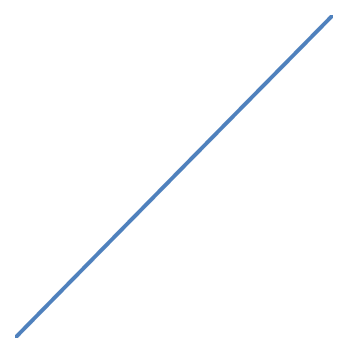
| Category | Series 0 |
|---|---|
| 0.0 | 0 |
| 0.0001 | 0 |
| 0.0002 | 0 |
| 0.0003 | 0 |
| 0.0004 | 0 |
| 0.0005 | 0 |
| 0.0006 | 0.001 |
| 0.0007 | 0.001 |
| 0.0008 | 0.001 |
| 0.0009 | 0.001 |
| 0.001 | 0.001 |
| 0.0011 | 0.001 |
| 0.0012 | 0.001 |
| 0.0013 | 0.001 |
| 0.0014 | 0.001 |
| 0.0015 | 0.001 |
| 0.0016 | 0.002 |
| 0.0017 | 0.002 |
| 0.0018 | 0.002 |
| 0.0019 | 0.002 |
| 0.002 | 0.002 |
| 0.0021 | 0.002 |
| 0.0022 | 0.002 |
| 0.0023 | 0.002 |
| 0.0024 | 0.002 |
| 0.0025 | 0.002 |
| 0.0026 | 0.003 |
| 0.0027 | 0.003 |
| 0.0028 | 0.003 |
| 0.0029 | 0.003 |
| 0.003 | 0.003 |
| 0.0031 | 0.003 |
| 0.0032 | 0.003 |
| 0.0033 | 0.003 |
| 0.0034 | 0.003 |
| 0.0035 | 0.003 |
| 0.0036 | 0.004 |
| 0.0037 | 0.004 |
| 0.0038 | 0.004 |
| 0.0039 | 0.004 |
| 0.004 | 0.004 |
| 0.0041 | 0.004 |
| 0.0042 | 0.004 |
| 0.0043 | 0.004 |
| 0.0044 | 0.004 |
| 0.0045 | 0.004 |
| 0.0046 | 0.005 |
| 0.0047 | 0.005 |
| 0.0048 | 0.005 |
| 0.0049 | 0.005 |
| 0.005 | 0.005 |
| 0.0051 | 0.005 |
| 0.0052 | 0.005 |
| 0.0053 | 0.005 |
| 0.0054 | 0.005 |
| 0.0055 | 0.005 |
| 0.0056 | 0.006 |
| 0.0057 | 0.006 |
| 0.0058 | 0.006 |
| 0.0059 | 0.006 |
| 0.006 | 0.006 |
| 0.0061 | 0.006 |
| 0.0062 | 0.006 |
| 0.0063 | 0.006 |
| 0.0064 | 0.006 |
| 0.0065 | 0.006 |
| 0.0066 | 0.007 |
| 0.0067 | 0.007 |
| 0.0068 | 0.007 |
| 0.0069 | 0.007 |
| 0.007 | 0.007 |
| 0.0071 | 0.007 |
| 0.0072 | 0.007 |
| 0.0073 | 0.007 |
| 0.0074 | 0.007 |
| 0.0075 | 0.007 |
| 0.0076 | 0.008 |
| 0.0077 | 0.008 |
| 0.0078 | 0.008 |
| 0.0079 | 0.008 |
| 0.008 | 0.008 |
| 0.0081 | 0.008 |
| 0.0082 | 0.008 |
| 0.0083 | 0.008 |
| 0.0084 | 0.008 |
| 0.0085 | 0.008 |
| 0.0086 | 0.009 |
| 0.0087 | 0.009 |
| 0.0088 | 0.009 |
| 0.0089 | 0.009 |
| 0.009 | 0.009 |
| 0.0091 | 0.009 |
| 0.0092 | 0.009 |
| 0.0093 | 0.009 |
| 0.0094 | 0.009 |
| 0.0095 | 0.009 |
| 0.0096 | 0.01 |
| 0.0097 | 0.01 |
| 0.0098 | 0.01 |
| 0.0099 | 0.01 |
| 0.01 | 0.01 |
| 0.0101 | 0.01 |
| 0.0102 | 0.01 |
| 0.0103 | 0.01 |
| 0.0104 | 0.01 |
| 0.0105 | 0.01 |
| 0.0106 | 0.011 |
| 0.0107 | 0.011 |
| 0.0108 | 0.011 |
| 0.0109 | 0.011 |
| 0.011 | 0.011 |
| 0.0111 | 0.011 |
| 0.0112 | 0.011 |
| 0.0113 | 0.011 |
| 0.0114 | 0.011 |
| 0.0115 | 0.011 |
| 0.0116 | 0.012 |
| 0.0117 | 0.012 |
| 0.0118 | 0.012 |
| 0.0119 | 0.012 |
| 0.012 | 0.012 |
| 0.0121 | 0.012 |
| 0.0122 | 0.012 |
| 0.0123 | 0.012 |
| 0.0124 | 0.012 |
| 0.0125 | 0.012 |
| 0.0126 | 0.013 |
| 0.0127 | 0.013 |
| 0.0128 | 0.013 |
| 0.0129 | 0.013 |
| 0.013 | 0.013 |
| 0.0131 | 0.013 |
| 0.0132 | 0.013 |
| 0.0133 | 0.013 |
| 0.0134 | 0.013 |
| 0.0135 | 0.014 |
| 0.0136 | 0.014 |
| 0.0137 | 0.014 |
| 0.0138 | 0.014 |
| 0.0139 | 0.014 |
| 0.014 | 0.014 |
| 0.0141 | 0.014 |
| 0.0142 | 0.014 |
| 0.0143 | 0.014 |
| 0.0144 | 0.014 |
| 0.0145 | 0.015 |
| 0.0146 | 0.015 |
| 0.0147 | 0.015 |
| 0.0148 | 0.015 |
| 0.0149 | 0.015 |
| 0.015 | 0.015 |
| 0.0151 | 0.015 |
| 0.0152 | 0.015 |
| 0.0153 | 0.015 |
| 0.0154 | 0.015 |
| 0.0155 | 0.016 |
| 0.0156 | 0.016 |
| 0.0157 | 0.016 |
| 0.0158 | 0.016 |
| 0.0159 | 0.016 |
| 0.016 | 0.016 |
| 0.0161 | 0.016 |
| 0.0162 | 0.016 |
| 0.0163 | 0.016 |
| 0.0164 | 0.016 |
| 0.0165 | 0.017 |
| 0.0166 | 0.017 |
| 0.0167 | 0.017 |
| 0.0168 | 0.017 |
| 0.0169 | 0.017 |
| 0.017 | 0.017 |
| 0.0171 | 0.017 |
| 0.0172 | 0.017 |
| 0.0173 | 0.017 |
| 0.0174 | 0.017 |
| 0.0175 | 0.018 |
| 0.0176 | 0.018 |
| 0.0177 | 0.018 |
| 0.0178 | 0.018 |
| 0.0179 | 0.018 |
| 0.018 | 0.018 |
| 0.0181 | 0.018 |
| 0.0182 | 0.018 |
| 0.0183 | 0.018 |
| 0.0184 | 0.018 |
| 0.0185 | 0.019 |
| 0.0186 | 0.019 |
| 0.0187 | 0.019 |
| 0.0188 | 0.019 |
| 0.0189 | 0.019 |
| 0.019 | 0.019 |
| 0.0191 | 0.019 |
| 0.0192 | 0.019 |
| 0.0193 | 0.019 |
| 0.0194 | 0.019 |
| 0.0195 | 0.02 |
| 0.0196 | 0.02 |
| 0.0197 | 0.02 |
| 0.0198 | 0.02 |
| 0.0199 | 0.02 |
| 0.02 | 0.02 |
| 0.0201 | 0.02 |
| 0.0202 | 0.02 |
| 0.0203 | 0.02 |
| 0.0204 | 0.02 |
| 0.0205 | 0.021 |
| 0.0206 | 0.021 |
| 0.0207 | 0.021 |
| 0.0208 | 0.021 |
| 0.0209 | 0.021 |
| 0.021 | 0.021 |
| 0.0211 | 0.021 |
| 0.0212 | 0.021 |
| 0.0213 | 0.021 |
| 0.0214 | 0.021 |
| 0.0215 | 0.022 |
| 0.0216 | 0.022 |
| 0.0217 | 0.022 |
| 0.0218 | 0.022 |
| 0.0219 | 0.022 |
| 0.022 | 0.022 |
| 0.0221 | 0.022 |
| 0.0222 | 0.022 |
| 0.0223 | 0.022 |
| 0.0224 | 0.022 |
| 0.0225 | 0.023 |
| 0.0226 | 0.023 |
| 0.0227 | 0.023 |
| 0.0228 | 0.023 |
| 0.0229 | 0.023 |
| 0.023 | 0.023 |
| 0.0231 | 0.023 |
| 0.0232 | 0.023 |
| 0.0233 | 0.023 |
| 0.0234 | 0.023 |
| 0.0235 | 0.024 |
| 0.0236 | 0.024 |
| 0.0237 | 0.024 |
| 0.0238 | 0.024 |
| 0.0239 | 0.024 |
| 0.024 | 0.024 |
| 0.0241 | 0.024 |
| 0.0242 | 0.024 |
| 0.0243 | 0.024 |
| 0.0244 | 0.024 |
| 0.0245 | 0.025 |
| 0.0246 | 0.025 |
| 0.0247 | 0.025 |
| 0.0248 | 0.025 |
| 0.0249 | 0.025 |
| 0.025 | 0.025 |
| 0.0251 | 0.025 |
| 0.0252 | 0.025 |
| 0.0253 | 0.025 |
| 0.0254 | 0.025 |
| 0.0255 | 0.026 |
| 0.0256 | 0.026 |
| 0.0257 | 0.026 |
| 0.0258 | 0.026 |
| 0.0259 | 0.026 |
| 0.026 | 0.026 |
| 0.0261 | 0.026 |
| 0.0262 | 0.026 |
| 0.0263 | 0.026 |
| 0.0264 | 0.026 |
| 0.0265 | 0.027 |
| 0.0266 | 0.027 |
| 0.0267 | 0.027 |
| 0.0268 | 0.027 |
| 0.0269 | 0.027 |
| 0.027 | 0.027 |
| 0.0271 | 0.027 |
| 0.0272 | 0.027 |
| 0.0273 | 0.027 |
| 0.0274 | 0.027 |
| 0.0275 | 0.028 |
| 0.0276 | 0.028 |
| 0.0277 | 0.028 |
| 0.0278 | 0.028 |
| 0.0279 | 0.028 |
| 0.028 | 0.028 |
| 0.0281 | 0.028 |
| 0.0282 | 0.028 |
| 0.0283 | 0.028 |
| 0.0284 | 0.028 |
| 0.0285 | 0.029 |
| 0.0286 | 0.029 |
| 0.0287 | 0.029 |
| 0.0288 | 0.029 |
| 0.0289 | 0.029 |
| 0.029 | 0.029 |
| 0.0291 | 0.029 |
| 0.0292 | 0.029 |
| 0.0293 | 0.029 |
| 0.0294 | 0.029 |
| 0.0295 | 0.03 |
| 0.0296 | 0.03 |
| 0.0297 | 0.03 |
| 0.0298 | 0.03 |
| 0.0299 | 0.03 |
| 0.03 | 0.03 |
| 0.0301 | 0.03 |
| 0.0302 | 0.03 |
| 0.0303 | 0.03 |
| 0.0304 | 0.03 |
| 0.0305 | 0.031 |
| 0.0306 | 0.031 |
| 0.0307 | 0.031 |
| 0.0308 | 0.031 |
| 0.0309 | 0.031 |
| 0.031 | 0.031 |
| 0.0311 | 0.031 |
| 0.0312 | 0.031 |
| 0.0313 | 0.031 |
| 0.0314 | 0.031 |
| 0.0315 | 0.032 |
| 0.0316 | 0.032 |
| 0.0317 | 0.032 |
| 0.0318 | 0.032 |
| 0.0319 | 0.032 |
| 0.032 | 0.032 |
| 0.0321 | 0.032 |
| 0.0322 | 0.032 |
| 0.0323 | 0.032 |
| 0.0324 | 0.032 |
| 0.0325 | 0.033 |
| 0.0326 | 0.033 |
| 0.0327 | 0.033 |
| 0.0328 | 0.033 |
| 0.0329 | 0.033 |
| 0.033 | 0.033 |
| 0.0331 | 0.033 |
| 0.0332 | 0.033 |
| 0.0333 | 0.033 |
| 0.0334 | 0.033 |
| 0.0335 | 0.034 |
| 0.0336 | 0.034 |
| 0.0337 | 0.034 |
| 0.0338 | 0.034 |
| 0.0339 | 0.034 |
| 0.034 | 0.034 |
| 0.0341 | 0.034 |
| 0.0342 | 0.034 |
| 0.0343 | 0.034 |
| 0.0344 | 0.034 |
| 0.0345 | 0.035 |
| 0.0346 | 0.035 |
| 0.0347 | 0.035 |
| 0.0348 | 0.035 |
| 0.0349 | 0.035 |
| 0.035 | 0.035 |
| 0.0351 | 0.035 |
| 0.0352 | 0.035 |
| 0.0353 | 0.035 |
| 0.0354 | 0.035 |
| 0.0355 | 0.036 |
| 0.0356 | 0.036 |
| 0.0357 | 0.036 |
| 0.0358 | 0.036 |
| 0.0359 | 0.036 |
| 0.036 | 0.036 |
| 0.0361 | 0.036 |
| 0.0362 | 0.036 |
| 0.0363 | 0.036 |
| 0.0364 | 0.036 |
| 0.0365 | 0.037 |
| 0.0366 | 0.037 |
| 0.0367 | 0.037 |
| 0.0368 | 0.037 |
| 0.0369 | 0.037 |
| 0.037 | 0.037 |
| 0.0371 | 0.037 |
| 0.0372 | 0.037 |
| 0.0373 | 0.037 |
| 0.0374 | 0.037 |
| 0.0375 | 0.038 |
| 0.0376 | 0.038 |
| 0.0377 | 0.038 |
| 0.0378 | 0.038 |
| 0.0379 | 0.038 |
| 0.038 | 0.038 |
| 0.0381 | 0.038 |
| 0.0382 | 0.038 |
| 0.0383 | 0.038 |
| 0.0384 | 0.038 |
| 0.0385 | 0.039 |
| 0.0386 | 0.039 |
| 0.0387 | 0.039 |
| 0.0388 | 0.039 |
| 0.0389 | 0.039 |
| 0.039 | 0.039 |
| 0.0391 | 0.039 |
| 0.0392 | 0.039 |
| 0.0393 | 0.039 |
| 0.0394 | 0.039 |
| 0.0395 | 0.04 |
| 0.0396 | 0.04 |
| 0.0397 | 0.04 |
| 0.0398 | 0.04 |
| 0.0399 | 0.04 |
| 0.04 | 0.04 |
| 0.0401 | 0.04 |
| 0.0402 | 0.04 |
| 0.0403 | 0.04 |
| 0.0404 | 0.04 |
| 0.0405 | 0.041 |
| 0.0406 | 0.041 |
| 0.0407 | 0.041 |
| 0.0408 | 0.041 |
| 0.0409 | 0.041 |
| 0.041 | 0.041 |
| 0.0411 | 0.041 |
| 0.0412 | 0.041 |
| 0.0413 | 0.041 |
| 0.0414 | 0.041 |
| 0.0415 | 0.042 |
| 0.0416 | 0.042 |
| 0.0417 | 0.042 |
| 0.0418 | 0.042 |
| 0.0419 | 0.042 |
| 0.042 | 0.042 |
| 0.0421 | 0.042 |
| 0.0422 | 0.042 |
| 0.0423 | 0.042 |
| 0.0424 | 0.042 |
| 0.0425 | 0.043 |
| 0.0426 | 0.043 |
| 0.0427 | 0.043 |
| 0.0428 | 0.043 |
| 0.0429 | 0.043 |
| 0.043 | 0.043 |
| 0.0431 | 0.043 |
| 0.0432 | 0.043 |
| 0.0433 | 0.043 |
| 0.0434 | 0.043 |
| 0.0435 | 0.044 |
| 0.0436 | 0.044 |
| 0.0437 | 0.044 |
| 0.0438 | 0.044 |
| 0.0439 | 0.044 |
| 0.044 | 0.044 |
| 0.0441 | 0.044 |
| 0.0442 | 0.044 |
| 0.0443 | 0.044 |
| 0.0444 | 0.044 |
| 0.0445 | 0.045 |
| 0.0446 | 0.045 |
| 0.0447 | 0.045 |
| 0.0448 | 0.045 |
| 0.0449 | 0.045 |
| 0.045 | 0.045 |
| 0.0451 | 0.045 |
| 0.0452 | 0.045 |
| 0.0453 | 0.045 |
| 0.0454 | 0.046 |
| 0.0455 | 0.046 |
| 0.0456 | 0.046 |
| 0.0457 | 0.046 |
| 0.0458 | 0.046 |
| 0.0459 | 0.046 |
| 0.046 | 0.046 |
| 0.0461 | 0.046 |
| 0.0462 | 0.046 |
| 0.0463 | 0.046 |
| 0.0464 | 0.047 |
| 0.0465 | 0.047 |
| 0.0466 | 0.047 |
| 0.0467 | 0.047 |
| 0.0468 | 0.047 |
| 0.0469 | 0.047 |
| 0.047 | 0.047 |
| 0.0471 | 0.047 |
| 0.0472 | 0.047 |
| 0.0473 | 0.047 |
| 0.0474 | 0.047 |
| 0.0475 | 0.048 |
| 0.0476 | 0.048 |
| 0.0477 | 0.048 |
| 0.0478 | 0.048 |
| 0.0479 | 0.048 |
| 0.048 | 0.048 |
| 0.0481 | 0.048 |
| 0.0482 | 0.048 |
| 0.0483 | 0.048 |
| 0.0484 | 0.048 |
| 0.0485 | 0.049 |
| 0.0486 | 0.049 |
| 0.0487 | 0.049 |
| 0.0488 | 0.049 |
| 0.0489 | 0.049 |
| 0.049 | 0.049 |
| 0.0491 | 0.049 |
| 0.0492 | 0.049 |
| 0.0493 | 0.049 |
| 0.0494 | 0.049 |
| 0.0495 | 0.05 |
| 0.0496 | 0.05 |
| 0.0497 | 0.05 |
| 0.0498 | 0.05 |
| 0.0499 | 0.05 |
| 0.05 | 0.05 |
| 0.0501 | 0.05 |
| 0.0502 | 0.05 |
| 0.0503 | 0.05 |
| 0.0504 | 0.051 |
| 0.0505 | 0.051 |
| 0.0506 | 0.051 |
| 0.0507 | 0.051 |
| 0.0508 | 0.051 |
| 0.0509 | 0.051 |
| 0.051 | 0.051 |
| 0.0511 | 0.051 |
| 0.0512 | 0.051 |
| 0.0513 | 0.051 |
| 0.0514 | 0.051 |
| 0.0515 | 0.052 |
| 0.0516 | 0.052 |
| 0.0517 | 0.052 |
| 0.0518 | 0.052 |
| 0.0519 | 0.052 |
| 0.052 | 0.052 |
| 0.0521 | 0.052 |
| 0.0522 | 0.052 |
| 0.0523 | 0.052 |
| 0.0524 | 0.052 |
| 0.0525 | 0.053 |
| 0.0526 | 0.053 |
| 0.0527 | 0.053 |
| 0.0528 | 0.053 |
| 0.0529 | 0.053 |
| 0.053 | 0.053 |
| 0.0531 | 0.053 |
| 0.0532 | 0.053 |
| 0.0533 | 0.053 |
| 0.0534 | 0.054 |
| 0.0535 | 0.054 |
| 0.0536 | 0.054 |
| 0.0537 | 0.054 |
| 0.0538 | 0.054 |
| 0.0539 | 0.054 |
| 0.054 | 0.054 |
| 0.0541 | 0.054 |
| 0.0542 | 0.054 |
| 0.0543 | 0.054 |
| 0.0544 | 0.055 |
| 0.0545 | 0.055 |
| 0.0546 | 0.055 |
| 0.0547 | 0.055 |
| 0.0548 | 0.055 |
| 0.0549 | 0.055 |
| 0.055 | 0.055 |
| 0.0551 | 0.055 |
| 0.0552 | 0.055 |
| 0.0553 | 0.055 |
| 0.0554 | 0.056 |
| 0.0555 | 0.056 |
| 0.0556 | 0.056 |
| 0.0557 | 0.056 |
| 0.0558 | 0.056 |
| 0.0559 | 0.056 |
| 0.056 | 0.056 |
| 0.0561 | 0.056 |
| 0.0562 | 0.056 |
| 0.0563 | 0.056 |
| 0.0564 | 0.057 |
| 0.0565 | 0.057 |
| 0.0566 | 0.057 |
| 0.0567 | 0.057 |
| 0.0568 | 0.057 |
| 0.0569 | 0.057 |
| 0.057 | 0.057 |
| 0.0571 | 0.057 |
| 0.0572 | 0.057 |
| 0.0573 | 0.057 |
| 0.0574 | 0.058 |
| 0.0575 | 0.058 |
| 0.0576 | 0.058 |
| 0.0577 | 0.058 |
| 0.0578 | 0.058 |
| 0.0579 | 0.058 |
| 0.058 | 0.058 |
| 0.0581 | 0.058 |
| 0.0582 | 0.058 |
| 0.0583 | 0.058 |
| 0.0584 | 0.059 |
| 0.0585 | 0.059 |
| 0.0586 | 0.059 |
| 0.0587 | 0.059 |
| 0.0588 | 0.059 |
| 0.0589 | 0.059 |
| 0.059 | 0.059 |
| 0.0591 | 0.059 |
| 0.0592 | 0.059 |
| 0.0593 | 0.059 |
| 0.0594 | 0.059 |
| 0.0595 | 0.06 |
| 0.0596 | 0.06 |
| 0.0597 | 0.06 |
| 0.0598 | 0.06 |
| 0.0599 | 0.06 |
| 0.06 | 0.06 |
| 0.0601 | 0.06 |
| 0.0602 | 0.06 |
| 0.0603 | 0.06 |
| 0.0604 | 0.06 |
| 0.0605 | 0.061 |
| 0.0606 | 0.061 |
| 0.0607 | 0.061 |
| 0.0608 | 0.061 |
| 0.0609 | 0.061 |
| 0.061 | 0.061 |
| 0.0611 | 0.061 |
| 0.0612 | 0.061 |
| 0.0613 | 0.061 |
| 0.0614 | 0.062 |
| 0.0615 | 0.062 |
| 0.0616 | 0.062 |
| 0.0617 | 0.062 |
| 0.0618 | 0.062 |
| 0.0619 | 0.062 |
| 0.062 | 0.062 |
| 0.0621 | 0.062 |
| 0.0622 | 0.062 |
| 0.0623 | 0.062 |
| 0.0624 | 0.062 |
| 0.0625 | 0.063 |
| 0.0626 | 0.063 |
| 0.0627 | 0.063 |
| 0.0628 | 0.063 |
| 0.0629 | 0.063 |
| 0.063 | 0.063 |
| 0.0631 | 0.063 |
| 0.0632 | 0.063 |
| 0.0633 | 0.063 |
| 0.0634 | 0.064 |
| 0.0635 | 0.064 |
| 0.0636 | 0.064 |
| 0.0637 | 0.064 |
| 0.0638 | 0.064 |
| 0.0639 | 0.064 |
| 0.064 | 0.064 |
| 0.0641 | 0.064 |
| 0.0642 | 0.064 |
| 0.0643 | 0.064 |
| 0.0644 | 0.065 |
| 0.0645 | 0.065 |
| 0.0646 | 0.065 |
| 0.0647 | 0.065 |
| 0.0648 | 0.065 |
| 0.0649 | 0.065 |
| 0.065 | 0.065 |
| 0.0651 | 0.065 |
| 0.0652 | 0.065 |
| 0.0653 | 0.065 |
| 0.0654 | 0.066 |
| 0.0655 | 0.066 |
| 0.0656 | 0.066 |
| 0.0657 | 0.066 |
| 0.0658 | 0.066 |
| 0.0659 | 0.066 |
| 0.066 | 0.066 |
| 0.0661 | 0.066 |
| 0.0662 | 0.066 |
| 0.0663 | 0.066 |
| 0.0664 | 0.067 |
| 0.0665 | 0.067 |
| 0.0666 | 0.067 |
| 0.0667 | 0.067 |
| 0.0668 | 0.067 |
| 0.0669 | 0.067 |
| 0.067 | 0.067 |
| 0.0671 | 0.067 |
| 0.0672 | 0.067 |
| 0.0673 | 0.067 |
| 0.0674 | 0.068 |
| 0.0675 | 0.068 |
| 0.0676 | 0.068 |
| 0.0677 | 0.068 |
| 0.0678 | 0.068 |
| 0.0679 | 0.068 |
| 0.068 | 0.068 |
| 0.0681 | 0.068 |
| 0.0682 | 0.068 |
| 0.0683 | 0.068 |
| 0.0684 | 0.069 |
| 0.0685 | 0.069 |
| 0.0686 | 0.069 |
| 0.0687 | 0.069 |
| 0.0688 | 0.069 |
| 0.0689 | 0.069 |
| 0.069 | 0.069 |
| 0.0691 | 0.069 |
| 0.0692 | 0.069 |
| 0.0693 | 0.069 |
| 0.0694 | 0.07 |
| 0.0695 | 0.07 |
| 0.0696 | 0.07 |
| 0.0697 | 0.07 |
| 0.0698 | 0.07 |
| 0.0699 | 0.07 |
| 0.07 | 0.07 |
| 0.0701 | 0.07 |
| 0.0702 | 0.07 |
| 0.0703 | 0.07 |
| 0.0704 | 0.071 |
| 0.0705 | 0.071 |
| 0.0706 | 0.071 |
| 0.0707 | 0.071 |
| 0.0708 | 0.071 |
| 0.0709 | 0.071 |
| 0.071 | 0.071 |
| 0.0711 | 0.071 |
| 0.0712 | 0.071 |
| 0.0713 | 0.071 |
| 0.0714 | 0.072 |
| 0.0715 | 0.072 |
| 0.0716 | 0.072 |
| 0.0717 | 0.072 |
| 0.0718 | 0.072 |
| 0.0719 | 0.072 |
| 0.072 | 0.072 |
| 0.0721 | 0.072 |
| 0.0722 | 0.072 |
| 0.0723 | 0.072 |
| 0.0724 | 0.073 |
| 0.0725 | 0.073 |
| 0.0726 | 0.073 |
| 0.0727 | 0.073 |
| 0.0728 | 0.073 |
| 0.0729 | 0.073 |
| 0.073 | 0.073 |
| 0.0731 | 0.073 |
| 0.0732 | 0.073 |
| 0.0733 | 0.073 |
| 0.0734 | 0.074 |
| 0.0735 | 0.074 |
| 0.0736 | 0.074 |
| 0.0737 | 0.074 |
| 0.0738 | 0.074 |
| 0.0739 | 0.074 |
| 0.074 | 0.074 |
| 0.0741 | 0.074 |
| 0.0742 | 0.074 |
| 0.0743 | 0.074 |
| 0.0744 | 0.075 |
| 0.0745 | 0.075 |
| 0.0746 | 0.075 |
| 0.0747 | 0.075 |
| 0.0748 | 0.075 |
| 0.0749 | 0.075 |
| 0.075 | 0.075 |
| 0.0751 | 0.075 |
| 0.0752 | 0.075 |
| 0.0753 | 0.075 |
| 0.0754 | 0.076 |
| 0.0755 | 0.076 |
| 0.0756 | 0.076 |
| 0.0757 | 0.076 |
| 0.0758 | 0.076 |
| 0.0759 | 0.076 |
| 0.076 | 0.076 |
| 0.0761 | 0.076 |
| 0.0762 | 0.076 |
| 0.0763 | 0.076 |
| 0.0764 | 0.077 |
| 0.0765 | 0.077 |
| 0.0766 | 0.077 |
| 0.0767 | 0.077 |
| 0.0768 | 0.077 |
| 0.0769 | 0.077 |
| 0.077 | 0.077 |
| 0.0771 | 0.077 |
| 0.0772 | 0.077 |
| 0.0773 | 0.077 |
| 0.0774 | 0.078 |
| 0.0775 | 0.078 |
| 0.0776 | 0.078 |
| 0.0777 | 0.078 |
| 0.0778 | 0.078 |
| 0.0779 | 0.078 |
| 0.078 | 0.078 |
| 0.0781 | 0.078 |
| 0.0782 | 0.078 |
| 0.0783 | 0.078 |
| 0.0784 | 0.079 |
| 0.0785 | 0.079 |
| 0.0786 | 0.079 |
| 0.0787 | 0.079 |
| 0.0788 | 0.079 |
| 0.0789 | 0.079 |
| 0.079 | 0.079 |
| 0.0791 | 0.079 |
| 0.0792 | 0.079 |
| 0.0793 | 0.079 |
| 0.0794 | 0.08 |
| 0.0795 | 0.08 |
| 0.0796 | 0.08 |
| 0.0797 | 0.08 |
| 0.0798 | 0.08 |
| 0.0799 | 0.08 |
| 0.08 | 0.08 |
| 0.0801 | 0.08 |
| 0.0802 | 0.08 |
| 0.0803 | 0.08 |
| 0.0804 | 0.081 |
| 0.0805 | 0.081 |
| 0.0806 | 0.081 |
| 0.0807 | 0.081 |
| 0.0808 | 0.081 |
| 0.0809 | 0.081 |
| 0.081 | 0.081 |
| 0.0811 | 0.081 |
| 0.0812 | 0.081 |
| 0.0813 | 0.081 |
| 0.0814 | 0.082 |
| 0.0815 | 0.082 |
| 0.0816 | 0.082 |
| 0.0817 | 0.082 |
| 0.0818 | 0.082 |
| 0.0819 | 0.082 |
| 0.082 | 0.082 |
| 0.0821 | 0.082 |
| 0.0822 | 0.082 |
| 0.0823 | 0.082 |
| 0.0824 | 0.083 |
| 0.0825 | 0.083 |
| 0.0826 | 0.083 |
| 0.0827 | 0.083 |
| 0.0828 | 0.083 |
| 0.0829 | 0.083 |
| 0.083 | 0.083 |
| 0.0831 | 0.083 |
| 0.0832 | 0.083 |
| 0.0833 | 0.084 |
| 0.0834 | 0.084 |
| 0.0835 | 0.084 |
| 0.0836 | 0.084 |
| 0.0837 | 0.084 |
| 0.0838 | 0.084 |
| 0.0839 | 0.084 |
| 0.084 | 0.084 |
| 0.0841 | 0.084 |
| 0.0842 | 0.084 |
| 0.0843 | 0.084 |
| 0.0844 | 0.085 |
| 0.0845 | 0.085 |
| 0.0846 | 0.085 |
| 0.0847 | 0.085 |
| 0.0848 | 0.085 |
| 0.0849 | 0.085 |
| 0.085 | 0.085 |
| 0.0851 | 0.085 |
| 0.0852 | 0.085 |
| 0.0853 | 0.085 |
| 0.0854 | 0.086 |
| 0.0855 | 0.086 |
| 0.0856 | 0.086 |
| 0.0857 | 0.086 |
| 0.0858 | 0.086 |
| 0.0859 | 0.086 |
| 0.086 | 0.086 |
| 0.0861 | 0.086 |
| 0.0862 | 0.086 |
| 0.0863 | 0.086 |
| 0.0864 | 0.087 |
| 0.0865 | 0.087 |
| 0.0866 | 0.087 |
| 0.0867 | 0.087 |
| 0.0868 | 0.087 |
| 0.0869 | 0.087 |
| 0.087 | 0.087 |
| 0.0871 | 0.087 |
| 0.0872 | 0.087 |
| 0.0873 | 0.087 |
| 0.0874 | 0.088 |
| 0.0875 | 0.088 |
| 0.0876 | 0.088 |
| 0.0877 | 0.088 |
| 0.0878 | 0.088 |
| 0.0879 | 0.088 |
| 0.088 | 0.088 |
| 0.0881 | 0.088 |
| 0.0882 | 0.088 |
| 0.0883 | 0.088 |
| 0.0884 | 0.089 |
| 0.0885 | 0.089 |
| 0.0886 | 0.089 |
| 0.0887 | 0.089 |
| 0.0888 | 0.089 |
| 0.0889 | 0.089 |
| 0.089 | 0.089 |
| 0.0891 | 0.089 |
| 0.0892 | 0.089 |
| 0.0893 | 0.089 |
| 0.0894 | 0.09 |
| 0.0895 | 0.09 |
| 0.0896 | 0.09 |
| 0.0897 | 0.09 |
| 0.0898 | 0.09 |
| 0.0899 | 0.09 |
| 0.09 | 0.09 |
| 0.0901 | 0.09 |
| 0.0902 | 0.09 |
| 0.0903 | 0.091 |
| 0.0904 | 0.091 |
| 0.0905 | 0.091 |
| 0.0906 | 0.091 |
| 0.0907 | 0.091 |
| 0.0908 | 0.091 |
| 0.0909 | 0.091 |
| 0.091 | 0.091 |
| 0.0911 | 0.091 |
| 0.0912 | 0.091 |
| 0.0913 | 0.092 |
| 0.0914 | 0.092 |
| 0.0915 | 0.092 |
| 0.0916 | 0.092 |
| 0.0917 | 0.092 |
| 0.0918 | 0.092 |
| 0.0919 | 0.092 |
| 0.092 | 0.092 |
| 0.0921 | 0.092 |
| 0.0922 | 0.092 |
| 0.0923 | 0.092 |
| 0.0924 | 0.093 |
| 0.0925 | 0.093 |
| 0.0926 | 0.093 |
| 0.0927 | 0.093 |
| 0.0928 | 0.093 |
| 0.0929 | 0.093 |
| 0.093 | 0.093 |
| 0.0931 | 0.093 |
| 0.0932 | 0.093 |
| 0.0933 | 0.093 |
| 0.0934 | 0.094 |
| 0.0935 | 0.094 |
| 0.0936 | 0.094 |
| 0.0937 | 0.094 |
| 0.0938 | 0.094 |
| 0.0939 | 0.094 |
| 0.094 | 0.094 |
| 0.0941 | 0.094 |
| 0.0942 | 0.094 |
| 0.0943 | 0.094 |
| 0.0944 | 0.095 |
| 0.0945 | 0.095 |
| 0.0946 | 0.095 |
| 0.0947 | 0.095 |
| 0.0948 | 0.095 |
| 0.0949 | 0.095 |
| 0.095 | 0.095 |
| 0.0951 | 0.095 |
| 0.0952 | 0.095 |
| 0.0953 | 0.096 |
| 0.0954 | 0.096 |
| 0.0955 | 0.096 |
| 0.0956 | 0.096 |
| 0.0957 | 0.096 |
| 0.0958 | 0.096 |
| 0.0959 | 0.096 |
| 0.096 | 0.096 |
| 0.0961 | 0.096 |
| 0.0962 | 0.096 |
| 0.0963 | 0.096 |
| 0.0964 | 0.097 |
| 0.0965 | 0.097 |
| 0.0966 | 0.097 |
| 0.0967 | 0.097 |
| 0.0968 | 0.097 |
| 0.0969 | 0.097 |
| 0.097 | 0.097 |
| 0.0971 | 0.097 |
| 0.0972 | 0.097 |
| 0.0973 | 0.098 |
| 0.0974 | 0.098 |
| 0.0975 | 0.098 |
| 0.0976 | 0.098 |
| 0.0977 | 0.098 |
| 0.0978 | 0.098 |
| 0.0979 | 0.098 |
| 0.098 | 0.098 |
| 0.0981 | 0.098 |
| 0.0982 | 0.098 |
| 0.0983 | 0.098 |
| 0.0984 | 0.099 |
| 0.0985 | 0.099 |
| 0.0986 | 0.099 |
| 0.0987 | 0.099 |
| 0.0988 | 0.099 |
| 0.0989 | 0.099 |
| 0.099 | 0.099 |
| 0.0991 | 0.099 |
| 0.0992 | 0.099 |
| 0.0993 | 0.099 |
| 0.0994 | 0.1 |
| 0.0995 | 0.1 |
| 0.0996 | 0.1 |
| 0.0997 | 0.1 |
| 0.0998 | 0.1 |
| 0.0999 | 0.1 |
| 0.1 | 0.1 |
| 0.1001 | 0.1 |
| 0.1002 | 0.1 |
| 0.1003 | 0.1 |
| 0.1004 | 0.101 |
| 0.1005 | 0.101 |
| 0.1006 | 0.101 |
| 0.1007 | 0.101 |
| 0.1008 | 0.101 |
| 0.1009 | 0.101 |
| 0.101 | 0.101 |
| 0.1011 | 0.101 |
| 0.1012 | 0.101 |
| 0.1013 | 0.101 |
| 0.1014 | 0.102 |
| 0.1015 | 0.102 |
| 0.1016 | 0.102 |
| 0.1017 | 0.102 |
| 0.1018 | 0.102 |
| 0.1019 | 0.102 |
| 0.102 | 0.102 |
| 0.1021 | 0.102 |
| 0.1022 | 0.102 |
| 0.1023 | 0.102 |
| 0.1024 | 0.103 |
| 0.1025 | 0.103 |
| 0.1026 | 0.103 |
| 0.1027 | 0.103 |
| 0.1028 | 0.103 |
| 0.1029 | 0.103 |
| 0.103 | 0.103 |
| 0.1031 | 0.103 |
| 0.1032 | 0.103 |
| 0.1033 | 0.104 |
| 0.1034 | 0.104 |
| 0.1035 | 0.104 |
| 0.1036 | 0.104 |
| 0.1037 | 0.104 |
| 0.1038 | 0.104 |
| 0.1039 | 0.104 |
| 0.104 | 0.104 |
| 0.1041 | 0.104 |
| 0.1042 | 0.104 |
| 0.1043 | 0.104 |
| 0.1044 | 0.105 |
| 0.1045 | 0.105 |
| 0.1046 | 0.105 |
| 0.1047 | 0.105 |
| 0.1048 | 0.105 |
| 0.1049 | 0.105 |
| 0.105 | 0.105 |
| 0.1051 | 0.105 |
| 0.1052 | 0.105 |
| 0.1053 | 0.105 |
| 0.1054 | 0.106 |
| 0.1055 | 0.106 |
| 0.1056 | 0.106 |
| 0.1057 | 0.106 |
| 0.1058 | 0.106 |
| 0.1059 | 0.106 |
| 0.106 | 0.106 |
| 0.1061 | 0.106 |
| 0.1062 | 0.106 |
| 0.1063 | 0.107 |
| 0.1064 | 0.107 |
| 0.1065 | 0.107 |
| 0.1066 | 0.107 |
| 0.1067 | 0.107 |
| 0.1068 | 0.107 |
| 0.1069 | 0.107 |
| 0.107 | 0.107 |
| 0.1071 | 0.107 |
| 0.1072 | 0.107 |
| 0.1073 | 0.108 |
| 0.1074 | 0.108 |
| 0.1075 | 0.108 |
| 0.1076 | 0.108 |
| 0.1077 | 0.108 |
| 0.1078 | 0.108 |
| 0.1079 | 0.108 |
| 0.108 | 0.108 |
| 0.1081 | 0.108 |
| 0.1082 | 0.108 |
| 0.1083 | 0.108 |
| 0.1084 | 0.109 |
| 0.1085 | 0.109 |
| 0.1086 | 0.109 |
| 0.1087 | 0.109 |
| 0.1088 | 0.109 |
| 0.1089 | 0.109 |
| 0.109 | 0.109 |
| 0.1091 | 0.109 |
| 0.1092 | 0.109 |
| 0.1093 | 0.109 |
| 0.1094 | 0.11 |
| 0.1095 | 0.11 |
| 0.1096 | 0.11 |
| 0.1097 | 0.11 |
| 0.1098 | 0.11 |
| 0.1099 | 0.11 |
| 0.11 | 0.11 |
| 0.1101 | 0.11 |
| 0.1102 | 0.11 |
| 0.1103 | 0.11 |
| 0.1104 | 0.111 |
| 0.1105 | 0.111 |
| 0.1106 | 0.111 |
| 0.1107 | 0.111 |
| 0.1108 | 0.111 |
| 0.1109 | 0.111 |
| 0.111 | 0.111 |
| 0.1111 | 0.111 |
| 0.1112 | 0.111 |
| 0.1113 | 0.111 |
| 0.1114 | 0.112 |
| 0.1115 | 0.112 |
| 0.1116 | 0.112 |
| 0.1117 | 0.112 |
| 0.1118 | 0.112 |
| 0.1119 | 0.112 |
| 0.112 | 0.112 |
| 0.1121 | 0.112 |
| 0.1122 | 0.112 |
| 0.1123 | 0.112 |
| 0.1124 | 0.113 |
| 0.1125 | 0.113 |
| 0.1126 | 0.113 |
| 0.1127 | 0.113 |
| 0.1128 | 0.113 |
| 0.1129 | 0.113 |
| 0.113 | 0.113 |
| 0.1131 | 0.113 |
| 0.1132 | 0.113 |
| 0.1133 | 0.113 |
| 0.1134 | 0.114 |
| 0.1135 | 0.114 |
| 0.1136 | 0.114 |
| 0.1137 | 0.114 |
| 0.1138 | 0.114 |
| 0.1139 | 0.114 |
| 0.114 | 0.114 |
| 0.1141 | 0.114 |
| 0.1142 | 0.114 |
| 0.1143 | 0.114 |
| 0.1144 | 0.115 |
| 0.1145 | 0.115 |
| 0.1146 | 0.115 |
| 0.1147 | 0.115 |
| 0.1148 | 0.115 |
| 0.1149 | 0.115 |
| 0.115 | 0.115 |
| 0.1151 | 0.115 |
| 0.1152 | 0.115 |
| 0.1153 | 0.115 |
| 0.1154 | 0.116 |
| 0.1155 | 0.116 |
| 0.1156 | 0.116 |
| 0.1157 | 0.116 |
| 0.1158 | 0.116 |
| 0.1159 | 0.116 |
| 0.116 | 0.116 |
| 0.1161 | 0.116 |
| 0.1162 | 0.116 |
| 0.1163 | 0.117 |
| 0.1164 | 0.117 |
| 0.1165 | 0.117 |
| 0.1166 | 0.117 |
| 0.1167 | 0.117 |
| 0.1168 | 0.117 |
| 0.1169 | 0.117 |
| 0.117 | 0.117 |
| 0.1171 | 0.117 |
| 0.1172 | 0.117 |
| 0.1173 | 0.117 |
| 0.1174 | 0.118 |
| 0.1175 | 0.118 |
| 0.1176 | 0.118 |
| 0.1177 | 0.118 |
| 0.1178 | 0.118 |
| 0.1179 | 0.118 |
| 0.118 | 0.118 |
| 0.1181 | 0.118 |
| 0.1182 | 0.118 |
| 0.1183 | 0.119 |
| 0.1184 | 0.119 |
| 0.1185 | 0.119 |
| 0.1186 | 0.119 |
| 0.1187 | 0.119 |
| 0.1188 | 0.119 |
| 0.1189 | 0.119 |
| 0.119 | 0.119 |
| 0.1191 | 0.119 |
| 0.1192 | 0.119 |
| 0.1193 | 0.119 |
| 0.1194 | 0.12 |
| 0.1195 | 0.12 |
| 0.1196 | 0.12 |
| 0.1197 | 0.12 |
| 0.1198 | 0.12 |
| 0.1199 | 0.12 |
| 0.12 | 0.12 |
| 0.1201 | 0.12 |
| 0.1202 | 0.12 |
| 0.1203 | 0.121 |
| 0.1204 | 0.121 |
| 0.1205 | 0.121 |
| 0.1206 | 0.121 |
| 0.1207 | 0.121 |
| 0.1208 | 0.121 |
| 0.1209 | 0.121 |
| 0.121 | 0.121 |
| 0.1211 | 0.121 |
| 0.1212 | 0.121 |
| 0.1213 | 0.122 |
| 0.1214 | 0.122 |
| 0.1215 | 0.122 |
| 0.1216 | 0.122 |
| 0.1217 | 0.122 |
| 0.1218 | 0.122 |
| 0.1219 | 0.122 |
| 0.122 | 0.122 |
| 0.1221 | 0.122 |
| 0.1222 | 0.122 |
| 0.1223 | 0.123 |
| 0.1224 | 0.123 |
| 0.1225 | 0.123 |
| 0.1226 | 0.123 |
| 0.1227 | 0.123 |
| 0.1228 | 0.123 |
| 0.1229 | 0.123 |
| 0.123 | 0.123 |
| 0.1231 | 0.123 |
| 0.1232 | 0.123 |
| 0.1233 | 0.124 |
| 0.1234 | 0.124 |
| 0.1235 | 0.124 |
| 0.1236 | 0.124 |
| 0.1237 | 0.124 |
| 0.1238 | 0.124 |
| 0.1239 | 0.124 |
| 0.124 | 0.124 |
| 0.1241 | 0.124 |
| 0.1242 | 0.124 |
| 0.1243 | 0.124 |
| 0.1244 | 0.125 |
| 0.1245 | 0.125 |
| 0.1246 | 0.125 |
| 0.1247 | 0.125 |
| 0.1248 | 0.125 |
| 0.1249 | 0.125 |
| 0.125 | 0.125 |
| 0.1251 | 0.125 |
| 0.1252 | 0.125 |
| 0.1253 | 0.125 |
| 0.1254 | 0.126 |
| 0.1255 | 0.126 |
| 0.1256 | 0.126 |
| 0.1257 | 0.126 |
| 0.1258 | 0.126 |
| 0.1259 | 0.126 |
| 0.126 | 0.126 |
| 0.1261 | 0.126 |
| 0.1262 | 0.126 |
| 0.1263 | 0.127 |
| 0.1264 | 0.127 |
| 0.1265 | 0.127 |
| 0.1266 | 0.127 |
| 0.1267 | 0.127 |
| 0.1268 | 0.127 |
| 0.1269 | 0.127 |
| 0.127 | 0.127 |
| 0.1271 | 0.127 |
| 0.1272 | 0.127 |
| 0.1273 | 0.128 |
| 0.1274 | 0.128 |
| 0.1275 | 0.128 |
| 0.1276 | 0.128 |
| 0.1277 | 0.128 |
| 0.1278 | 0.128 |
| 0.1279 | 0.128 |
| 0.128 | 0.128 |
| 0.1281 | 0.128 |
| 0.1282 | 0.128 |
| 0.1283 | 0.129 |
| 0.1284 | 0.129 |
| 0.1285 | 0.129 |
| 0.1286 | 0.129 |
| 0.1287 | 0.129 |
| 0.1288 | 0.129 |
| 0.1289 | 0.129 |
| 0.129 | 0.129 |
| 0.1291 | 0.129 |
| 0.1292 | 0.129 |
| 0.1293 | 0.13 |
| 0.1294 | 0.13 |
| 0.1295 | 0.13 |
| 0.1296 | 0.13 |
| 0.1297 | 0.13 |
| 0.1298 | 0.13 |
| 0.1299 | 0.13 |
| 0.13 | 0.13 |
| 0.1301 | 0.13 |
| 0.1302 | 0.13 |
| 0.1303 | 0.13 |
| 0.1304 | 0.131 |
| 0.1305 | 0.131 |
| 0.1306 | 0.131 |
| 0.1307 | 0.131 |
| 0.1308 | 0.131 |
| 0.1309 | 0.131 |
| 0.131 | 0.131 |
| 0.1311 | 0.131 |
| 0.1312 | 0.131 |
| 0.1313 | 0.132 |
| 0.1314 | 0.132 |
| 0.1315 | 0.132 |
| 0.1316 | 0.132 |
| 0.1317 | 0.132 |
| 0.1318 | 0.132 |
| 0.1319 | 0.132 |
| 0.132 | 0.132 |
| 0.1321 | 0.132 |
| 0.1322 | 0.132 |
| 0.1323 | 0.133 |
| 0.1324 | 0.133 |
| 0.1325 | 0.133 |
| 0.1326 | 0.133 |
| 0.1327 | 0.133 |
| 0.1328 | 0.133 |
| 0.1329 | 0.133 |
| 0.133 | 0.133 |
| 0.1331 | 0.133 |
| 0.1332 | 0.133 |
| 0.1333 | 0.134 |
| 0.1334 | 0.134 |
| 0.1335 | 0.134 |
| 0.1336 | 0.134 |
| 0.1337 | 0.134 |
| 0.1338 | 0.134 |
| 0.1339 | 0.134 |
| 0.134 | 0.134 |
| 0.1341 | 0.134 |
| 0.1342 | 0.134 |
| 0.1343 | 0.135 |
| 0.1344 | 0.135 |
| 0.1345 | 0.135 |
| 0.1346 | 0.135 |
| 0.1347 | 0.135 |
| 0.1348 | 0.135 |
| 0.1349 | 0.135 |
| 0.135 | 0.135 |
| 0.1351 | 0.135 |
| 0.1352 | 0.135 |
| 0.1353 | 0.136 |
| 0.1354 | 0.136 |
| 0.1355 | 0.136 |
| 0.1356 | 0.136 |
| 0.1357 | 0.136 |
| 0.1358 | 0.136 |
| 0.1359 | 0.136 |
| 0.136 | 0.136 |
| 0.1361 | 0.136 |
| 0.1362 | 0.136 |
| 0.1363 | 0.137 |
| 0.1364 | 0.137 |
| 0.1365 | 0.137 |
| 0.1366 | 0.137 |
| 0.1367 | 0.137 |
| 0.1368 | 0.137 |
| 0.1369 | 0.137 |
| 0.137 | 0.137 |
| 0.1371 | 0.137 |
| 0.1372 | 0.137 |
| 0.1373 | 0.138 |
| 0.1374 | 0.138 |
| 0.1375 | 0.138 |
| 0.1376 | 0.138 |
| 0.1377 | 0.138 |
| 0.1378 | 0.138 |
| 0.1379 | 0.138 |
| 0.138 | 0.138 |
| 0.1381 | 0.138 |
| 0.1382 | 0.138 |
| 0.1383 | 0.139 |
| 0.1384 | 0.139 |
| 0.1385 | 0.139 |
| 0.1386 | 0.139 |
| 0.1387 | 0.139 |
| 0.1388 | 0.139 |
| 0.1389 | 0.139 |
| 0.139 | 0.139 |
| 0.1391 | 0.139 |
| 0.1392 | 0.139 |
| 0.1393 | 0.14 |
| 0.1394 | 0.14 |
| 0.1395 | 0.14 |
| 0.1396 | 0.14 |
| 0.1397 | 0.14 |
| 0.1398 | 0.14 |
| 0.1399 | 0.14 |
| 0.14 | 0.14 |
| 0.1401 | 0.14 |
| 0.1402 | 0.14 |
| 0.1403 | 0.141 |
| 0.1404 | 0.141 |
| 0.1405 | 0.141 |
| 0.1406 | 0.141 |
| 0.1407 | 0.141 |
| 0.1408 | 0.141 |
| 0.1409 | 0.141 |
| 0.141 | 0.141 |
| 0.1411 | 0.141 |
| 0.1412 | 0.141 |
| 0.1413 | 0.142 |
| 0.1414 | 0.142 |
| 0.1415 | 0.142 |
| 0.1416 | 0.142 |
| 0.1417 | 0.142 |
| 0.1418 | 0.142 |
| 0.1419 | 0.142 |
| 0.142 | 0.142 |
| 0.1421 | 0.142 |
| 0.1422 | 0.142 |
| 0.1423 | 0.143 |
| 0.1424 | 0.143 |
| 0.1425 | 0.143 |
| 0.1426 | 0.143 |
| 0.1427 | 0.143 |
| 0.1428 | 0.143 |
| 0.1429 | 0.143 |
| 0.143 | 0.143 |
| 0.1431 | 0.143 |
| 0.1432 | 0.143 |
| 0.1433 | 0.144 |
| 0.1434 | 0.144 |
| 0.1435 | 0.144 |
| 0.1436 | 0.144 |
| 0.1437 | 0.144 |
| 0.1438 | 0.144 |
| 0.1439 | 0.144 |
| 0.144 | 0.144 |
| 0.1441 | 0.144 |
| 0.1442 | 0.144 |
| 0.1443 | 0.145 |
| 0.1444 | 0.145 |
| 0.1445 | 0.145 |
| 0.1446 | 0.145 |
| 0.1447 | 0.145 |
| 0.1448 | 0.145 |
| 0.1449 | 0.145 |
| 0.145 | 0.145 |
| 0.1451 | 0.145 |
| 0.1452 | 0.145 |
| 0.1453 | 0.146 |
| 0.1454 | 0.146 |
| 0.1455 | 0.146 |
| 0.1456 | 0.146 |
| 0.1457 | 0.146 |
| 0.1458 | 0.146 |
| 0.1459 | 0.146 |
| 0.146 | 0.146 |
| 0.1461 | 0.146 |
| 0.1462 | 0.146 |
| 0.1463 | 0.147 |
| 0.1464 | 0.147 |
| 0.1465 | 0.147 |
| 0.1466 | 0.147 |
| 0.1467 | 0.147 |
| 0.1468 | 0.147 |
| 0.1469 | 0.147 |
| 0.147 | 0.147 |
| 0.1471 | 0.147 |
| 0.1472 | 0.147 |
| 0.1473 | 0.148 |
| 0.1474 | 0.148 |
| 0.1475 | 0.148 |
| 0.1476 | 0.148 |
| 0.1477 | 0.148 |
| 0.1478 | 0.148 |
| 0.1479 | 0.148 |
| 0.148 | 0.148 |
| 0.1481 | 0.148 |
| 0.1482 | 0.148 |
| 0.1483 | 0.149 |
| 0.1484 | 0.149 |
| 0.1485 | 0.149 |
| 0.1486 | 0.149 |
| 0.1487 | 0.149 |
| 0.1488 | 0.149 |
| 0.1489 | 0.149 |
| 0.149 | 0.149 |
| 0.1491 | 0.149 |
| 0.1492 | 0.149 |
| 0.1493 | 0.15 |
| 0.1494 | 0.15 |
| 0.1495 | 0.15 |
| 0.1496 | 0.15 |
| 0.1497 | 0.15 |
| 0.1498 | 0.15 |
| 0.1499 | 0.15 |
| 0.15 | 0.15 |
| 0.1501 | 0.15 |
| 0.1502 | 0.15 |
| 0.1503 | 0.151 |
| 0.1504 | 0.151 |
| 0.1505 | 0.151 |
| 0.1506 | 0.151 |
| 0.1507 | 0.151 |
| 0.1508 | 0.151 |
| 0.1509 | 0.151 |
| 0.151 | 0.151 |
| 0.1511 | 0.151 |
| 0.1512 | 0.151 |
| 0.1513 | 0.152 |
| 0.1514 | 0.152 |
| 0.1515 | 0.152 |
| 0.1516 | 0.152 |
| 0.1517 | 0.152 |
| 0.1518 | 0.152 |
| 0.1519 | 0.152 |
| 0.152 | 0.152 |
| 0.1521 | 0.152 |
| 0.1522 | 0.152 |
| 0.1523 | 0.153 |
| 0.1524 | 0.153 |
| 0.1525 | 0.153 |
| 0.1526 | 0.153 |
| 0.1527 | 0.153 |
| 0.1528 | 0.153 |
| 0.1529 | 0.153 |
| 0.153 | 0.153 |
| 0.1531 | 0.153 |
| 0.1532 | 0.153 |
| 0.1533 | 0.154 |
| 0.1534 | 0.154 |
| 0.1535 | 0.154 |
| 0.1536 | 0.154 |
| 0.1537 | 0.154 |
| 0.1538 | 0.154 |
| 0.1539 | 0.154 |
| 0.154 | 0.154 |
| 0.1541 | 0.154 |
| 0.1542 | 0.154 |
| 0.1543 | 0.155 |
| 0.1544 | 0.155 |
| 0.1545 | 0.155 |
| 0.1546 | 0.155 |
| 0.1547 | 0.155 |
| 0.1548 | 0.155 |
| 0.1549 | 0.155 |
| 0.155 | 0.155 |
| 0.1551 | 0.155 |
| 0.1552 | 0.155 |
| 0.1553 | 0.156 |
| 0.1554 | 0.156 |
| 0.1555 | 0.156 |
| 0.1556 | 0.156 |
| 0.1557 | 0.156 |
| 0.1558 | 0.156 |
| 0.1559 | 0.156 |
| 0.156 | 0.156 |
| 0.1561 | 0.156 |
| 0.1562 | 0.156 |
| 0.1563 | 0.157 |
| 0.1564 | 0.157 |
| 0.1565 | 0.157 |
| 0.1566 | 0.157 |
| 0.1567 | 0.157 |
| 0.1568 | 0.157 |
| 0.1569 | 0.157 |
| 0.157 | 0.157 |
| 0.1571 | 0.157 |
| 0.1572 | 0.157 |
| 0.1573 | 0.158 |
| 0.1574 | 0.158 |
| 0.1575 | 0.158 |
| 0.1576 | 0.158 |
| 0.1577 | 0.158 |
| 0.1578 | 0.158 |
| 0.1579 | 0.158 |
| 0.158 | 0.158 |
| 0.1581 | 0.158 |
| 0.1582 | 0.158 |
| 0.1583 | 0.159 |
| 0.1584 | 0.159 |
| 0.1585 | 0.159 |
| 0.1586 | 0.159 |
| 0.1587 | 0.159 |
| 0.1588 | 0.159 |
| 0.1589 | 0.159 |
| 0.159 | 0.159 |
| 0.1591 | 0.159 |
| 0.1592 | 0.159 |
| 0.1593 | 0.16 |
| 0.1594 | 0.16 |
| 0.1595 | 0.16 |
| 0.1596 | 0.16 |
| 0.1597 | 0.16 |
| 0.1598 | 0.16 |
| 0.1599 | 0.16 |
| 0.16 | 0.16 |
| 0.1601 | 0.16 |
| 0.1602 | 0.16 |
| 0.1603 | 0.161 |
| 0.1604 | 0.161 |
| 0.1605 | 0.161 |
| 0.1606 | 0.161 |
| 0.1607 | 0.161 |
| 0.1608 | 0.161 |
| 0.1609 | 0.161 |
| 0.161 | 0.161 |
| 0.1611 | 0.161 |
| 0.1612 | 0.161 |
| 0.1613 | 0.162 |
| 0.1614 | 0.162 |
| 0.1615 | 0.162 |
| 0.1616 | 0.162 |
| 0.1617 | 0.162 |
| 0.1618 | 0.162 |
| 0.1619 | 0.162 |
| 0.162 | 0.162 |
| 0.1621 | 0.162 |
| 0.1622 | 0.162 |
| 0.1623 | 0.163 |
| 0.1624 | 0.163 |
| 0.1625 | 0.163 |
| 0.1626 | 0.163 |
| 0.1627 | 0.163 |
| 0.1628 | 0.163 |
| 0.1629 | 0.163 |
| 0.163 | 0.163 |
| 0.1631 | 0.163 |
| 0.1632 | 0.163 |
| 0.1633 | 0.164 |
| 0.1634 | 0.164 |
| 0.1635 | 0.164 |
| 0.1636 | 0.164 |
| 0.1637 | 0.164 |
| 0.1638 | 0.164 |
| 0.1639 | 0.164 |
| 0.164 | 0.164 |
| 0.1641 | 0.164 |
| 0.1642 | 0.164 |
| 0.1643 | 0.165 |
| 0.1644 | 0.165 |
| 0.1645 | 0.165 |
| 0.1646 | 0.165 |
| 0.1647 | 0.165 |
| 0.1648 | 0.165 |
| 0.1649 | 0.165 |
| 0.165 | 0.165 |
| 0.1651 | 0.165 |
| 0.1652 | 0.165 |
| 0.1653 | 0.166 |
| 0.1654 | 0.166 |
| 0.1655 | 0.166 |
| 0.1656 | 0.166 |
| 0.1657 | 0.166 |
| 0.1658 | 0.166 |
| 0.1659 | 0.166 |
| 0.166 | 0.166 |
| 0.1661 | 0.166 |
| 0.1662 | 0.166 |
| 0.1663 | 0.167 |
| 0.1664 | 0.167 |
| 0.1665 | 0.167 |
| 0.1666 | 0.167 |
| 0.1667 | 0.167 |
| 0.1668 | 0.167 |
| 0.1669 | 0.167 |
| 0.167 | 0.167 |
| 0.1671 | 0.167 |
| 0.1672 | 0.167 |
| 0.1673 | 0.168 |
| 0.1674 | 0.168 |
| 0.1675 | 0.168 |
| 0.1676 | 0.168 |
| 0.1677 | 0.168 |
| 0.1678 | 0.168 |
| 0.1679 | 0.168 |
| 0.168 | 0.168 |
| 0.1681 | 0.168 |
| 0.1682 | 0.168 |
| 0.1683 | 0.169 |
| 0.1684 | 0.169 |
| 0.1685 | 0.169 |
| 0.1686 | 0.169 |
| 0.1687 | 0.169 |
| 0.1688 | 0.169 |
| 0.1689 | 0.169 |
| 0.169 | 0.169 |
| 0.1691 | 0.169 |
| 0.1692 | 0.169 |
| 0.1693 | 0.17 |
| 0.1694 | 0.17 |
| 0.1695 | 0.17 |
| 0.1696 | 0.17 |
| 0.1697 | 0.17 |
| 0.1698 | 0.17 |
| 0.1699 | 0.17 |
| 0.17 | 0.17 |
| 0.1701 | 0.17 |
| 0.1702 | 0.17 |
| 0.1703 | 0.171 |
| 0.1704 | 0.171 |
| 0.1705 | 0.171 |
| 0.1706 | 0.171 |
| 0.1707 | 0.171 |
| 0.1708 | 0.171 |
| 0.1709 | 0.171 |
| 0.171 | 0.171 |
| 0.1711 | 0.171 |
| 0.1712 | 0.171 |
| 0.1713 | 0.172 |
| 0.1714 | 0.172 |
| 0.1715 | 0.172 |
| 0.1716 | 0.172 |
| 0.1717 | 0.172 |
| 0.1718 | 0.172 |
| 0.1719 | 0.172 |
| 0.172 | 0.172 |
| 0.1721 | 0.172 |
| 0.1722 | 0.172 |
| 0.1723 | 0.173 |
| 0.1724 | 0.173 |
| 0.1725 | 0.173 |
| 0.1726 | 0.173 |
| 0.1727 | 0.173 |
| 0.1728 | 0.173 |
| 0.1729 | 0.173 |
| 0.173 | 0.173 |
| 0.1731 | 0.173 |
| 0.1732 | 0.173 |
| 0.1733 | 0.174 |
| 0.1734 | 0.174 |
| 0.1735 | 0.174 |
| 0.1736 | 0.174 |
| 0.1737 | 0.174 |
| 0.1738 | 0.174 |
| 0.1739 | 0.174 |
| 0.174 | 0.174 |
| 0.1741 | 0.174 |
| 0.1742 | 0.175 |
| 0.1743 | 0.175 |
| 0.1744 | 0.175 |
| 0.1745 | 0.175 |
| 0.1746 | 0.175 |
| 0.1747 | 0.175 |
| 0.1748 | 0.175 |
| 0.1749 | 0.175 |
| 0.175 | 0.175 |
| 0.1751 | 0.175 |
| 0.1752 | 0.175 |
| 0.1753 | 0.176 |
| 0.1754 | 0.176 |
| 0.1755 | 0.176 |
| 0.1756 | 0.176 |
| 0.1757 | 0.176 |
| 0.1758 | 0.176 |
| 0.1759 | 0.176 |
| 0.176 | 0.176 |
| 0.1761 | 0.176 |
| 0.1762 | 0.176 |
| 0.1763 | 0.177 |
| 0.1764 | 0.177 |
| 0.1765 | 0.177 |
| 0.1766 | 0.177 |
| 0.1767 | 0.177 |
| 0.1768 | 0.177 |
| 0.1769 | 0.177 |
| 0.177 | 0.177 |
| 0.1771 | 0.177 |
| 0.1772 | 0.177 |
| 0.1773 | 0.178 |
| 0.1774 | 0.178 |
| 0.1775 | 0.178 |
| 0.1776 | 0.178 |
| 0.1777 | 0.178 |
| 0.1778 | 0.178 |
| 0.1779 | 0.178 |
| 0.178 | 0.178 |
| 0.1781 | 0.178 |
| 0.1782 | 0.178 |
| 0.1783 | 0.179 |
| 0.1784 | 0.179 |
| 0.1785 | 0.179 |
| 0.1786 | 0.179 |
| 0.1787 | 0.179 |
| 0.1788 | 0.179 |
| 0.1789 | 0.179 |
| 0.179 | 0.179 |
| 0.1791 | 0.179 |
| 0.1792 | 0.179 |
| 0.1793 | 0.18 |
| 0.1794 | 0.18 |
| 0.1795 | 0.18 |
| 0.1796 | 0.18 |
| 0.1797 | 0.18 |
| 0.1798 | 0.18 |
| 0.1799 | 0.18 |
| 0.18 | 0.18 |
| 0.1801 | 0.18 |
| 0.1802 | 0.18 |
| 0.1803 | 0.181 |
| 0.1804 | 0.181 |
| 0.1805 | 0.181 |
| 0.1806 | 0.181 |
| 0.1807 | 0.181 |
| 0.1808 | 0.181 |
| 0.1809 | 0.181 |
| 0.181 | 0.181 |
| 0.1811 | 0.181 |
| 0.1812 | 0.181 |
| 0.1813 | 0.182 |
| 0.1814 | 0.182 |
| 0.1815 | 0.182 |
| 0.1816 | 0.182 |
| 0.1817 | 0.182 |
| 0.1818 | 0.182 |
| 0.1819 | 0.182 |
| 0.182 | 0.182 |
| 0.1821 | 0.182 |
| 0.1822 | 0.182 |
| 0.1823 | 0.183 |
| 0.1824 | 0.183 |
| 0.1825 | 0.183 |
| 0.1826 | 0.183 |
| 0.1827 | 0.183 |
| 0.1828 | 0.183 |
| 0.1829 | 0.183 |
| 0.183 | 0.183 |
| 0.1831 | 0.183 |
| 0.1832 | 0.183 |
| 0.1833 | 0.184 |
| 0.1834 | 0.184 |
| 0.1835 | 0.184 |
| 0.1836 | 0.184 |
| 0.1837 | 0.184 |
| 0.1838 | 0.184 |
| 0.1839 | 0.184 |
| 0.184 | 0.184 |
| 0.1841 | 0.184 |
| 0.1842 | 0.184 |
| 0.1843 | 0.185 |
| 0.1844 | 0.185 |
| 0.1845 | 0.185 |
| 0.1846 | 0.185 |
| 0.1847 | 0.185 |
| 0.1848 | 0.185 |
| 0.1849 | 0.185 |
| 0.185 | 0.185 |
| 0.1851 | 0.185 |
| 0.1852 | 0.185 |
| 0.1853 | 0.186 |
| 0.1854 | 0.186 |
| 0.1855 | 0.186 |
| 0.1856 | 0.186 |
| 0.1857 | 0.186 |
| 0.1858 | 0.186 |
| 0.1859 | 0.186 |
| 0.186 | 0.186 |
| 0.1861 | 0.186 |
| 0.1862 | 0.186 |
| 0.1863 | 0.187 |
| 0.1864 | 0.187 |
| 0.1865 | 0.187 |
| 0.1866 | 0.187 |
| 0.1867 | 0.187 |
| 0.1868 | 0.187 |
| 0.1869 | 0.187 |
| 0.187 | 0.187 |
| 0.1871 | 0.187 |
| 0.1872 | 0.187 |
| 0.1873 | 0.188 |
| 0.1874 | 0.188 |
| 0.1875 | 0.188 |
| 0.1876 | 0.188 |
| 0.1877 | 0.188 |
| 0.1878 | 0.188 |
| 0.1879 | 0.188 |
| 0.188 | 0.188 |
| 0.1881 | 0.188 |
| 0.1882 | 0.188 |
| 0.1883 | 0.189 |
| 0.1884 | 0.189 |
| 0.1885 | 0.189 |
| 0.1886 | 0.189 |
| 0.1887 | 0.189 |
| 0.1888 | 0.189 |
| 0.1889 | 0.189 |
| 0.189 | 0.189 |
| 0.1891 | 0.189 |
| 0.1892 | 0.189 |
| 0.1893 | 0.19 |
| 0.1894 | 0.19 |
| 0.1895 | 0.19 |
| 0.1896 | 0.19 |
| 0.1897 | 0.19 |
| 0.1898 | 0.19 |
| 0.1899 | 0.19 |
| 0.19 | 0.19 |
| 0.1901 | 0.19 |
| 0.1902 | 0.19 |
| 0.1903 | 0.191 |
| 0.1904 | 0.191 |
| 0.1905 | 0.191 |
| 0.1906 | 0.191 |
| 0.1907 | 0.191 |
| 0.1908 | 0.191 |
| 0.1909 | 0.191 |
| 0.191 | 0.191 |
| 0.1911 | 0.191 |
| 0.1912 | 0.191 |
| 0.1913 | 0.192 |
| 0.1914 | 0.192 |
| 0.1915 | 0.192 |
| 0.1916 | 0.192 |
| 0.1917 | 0.192 |
| 0.1918 | 0.192 |
| 0.1919 | 0.192 |
| 0.192 | 0.192 |
| 0.1921 | 0.192 |
| 0.1922 | 0.192 |
| 0.1923 | 0.193 |
| 0.1924 | 0.193 |
| 0.1925 | 0.193 |
| 0.1926 | 0.193 |
| 0.1927 | 0.193 |
| 0.1928 | 0.193 |
| 0.1929 | 0.193 |
| 0.193 | 0.193 |
| 0.1931 | 0.193 |
| 0.1932 | 0.193 |
| 0.1933 | 0.194 |
| 0.1934 | 0.194 |
| 0.1935 | 0.194 |
| 0.1936 | 0.194 |
| 0.1937 | 0.194 |
| 0.1938 | 0.194 |
| 0.1939 | 0.194 |
| 0.194 | 0.194 |
| 0.1941 | 0.194 |
| 0.1942 | 0.194 |
| 0.1943 | 0.195 |
| 0.1944 | 0.195 |
| 0.1945 | 0.195 |
| 0.1946 | 0.195 |
| 0.1947 | 0.195 |
| 0.1948 | 0.195 |
| 0.1949 | 0.195 |
| 0.195 | 0.195 |
| 0.1951 | 0.195 |
| 0.1952 | 0.195 |
| 0.1953 | 0.196 |
| 0.1954 | 0.196 |
| 0.1955 | 0.196 |
| 0.1956 | 0.196 |
| 0.1957 | 0.196 |
| 0.1958 | 0.196 |
| 0.1959 | 0.196 |
| 0.196 | 0.196 |
| 0.1961 | 0.196 |
| 0.1962 | 0.196 |
| 0.1963 | 0.197 |
| 0.1964 | 0.197 |
| 0.1965 | 0.197 |
| 0.1966 | 0.197 |
| 0.1967 | 0.197 |
| 0.1968 | 0.197 |
| 0.1969 | 0.197 |
| 0.197 | 0.197 |
| 0.1971 | 0.197 |
| 0.1972 | 0.197 |
| 0.1973 | 0.198 |
| 0.1974 | 0.198 |
| 0.1975 | 0.198 |
| 0.1976 | 0.198 |
| 0.1977 | 0.198 |
| 0.1978 | 0.198 |
| 0.1979 | 0.198 |
| 0.198 | 0.198 |
| 0.1981 | 0.198 |
| 0.1982 | 0.198 |
| 0.1983 | 0.199 |
| 0.1984 | 0.199 |
| 0.1985 | 0.199 |
| 0.1986 | 0.199 |
| 0.1987 | 0.199 |
| 0.1988 | 0.199 |
| 0.1989 | 0.199 |
| 0.199 | 0.199 |
| 0.1991 | 0.199 |
| 0.1992 | 0.199 |
| 0.1993 | 0.2 |
| 0.1994 | 0.2 |
| 0.1995 | 0.2 |
| 0.1996 | 0.2 |
| 0.1997 | 0.2 |
| 0.1998 | 0.2 |
| 0.1999 | 0.2 |
| 0.2 | 0.2 |
| 0.2001 | 0.2 |
| 0.2002 | 0.201 |
| 0.2003 | 0.201 |
| 0.2004 | 0.201 |
| 0.2005 | 0.201 |
| 0.2006 | 0.201 |
| 0.2007 | 0.201 |
| 0.2008 | 0.201 |
| 0.2009 | 0.201 |
| 0.201 | 0.201 |
| 0.2011 | 0.201 |
| 0.2012 | 0.201 |
| 0.2013 | 0.202 |
| 0.2014 | 0.202 |
| 0.2015 | 0.202 |
| 0.2016 | 0.202 |
| 0.2017 | 0.202 |
| 0.2018 | 0.202 |
| 0.2019 | 0.202 |
| 0.202 | 0.202 |
| 0.2021 | 0.202 |
| 0.2022 | 0.202 |
| 0.2023 | 0.203 |
| 0.2024 | 0.203 |
| 0.2025 | 0.203 |
| 0.2026 | 0.203 |
| 0.2027 | 0.203 |
| 0.2028 | 0.203 |
| 0.2029 | 0.203 |
| 0.203 | 0.203 |
| 0.2031 | 0.203 |
| 0.2032 | 0.203 |
| 0.2033 | 0.204 |
| 0.2034 | 0.204 |
| 0.2035 | 0.204 |
| 0.2036 | 0.204 |
| 0.2037 | 0.204 |
| 0.2038 | 0.204 |
| 0.2039 | 0.204 |
| 0.204 | 0.204 |
| 0.2041 | 0.204 |
| 0.2042 | 0.205 |
| 0.2043 | 0.205 |
| 0.2044 | 0.205 |
| 0.2045 | 0.205 |
| 0.2046 | 0.205 |
| 0.2047 | 0.205 |
| 0.2048 | 0.205 |
| 0.2049 | 0.205 |
| 0.205 | 0.205 |
| 0.2051 | 0.205 |
| 0.2052 | 0.206 |
| 0.2053 | 0.206 |
| 0.2054 | 0.206 |
| 0.2055 | 0.206 |
| 0.2056 | 0.206 |
| 0.2057 | 0.206 |
| 0.2058 | 0.206 |
| 0.2059 | 0.206 |
| 0.206 | 0.206 |
| 0.2061 | 0.206 |
| 0.2062 | 0.206 |
| 0.2063 | 0.207 |
| 0.2064 | 0.207 |
| 0.2065 | 0.207 |
| 0.2066 | 0.207 |
| 0.2067 | 0.207 |
| 0.2068 | 0.207 |
| 0.2069 | 0.207 |
| 0.207 | 0.207 |
| 0.2071 | 0.207 |
| 0.2072 | 0.207 |
| 0.2073 | 0.208 |
| 0.2074 | 0.208 |
| 0.2075 | 0.208 |
| 0.2076 | 0.208 |
| 0.2077 | 0.208 |
| 0.2078 | 0.208 |
| 0.2079 | 0.208 |
| 0.208 | 0.208 |
| 0.2081 | 0.208 |
| 0.2082 | 0.208 |
| 0.2083 | 0.209 |
| 0.2084 | 0.209 |
| 0.2085 | 0.209 |
| 0.2086 | 0.209 |
| 0.2087 | 0.209 |
| 0.2088 | 0.209 |
| 0.2089 | 0.209 |
| 0.209 | 0.209 |
| 0.2091 | 0.209 |
| 0.2092 | 0.21 |
| 0.2093 | 0.21 |
| 0.2094 | 0.21 |
| 0.2095 | 0.21 |
| 0.2096 | 0.21 |
| 0.2097 | 0.21 |
| 0.2098 | 0.21 |
| 0.2099 | 0.21 |
| 0.21 | 0.21 |
| 0.2101 | 0.21 |
| 0.2102 | 0.21 |
| 0.2103 | 0.211 |
| 0.2104 | 0.211 |
| 0.2105 | 0.211 |
| 0.2106 | 0.211 |
| 0.2107 | 0.211 |
| 0.2108 | 0.211 |
| 0.2109 | 0.211 |
| 0.211 | 0.211 |
| 0.2111 | 0.211 |
| 0.2112 | 0.211 |
| 0.2113 | 0.212 |
| 0.2114 | 0.212 |
| 0.2115 | 0.212 |
| 0.2116 | 0.212 |
| 0.2117 | 0.212 |
| 0.2118 | 0.212 |
| 0.2119 | 0.212 |
| 0.212 | 0.212 |
| 0.2121 | 0.212 |
| 0.2122 | 0.212 |
| 0.2123 | 0.213 |
| 0.2124 | 0.213 |
| 0.2125 | 0.213 |
| 0.2126 | 0.213 |
| 0.2127 | 0.213 |
| 0.2128 | 0.213 |
| 0.2129 | 0.213 |
| 0.213 | 0.213 |
| 0.2131 | 0.213 |
| 0.2132 | 0.213 |
| 0.2133 | 0.214 |
| 0.2134 | 0.214 |
| 0.2135 | 0.214 |
| 0.2136 | 0.214 |
| 0.2137 | 0.214 |
| 0.2138 | 0.214 |
| 0.2139 | 0.214 |
| 0.214 | 0.214 |
| 0.2141 | 0.214 |
| 0.2142 | 0.214 |
| 0.2143 | 0.215 |
| 0.2144 | 0.215 |
| 0.2145 | 0.215 |
| 0.2146 | 0.215 |
| 0.2147 | 0.215 |
| 0.2148 | 0.215 |
| 0.2149 | 0.215 |
| 0.215 | 0.215 |
| 0.2151 | 0.215 |
| 0.2152 | 0.215 |
| 0.2153 | 0.216 |
| 0.2154 | 0.216 |
| 0.2155 | 0.216 |
| 0.2156 | 0.216 |
| 0.2157 | 0.216 |
| 0.2158 | 0.216 |
| 0.2159 | 0.216 |
| 0.216 | 0.216 |
| 0.2161 | 0.216 |
| 0.2162 | 0.216 |
| 0.2163 | 0.217 |
| 0.2164 | 0.217 |
| 0.2165 | 0.217 |
| 0.2166 | 0.217 |
| 0.2167 | 0.217 |
| 0.2168 | 0.217 |
| 0.2169 | 0.217 |
| 0.217 | 0.217 |
| 0.2171 | 0.217 |
| 0.2172 | 0.218 |
| 0.2173 | 0.218 |
| 0.2174 | 0.218 |
| 0.2175 | 0.218 |
| 0.2176 | 0.218 |
| 0.2177 | 0.218 |
| 0.2178 | 0.218 |
| 0.2179 | 0.218 |
| 0.218 | 0.218 |
| 0.2181 | 0.218 |
| 0.2182 | 0.218 |
| 0.2183 | 0.219 |
| 0.2184 | 0.219 |
| 0.2185 | 0.219 |
| 0.2186 | 0.219 |
| 0.2187 | 0.219 |
| 0.2188 | 0.219 |
| 0.2189 | 0.219 |
| 0.219 | 0.219 |
| 0.2191 | 0.219 |
| 0.2192 | 0.219 |
| 0.2193 | 0.22 |
| 0.2194 | 0.22 |
| 0.2195 | 0.22 |
| 0.2196 | 0.22 |
| 0.2197 | 0.22 |
| 0.2198 | 0.22 |
| 0.2199 | 0.22 |
| 0.22 | 0.22 |
| 0.2201 | 0.22 |
| 0.2202 | 0.221 |
| 0.2203 | 0.221 |
| 0.2204 | 0.221 |
| 0.2205 | 0.221 |
| 0.2206 | 0.221 |
| 0.2207 | 0.221 |
| 0.2208 | 0.221 |
| 0.2209 | 0.221 |
| 0.221 | 0.221 |
| 0.2211 | 0.221 |
| 0.2212 | 0.221 |
| 0.2213 | 0.222 |
| 0.2214 | 0.222 |
| 0.2215 | 0.222 |
| 0.2216 | 0.222 |
| 0.2217 | 0.222 |
| 0.2218 | 0.222 |
| 0.2219 | 0.222 |
| 0.222 | 0.222 |
| 0.2221 | 0.222 |
| 0.2222 | 0.222 |
| 0.2223 | 0.223 |
| 0.2224 | 0.223 |
| 0.2225 | 0.223 |
| 0.2226 | 0.223 |
| 0.2227 | 0.223 |
| 0.2228 | 0.223 |
| 0.2229 | 0.223 |
| 0.223 | 0.223 |
| 0.2231 | 0.223 |
| 0.2232 | 0.223 |
| 0.2233 | 0.224 |
| 0.2234 | 0.224 |
| 0.2235 | 0.224 |
| 0.2236 | 0.224 |
| 0.2237 | 0.224 |
| 0.2238 | 0.224 |
| 0.2239 | 0.224 |
| 0.224 | 0.224 |
| 0.2241 | 0.224 |
| 0.2242 | 0.224 |
| 0.2243 | 0.225 |
| 0.2244 | 0.225 |
| 0.2245 | 0.225 |
| 0.2246 | 0.225 |
| 0.2247 | 0.225 |
| 0.2248 | 0.225 |
| 0.2249 | 0.225 |
| 0.225 | 0.225 |
| 0.2251 | 0.225 |
| 0.2252 | 0.225 |
| 0.2253 | 0.226 |
| 0.2254 | 0.226 |
| 0.2255 | 0.226 |
| 0.2256 | 0.226 |
| 0.2257 | 0.226 |
| 0.2258 | 0.226 |
| 0.2259 | 0.226 |
| 0.226 | 0.226 |
| 0.2261 | 0.226 |
| 0.2262 | 0.226 |
| 0.2263 | 0.227 |
| 0.2264 | 0.227 |
| 0.2265 | 0.227 |
| 0.2266 | 0.227 |
| 0.2267 | 0.227 |
| 0.2268 | 0.227 |
| 0.2269 | 0.227 |
| 0.227 | 0.227 |
| 0.2271 | 0.227 |
| 0.2272 | 0.228 |
| 0.2273 | 0.228 |
| 0.2274 | 0.228 |
| 0.2275 | 0.228 |
| 0.2276 | 0.228 |
| 0.2277 | 0.228 |
| 0.2278 | 0.228 |
| 0.2279 | 0.228 |
| 0.228 | 0.228 |
| 0.2281 | 0.228 |
| 0.2282 | 0.228 |
| 0.2283 | 0.229 |
| 0.2284 | 0.229 |
| 0.2285 | 0.229 |
| 0.2286 | 0.229 |
| 0.2287 | 0.229 |
| 0.2288 | 0.229 |
| 0.2289 | 0.229 |
| 0.229 | 0.229 |
| 0.2291 | 0.229 |
| 0.2292 | 0.229 |
| 0.2293 | 0.23 |
| 0.2294 | 0.23 |
| 0.2295 | 0.23 |
| 0.2296 | 0.23 |
| 0.2297 | 0.23 |
| 0.2298 | 0.23 |
| 0.2299 | 0.23 |
| 0.23 | 0.23 |
| 0.2301 | 0.23 |
| 0.2302 | 0.23 |
| 0.2303 | 0.231 |
| 0.2304 | 0.231 |
| 0.2305 | 0.231 |
| 0.2306 | 0.231 |
| 0.2307 | 0.231 |
| 0.2308 | 0.231 |
| 0.2309 | 0.231 |
| 0.231 | 0.231 |
| 0.2311 | 0.231 |
| 0.2312 | 0.232 |
| 0.2313 | 0.232 |
| 0.2314 | 0.232 |
| 0.2315 | 0.232 |
| 0.2316 | 0.232 |
| 0.2317 | 0.232 |
| 0.2318 | 0.232 |
| 0.2319 | 0.232 |
| 0.232 | 0.232 |
| 0.2321 | 0.232 |
| 0.2322 | 0.233 |
| 0.2323 | 0.233 |
| 0.2324 | 0.233 |
| 0.2325 | 0.233 |
| 0.2326 | 0.233 |
| 0.2327 | 0.233 |
| 0.2328 | 0.233 |
| 0.2329 | 0.233 |
| 0.233 | 0.233 |
| 0.2331 | 0.233 |
| 0.2332 | 0.234 |
| 0.2333 | 0.234 |
| 0.2334 | 0.234 |
| 0.2335 | 0.234 |
| 0.2336 | 0.234 |
| 0.2337 | 0.234 |
| 0.2338 | 0.234 |
| 0.2339 | 0.234 |
| 0.234 | 0.234 |
| 0.2341 | 0.234 |
| 0.2342 | 0.235 |
| 0.2343 | 0.235 |
| 0.2344 | 0.235 |
| 0.2345 | 0.235 |
| 0.2346 | 0.235 |
| 0.2347 | 0.235 |
| 0.2348 | 0.235 |
| 0.2349 | 0.235 |
| 0.235 | 0.235 |
| 0.2351 | 0.235 |
| 0.2352 | 0.235 |
| 0.2353 | 0.236 |
| 0.2354 | 0.236 |
| 0.2355 | 0.236 |
| 0.2356 | 0.236 |
| 0.2357 | 0.236 |
| 0.2358 | 0.236 |
| 0.2359 | 0.236 |
| 0.236 | 0.236 |
| 0.2361 | 0.236 |
| 0.2362 | 0.237 |
| 0.2363 | 0.237 |
| 0.2364 | 0.237 |
| 0.2365 | 0.237 |
| 0.2366 | 0.237 |
| 0.2367 | 0.237 |
| 0.2368 | 0.237 |
| 0.2369 | 0.237 |
| 0.237 | 0.237 |
| 0.2371 | 0.237 |
| 0.2372 | 0.237 |
| 0.2373 | 0.238 |
| 0.2374 | 0.238 |
| 0.2375 | 0.238 |
| 0.2376 | 0.238 |
| 0.2377 | 0.238 |
| 0.2378 | 0.238 |
| 0.2379 | 0.238 |
| 0.238 | 0.238 |
| 0.2381 | 0.238 |
| 0.2382 | 0.238 |
| 0.2383 | 0.239 |
| 0.2384 | 0.239 |
| 0.2385 | 0.239 |
| 0.2386 | 0.239 |
| 0.2387 | 0.239 |
| 0.2388 | 0.239 |
| 0.2389 | 0.239 |
| 0.239 | 0.239 |
| 0.2391 | 0.239 |
| 0.2392 | 0.24 |
| 0.2393 | 0.24 |
| 0.2394 | 0.24 |
| 0.2395 | 0.24 |
| 0.2396 | 0.24 |
| 0.2397 | 0.24 |
| 0.2398 | 0.24 |
| 0.2399 | 0.24 |
| 0.24 | 0.24 |
| 0.2401 | 0.24 |
| 0.2402 | 0.241 |
| 0.2403 | 0.241 |
| 0.2404 | 0.241 |
| 0.2405 | 0.241 |
| 0.2406 | 0.241 |
| 0.2407 | 0.241 |
| 0.2408 | 0.241 |
| 0.2409 | 0.241 |
| 0.241 | 0.241 |
| 0.2411 | 0.241 |
| 0.2412 | 0.241 |
| 0.2413 | 0.242 |
| 0.2414 | 0.242 |
| 0.2415 | 0.242 |
| 0.2416 | 0.242 |
| 0.2417 | 0.242 |
| 0.2418 | 0.242 |
| 0.2419 | 0.242 |
| 0.242 | 0.242 |
| 0.2421 | 0.242 |
| 0.2422 | 0.243 |
| 0.2423 | 0.243 |
| 0.2424 | 0.243 |
| 0.2425 | 0.243 |
| 0.2426 | 0.243 |
| 0.2427 | 0.243 |
| 0.2428 | 0.243 |
| 0.2429 | 0.243 |
| 0.243 | 0.243 |
| 0.2431 | 0.243 |
| 0.2432 | 0.244 |
| 0.2433 | 0.244 |
| 0.2434 | 0.244 |
| 0.2435 | 0.244 |
| 0.2436 | 0.244 |
| 0.2437 | 0.244 |
| 0.2438 | 0.244 |
| 0.2439 | 0.244 |
| 0.244 | 0.244 |
| 0.2441 | 0.244 |
| 0.2442 | 0.244 |
| 0.2443 | 0.245 |
| 0.2444 | 0.245 |
| 0.2445 | 0.245 |
| 0.2446 | 0.245 |
| 0.2447 | 0.245 |
| 0.2448 | 0.245 |
| 0.2449 | 0.245 |
| 0.245 | 0.245 |
| 0.2451 | 0.245 |
| 0.2452 | 0.246 |
| 0.2453 | 0.246 |
| 0.2454 | 0.246 |
| 0.2455 | 0.246 |
| 0.2456 | 0.246 |
| 0.2457 | 0.246 |
| 0.2458 | 0.246 |
| 0.2459 | 0.246 |
| 0.246 | 0.246 |
| 0.2461 | 0.246 |
| 0.2462 | 0.247 |
| 0.2463 | 0.247 |
| 0.2464 | 0.247 |
| 0.2465 | 0.247 |
| 0.2466 | 0.247 |
| 0.2467 | 0.247 |
| 0.2468 | 0.247 |
| 0.2469 | 0.247 |
| 0.247 | 0.247 |
| 0.2471 | 0.247 |
| 0.2472 | 0.248 |
| 0.2473 | 0.248 |
| 0.2474 | 0.248 |
| 0.2475 | 0.248 |
| 0.2476 | 0.248 |
| 0.2477 | 0.248 |
| 0.2478 | 0.248 |
| 0.2479 | 0.248 |
| 0.248 | 0.248 |
| 0.2481 | 0.248 |
| 0.2482 | 0.248 |
| 0.2483 | 0.249 |
| 0.2484 | 0.249 |
| 0.2485 | 0.249 |
| 0.2486 | 0.249 |
| 0.2487 | 0.249 |
| 0.2488 | 0.249 |
| 0.2489 | 0.249 |
| 0.249 | 0.249 |
| 0.2491 | 0.249 |
| 0.2492 | 0.25 |
| 0.2493 | 0.25 |
| 0.2494 | 0.25 |
| 0.2495 | 0.25 |
| 0.2496 | 0.25 |
| 0.2497 | 0.25 |
| 0.2498 | 0.25 |
| 0.2499 | 0.25 |
| 0.25 | 0.25 |
| 0.2501 | 0.25 |
| 0.2502 | 0.25 |
| 0.2503 | 0.251 |
| 0.2504 | 0.251 |
| 0.2505 | 0.251 |
| 0.2506 | 0.251 |
| 0.2507 | 0.251 |
| 0.2508 | 0.251 |
| 0.2509 | 0.251 |
| 0.251 | 0.251 |
| 0.2511 | 0.251 |
| 0.2512 | 0.252 |
| 0.2513 | 0.252 |
| 0.2514 | 0.252 |
| 0.2515 | 0.252 |
| 0.2516 | 0.252 |
| 0.2517 | 0.252 |
| 0.2518 | 0.252 |
| 0.2519 | 0.252 |
| 0.252 | 0.252 |
| 0.2521 | 0.252 |
| 0.2522 | 0.253 |
| 0.2523 | 0.253 |
| 0.2524 | 0.253 |
| 0.2525 | 0.253 |
| 0.2526 | 0.253 |
| 0.2527 | 0.253 |
| 0.2528 | 0.253 |
| 0.2529 | 0.253 |
| 0.253 | 0.253 |
| 0.2531 | 0.253 |
| 0.2532 | 0.254 |
| 0.2533 | 0.254 |
| 0.2534 | 0.254 |
| 0.2535 | 0.254 |
| 0.2536 | 0.254 |
| 0.2537 | 0.254 |
| 0.2538 | 0.254 |
| 0.2539 | 0.254 |
| 0.254 | 0.254 |
| 0.2541 | 0.254 |
| 0.2542 | 0.255 |
| 0.2543 | 0.255 |
| 0.2544 | 0.255 |
| 0.2545 | 0.255 |
| 0.2546 | 0.255 |
| 0.2547 | 0.255 |
| 0.2548 | 0.255 |
| 0.2549 | 0.255 |
| 0.255 | 0.255 |
| 0.2551 | 0.255 |
| 0.2552 | 0.256 |
| 0.2553 | 0.256 |
| 0.2554 | 0.256 |
| 0.2555 | 0.256 |
| 0.2556 | 0.256 |
| 0.2557 | 0.256 |
| 0.2558 | 0.256 |
| 0.2559 | 0.256 |
| 0.256 | 0.256 |
| 0.2561 | 0.256 |
| 0.2562 | 0.257 |
| 0.2563 | 0.257 |
| 0.2564 | 0.257 |
| 0.2565 | 0.257 |
| 0.2566 | 0.257 |
| 0.2567 | 0.257 |
| 0.2568 | 0.257 |
| 0.2569 | 0.257 |
| 0.257 | 0.257 |
| 0.2571 | 0.257 |
| 0.2572 | 0.258 |
| 0.2573 | 0.258 |
| 0.2574 | 0.258 |
| 0.2575 | 0.258 |
| 0.2576 | 0.258 |
| 0.2577 | 0.258 |
| 0.2578 | 0.258 |
| 0.2579 | 0.258 |
| 0.258 | 0.258 |
| 0.2581 | 0.258 |
| 0.2582 | 0.259 |
| 0.2583 | 0.259 |
| 0.2584 | 0.259 |
| 0.2585 | 0.259 |
| 0.2586 | 0.259 |
| 0.2587 | 0.259 |
| 0.2588 | 0.259 |
| 0.2589 | 0.259 |
| 0.259 | 0.259 |
| 0.2591 | 0.259 |
| 0.2592 | 0.26 |
| 0.2593 | 0.26 |
| 0.2594 | 0.26 |
| 0.2595 | 0.26 |
| 0.2596 | 0.26 |
| 0.2597 | 0.26 |
| 0.2598 | 0.26 |
| 0.2599 | 0.26 |
| 0.26 | 0.26 |
| 0.2601 | 0.26 |
| 0.2602 | 0.261 |
| 0.2603 | 0.261 |
| 0.2604 | 0.261 |
| 0.2605 | 0.261 |
| 0.2606 | 0.261 |
| 0.2607 | 0.261 |
| 0.2608 | 0.261 |
| 0.2609 | 0.261 |
| 0.261 | 0.261 |
| 0.2611 | 0.261 |
| 0.2612 | 0.262 |
| 0.2613 | 0.262 |
| 0.2614 | 0.262 |
| 0.2615 | 0.262 |
| 0.2616 | 0.262 |
| 0.2617 | 0.262 |
| 0.2618 | 0.262 |
| 0.2619 | 0.262 |
| 0.262 | 0.262 |
| 0.2621 | 0.262 |
| 0.2622 | 0.263 |
| 0.2623 | 0.263 |
| 0.2624 | 0.263 |
| 0.2625 | 0.263 |
| 0.2626 | 0.263 |
| 0.2627 | 0.263 |
| 0.2628 | 0.263 |
| 0.2629 | 0.263 |
| 0.263 | 0.263 |
| 0.2631 | 0.263 |
| 0.2632 | 0.263 |
| 0.2633 | 0.264 |
| 0.2634 | 0.264 |
| 0.2635 | 0.264 |
| 0.2636 | 0.264 |
| 0.2637 | 0.264 |
| 0.2638 | 0.264 |
| 0.2639 | 0.264 |
| 0.264 | 0.264 |
| 0.2641 | 0.264 |
| 0.2642 | 0.265 |
| 0.2643 | 0.265 |
| 0.2644 | 0.265 |
| 0.2645 | 0.265 |
| 0.2646 | 0.265 |
| 0.2647 | 0.265 |
| 0.2648 | 0.265 |
| 0.2649 | 0.265 |
| 0.265 | 0.265 |
| 0.2651 | 0.265 |
| 0.2652 | 0.266 |
| 0.2653 | 0.266 |
| 0.2654 | 0.266 |
| 0.2655 | 0.266 |
| 0.2656 | 0.266 |
| 0.2657 | 0.266 |
| 0.2658 | 0.266 |
| 0.2659 | 0.266 |
| 0.266 | 0.266 |
| 0.2661 | 0.266 |
| 0.2662 | 0.266 |
| 0.2663 | 0.267 |
| 0.2664 | 0.267 |
| 0.2665 | 0.267 |
| 0.2666 | 0.267 |
| 0.2667 | 0.267 |
| 0.2668 | 0.267 |
| 0.2669 | 0.267 |
| 0.267 | 0.267 |
| 0.2671 | 0.267 |
| 0.2672 | 0.268 |
| 0.2673 | 0.268 |
| 0.2674 | 0.268 |
| 0.2675 | 0.268 |
| 0.2676 | 0.268 |
| 0.2677 | 0.268 |
| 0.2678 | 0.268 |
| 0.2679 | 0.268 |
| 0.268 | 0.268 |
| 0.2681 | 0.268 |
| 0.2682 | 0.269 |
| 0.2683 | 0.269 |
| 0.2684 | 0.269 |
| 0.2685 | 0.269 |
| 0.2686 | 0.269 |
| 0.2687 | 0.269 |
| 0.2688 | 0.269 |
| 0.2689 | 0.269 |
| 0.269 | 0.269 |
| 0.2691 | 0.269 |
| 0.2692 | 0.27 |
| 0.2693 | 0.27 |
| 0.2694 | 0.27 |
| 0.2695 | 0.27 |
| 0.2696 | 0.27 |
| 0.2697 | 0.27 |
| 0.2698 | 0.27 |
| 0.2699 | 0.27 |
| 0.27 | 0.27 |
| 0.2701 | 0.27 |
| 0.2702 | 0.271 |
| 0.2703 | 0.271 |
| 0.2704 | 0.271 |
| 0.2705 | 0.271 |
| 0.2706 | 0.271 |
| 0.2707 | 0.271 |
| 0.2708 | 0.271 |
| 0.2709 | 0.271 |
| 0.271 | 0.271 |
| 0.2711 | 0.271 |
| 0.2712 | 0.271 |
| 0.2713 | 0.272 |
| 0.2714 | 0.272 |
| 0.2715 | 0.272 |
| 0.2716 | 0.272 |
| 0.2717 | 0.272 |
| 0.2718 | 0.272 |
| 0.2719 | 0.272 |
| 0.272 | 0.272 |
| 0.2721 | 0.272 |
| 0.2722 | 0.273 |
| 0.2723 | 0.273 |
| 0.2724 | 0.273 |
| 0.2725 | 0.273 |
| 0.2726 | 0.273 |
| 0.2727 | 0.273 |
| 0.2728 | 0.273 |
| 0.2729 | 0.273 |
| 0.273 | 0.273 |
| 0.2731 | 0.273 |
| 0.2732 | 0.274 |
| 0.2733 | 0.274 |
| 0.2734 | 0.274 |
| 0.2735 | 0.274 |
| 0.2736 | 0.274 |
| 0.2737 | 0.274 |
| 0.2738 | 0.274 |
| 0.2739 | 0.274 |
| 0.274 | 0.274 |
| 0.2741 | 0.274 |
| 0.2742 | 0.275 |
| 0.2743 | 0.275 |
| 0.2744 | 0.275 |
| 0.2745 | 0.275 |
| 0.2746 | 0.275 |
| 0.2747 | 0.275 |
| 0.2748 | 0.275 |
| 0.2749 | 0.275 |
| 0.275 | 0.275 |
| 0.2751 | 0.275 |
| 0.2752 | 0.276 |
| 0.2753 | 0.276 |
| 0.2754 | 0.276 |
| 0.2755 | 0.276 |
| 0.2756 | 0.276 |
| 0.2757 | 0.276 |
| 0.2758 | 0.276 |
| 0.2759 | 0.276 |
| 0.276 | 0.276 |
| 0.2761 | 0.276 |
| 0.2762 | 0.277 |
| 0.2763 | 0.277 |
| 0.2764 | 0.277 |
| 0.2765 | 0.277 |
| 0.2766 | 0.277 |
| 0.2767 | 0.277 |
| 0.2768 | 0.277 |
| 0.2769 | 0.277 |
| 0.277 | 0.277 |
| 0.2771 | 0.277 |
| 0.2772 | 0.278 |
| 0.2773 | 0.278 |
| 0.2774 | 0.278 |
| 0.2775 | 0.278 |
| 0.2776 | 0.278 |
| 0.2777 | 0.278 |
| 0.2778 | 0.278 |
| 0.2779 | 0.278 |
| 0.278 | 0.278 |
| 0.2781 | 0.278 |
| 0.2782 | 0.278 |
| 0.2783 | 0.279 |
| 0.2784 | 0.279 |
| 0.2785 | 0.279 |
| 0.2786 | 0.279 |
| 0.2787 | 0.279 |
| 0.2788 | 0.279 |
| 0.2789 | 0.279 |
| 0.279 | 0.279 |
| 0.2791 | 0.279 |
| 0.2792 | 0.28 |
| 0.2793 | 0.28 |
| 0.2794 | 0.28 |
| 0.2795 | 0.28 |
| 0.2796 | 0.28 |
| 0.2797 | 0.28 |
| 0.2798 | 0.28 |
| 0.2799 | 0.28 |
| 0.28 | 0.28 |
| 0.2801 | 0.28 |
| 0.2802 | 0.281 |
| 0.2803 | 0.281 |
| 0.2804 | 0.281 |
| 0.2805 | 0.281 |
| 0.2806 | 0.281 |
| 0.2807 | 0.281 |
| 0.2808 | 0.281 |
| 0.2809 | 0.281 |
| 0.281 | 0.281 |
| 0.2811 | 0.281 |
| 0.2812 | 0.282 |
| 0.2813 | 0.282 |
| 0.2814 | 0.282 |
| 0.2815 | 0.282 |
| 0.2816 | 0.282 |
| 0.2817 | 0.282 |
| 0.2818 | 0.282 |
| 0.2819 | 0.282 |
| 0.282 | 0.282 |
| 0.2821 | 0.282 |
| 0.2822 | 0.283 |
| 0.2823 | 0.283 |
| 0.2824 | 0.283 |
| 0.2825 | 0.283 |
| 0.2826 | 0.283 |
| 0.2827 | 0.283 |
| 0.2828 | 0.283 |
| 0.2829 | 0.283 |
| 0.283 | 0.283 |
| 0.2831 | 0.283 |
| 0.2832 | 0.284 |
| 0.2833 | 0.284 |
| 0.2834 | 0.284 |
| 0.2835 | 0.284 |
| 0.2836 | 0.284 |
| 0.2837 | 0.284 |
| 0.2838 | 0.284 |
| 0.2839 | 0.284 |
| 0.284 | 0.284 |
| 0.2841 | 0.284 |
| 0.2842 | 0.285 |
| 0.2843 | 0.285 |
| 0.2844 | 0.285 |
| 0.2845 | 0.285 |
| 0.2846 | 0.285 |
| 0.2847 | 0.285 |
| 0.2848 | 0.285 |
| 0.2849 | 0.285 |
| 0.285 | 0.285 |
| 0.2851 | 0.285 |
| 0.2852 | 0.286 |
| 0.2853 | 0.286 |
| 0.2854 | 0.286 |
| 0.2855 | 0.286 |
| 0.2856 | 0.286 |
| 0.2857 | 0.286 |
| 0.2858 | 0.286 |
| 0.2859 | 0.286 |
| 0.286 | 0.286 |
| 0.2861 | 0.286 |
| 0.2862 | 0.287 |
| 0.2863 | 0.287 |
| 0.2864 | 0.287 |
| 0.2865 | 0.287 |
| 0.2866 | 0.287 |
| 0.2867 | 0.287 |
| 0.2868 | 0.287 |
| 0.2869 | 0.287 |
| 0.287 | 0.287 |
| 0.2871 | 0.287 |
| 0.2872 | 0.288 |
| 0.2873 | 0.288 |
| 0.2874 | 0.288 |
| 0.2875 | 0.288 |
| 0.2876 | 0.288 |
| 0.2877 | 0.288 |
| 0.2878 | 0.288 |
| 0.2879 | 0.288 |
| 0.288 | 0.288 |
| 0.2881 | 0.288 |
| 0.2882 | 0.289 |
| 0.2883 | 0.289 |
| 0.2884 | 0.289 |
| 0.2885 | 0.289 |
| 0.2886 | 0.289 |
| 0.2887 | 0.289 |
| 0.2888 | 0.289 |
| 0.2889 | 0.289 |
| 0.289 | 0.289 |
| 0.2891 | 0.29 |
| 0.2892 | 0.29 |
| 0.2893 | 0.29 |
| 0.2894 | 0.29 |
| 0.2895 | 0.29 |
| 0.2896 | 0.29 |
| 0.2897 | 0.29 |
| 0.2898 | 0.29 |
| 0.2899 | 0.29 |
| 0.29 | 0.29 |
| 0.2901 | 0.29 |
| 0.2902 | 0.291 |
| 0.2903 | 0.291 |
| 0.2904 | 0.291 |
| 0.2905 | 0.291 |
| 0.2906 | 0.291 |
| 0.2907 | 0.291 |
| 0.2908 | 0.291 |
| 0.2909 | 0.291 |
| 0.291 | 0.291 |
| 0.2911 | 0.291 |
| 0.2912 | 0.292 |
| 0.2913 | 0.292 |
| 0.2914 | 0.292 |
| 0.2915 | 0.292 |
| 0.2916 | 0.292 |
| 0.2917 | 0.292 |
| 0.2918 | 0.292 |
| 0.2919 | 0.292 |
| 0.292 | 0.292 |
| 0.2921 | 0.292 |
| 0.2922 | 0.293 |
| 0.2923 | 0.293 |
| 0.2924 | 0.293 |
| 0.2925 | 0.293 |
| 0.2926 | 0.293 |
| 0.2927 | 0.293 |
| 0.2928 | 0.293 |
| 0.2929 | 0.293 |
| 0.293 | 0.293 |
| 0.2931 | 0.293 |
| 0.2932 | 0.293 |
| 0.2933 | 0.294 |
| 0.2934 | 0.294 |
| 0.2935 | 0.294 |
| 0.2936 | 0.294 |
| 0.2937 | 0.294 |
| 0.2938 | 0.294 |
| 0.2939 | 0.294 |
| 0.294 | 0.294 |
| 0.2941 | 0.294 |
| 0.2942 | 0.295 |
| 0.2943 | 0.295 |
| 0.2944 | 0.295 |
| 0.2945 | 0.295 |
| 0.2946 | 0.295 |
| 0.2947 | 0.295 |
| 0.2948 | 0.295 |
| 0.2949 | 0.295 |
| 0.295 | 0.295 |
| 0.2951 | 0.295 |
| 0.2952 | 0.296 |
| 0.2953 | 0.296 |
| 0.2954 | 0.296 |
| 0.2955 | 0.296 |
| 0.2956 | 0.296 |
| 0.2957 | 0.296 |
| 0.2958 | 0.296 |
| 0.2959 | 0.296 |
| 0.296 | 0.296 |
| 0.2961 | 0.296 |
| 0.2962 | 0.297 |
| 0.2963 | 0.297 |
| 0.2964 | 0.297 |
| 0.2965 | 0.297 |
| 0.2966 | 0.297 |
| 0.2967 | 0.297 |
| 0.2968 | 0.297 |
| 0.2969 | 0.297 |
| 0.297 | 0.297 |
| 0.2971 | 0.297 |
| 0.2972 | 0.298 |
| 0.2973 | 0.298 |
| 0.2974 | 0.298 |
| 0.2975 | 0.298 |
| 0.2976 | 0.298 |
| 0.2977 | 0.298 |
| 0.2978 | 0.298 |
| 0.2979 | 0.298 |
| 0.298 | 0.298 |
| 0.2981 | 0.298 |
| 0.2982 | 0.299 |
| 0.2983 | 0.299 |
| 0.2984 | 0.299 |
| 0.2985 | 0.299 |
| 0.2986 | 0.299 |
| 0.2987 | 0.299 |
| 0.2988 | 0.299 |
| 0.2989 | 0.299 |
| 0.299 | 0.299 |
| 0.2991 | 0.299 |
| 0.2992 | 0.3 |
| 0.2993 | 0.3 |
| 0.2994 | 0.3 |
| 0.2995 | 0.3 |
| 0.2996 | 0.3 |
| 0.2997 | 0.3 |
| 0.2998 | 0.3 |
| 0.2999 | 0.3 |
| 0.3 | 0.3 |
| 0.3001 | 0.3 |
| 0.3002 | 0.301 |
| 0.3003 | 0.301 |
| 0.3004 | 0.301 |
| 0.3005 | 0.301 |
| 0.3006 | 0.301 |
| 0.3007 | 0.301 |
| 0.3008 | 0.301 |
| 0.3009 | 0.301 |
| 0.301 | 0.301 |
| 0.3011 | 0.301 |
| 0.3012 | 0.302 |
| 0.3013 | 0.302 |
| 0.3014 | 0.302 |
| 0.3015 | 0.302 |
| 0.3016 | 0.302 |
| 0.3017 | 0.302 |
| 0.3018 | 0.302 |
| 0.3019 | 0.302 |
| 0.302 | 0.302 |
| 0.3021 | 0.302 |
| 0.3022 | 0.303 |
| 0.3023 | 0.303 |
| 0.3024 | 0.303 |
| 0.3025 | 0.303 |
| 0.3026 | 0.303 |
| 0.3027 | 0.303 |
| 0.3028 | 0.303 |
| 0.3029 | 0.303 |
| 0.303 | 0.303 |
| 0.3031 | 0.303 |
| 0.3032 | 0.304 |
| 0.3033 | 0.304 |
| 0.3034 | 0.304 |
| 0.3035 | 0.304 |
| 0.3036 | 0.304 |
| 0.3037 | 0.304 |
| 0.3038 | 0.304 |
| 0.3039 | 0.304 |
| 0.304 | 0.304 |
| 0.3041 | 0.304 |
| 0.3042 | 0.305 |
| 0.3043 | 0.305 |
| 0.3044 | 0.305 |
| 0.3045 | 0.305 |
| 0.3046 | 0.305 |
| 0.3047 | 0.305 |
| 0.3048 | 0.305 |
| 0.3049 | 0.305 |
| 0.305 | 0.305 |
| 0.3051 | 0.305 |
| 0.3052 | 0.306 |
| 0.3053 | 0.306 |
| 0.3054 | 0.306 |
| 0.3055 | 0.306 |
| 0.3056 | 0.306 |
| 0.3057 | 0.306 |
| 0.3058 | 0.306 |
| 0.3059 | 0.306 |
| 0.306 | 0.306 |
| 0.3061 | 0.306 |
| 0.3062 | 0.307 |
| 0.3063 | 0.307 |
| 0.3064 | 0.307 |
| 0.3065 | 0.307 |
| 0.3066 | 0.307 |
| 0.3067 | 0.307 |
| 0.3068 | 0.307 |
| 0.3069 | 0.307 |
| 0.307 | 0.307 |
| 0.3071 | 0.307 |
| 0.3072 | 0.308 |
| 0.3073 | 0.308 |
| 0.3074 | 0.308 |
| 0.3075 | 0.308 |
| 0.3076 | 0.308 |
| 0.3077 | 0.308 |
| 0.3078 | 0.308 |
| 0.3079 | 0.308 |
| 0.308 | 0.308 |
| 0.3081 | 0.308 |
| 0.3082 | 0.309 |
| 0.3083 | 0.309 |
| 0.3084 | 0.309 |
| 0.3085 | 0.309 |
| 0.3086 | 0.309 |
| 0.3087 | 0.309 |
| 0.3088 | 0.309 |
| 0.3089 | 0.309 |
| 0.309 | 0.309 |
| 0.3091 | 0.309 |
| 0.3092 | 0.31 |
| 0.3093 | 0.31 |
| 0.3094 | 0.31 |
| 0.3095 | 0.31 |
| 0.3096 | 0.31 |
| 0.3097 | 0.31 |
| 0.3098 | 0.31 |
| 0.3099 | 0.31 |
| 0.31 | 0.31 |
| 0.3101 | 0.31 |
| 0.3102 | 0.311 |
| 0.3103 | 0.311 |
| 0.3104 | 0.311 |
| 0.3105 | 0.311 |
| 0.3106 | 0.311 |
| 0.3107 | 0.311 |
| 0.3108 | 0.311 |
| 0.3109 | 0.311 |
| 0.311 | 0.311 |
| 0.3111 | 0.311 |
| 0.3112 | 0.312 |
| 0.3113 | 0.312 |
| 0.3114 | 0.312 |
| 0.3115 | 0.312 |
| 0.3116 | 0.312 |
| 0.3117 | 0.312 |
| 0.3118 | 0.312 |
| 0.3119 | 0.312 |
| 0.312 | 0.312 |
| 0.3121 | 0.312 |
| 0.3122 | 0.313 |
| 0.3123 | 0.313 |
| 0.3124 | 0.313 |
| 0.3125 | 0.313 |
| 0.3126 | 0.313 |
| 0.3127 | 0.313 |
| 0.3128 | 0.313 |
| 0.3129 | 0.313 |
| 0.313 | 0.313 |
| 0.3131 | 0.313 |
| 0.3132 | 0.314 |
| 0.3133 | 0.314 |
| 0.3134 | 0.314 |
| 0.3135 | 0.314 |
| 0.3136 | 0.314 |
| 0.3137 | 0.314 |
| 0.3138 | 0.314 |
| 0.3139 | 0.314 |
| 0.314 | 0.314 |
| 0.3141 | 0.314 |
| 0.3142 | 0.315 |
| 0.3143 | 0.315 |
| 0.3144 | 0.315 |
| 0.3145 | 0.315 |
| 0.3146 | 0.315 |
| 0.3147 | 0.315 |
| 0.3148 | 0.315 |
| 0.3149 | 0.315 |
| 0.315 | 0.315 |
| 0.3151 | 0.316 |
| 0.3152 | 0.316 |
| 0.3153 | 0.316 |
| 0.3154 | 0.316 |
| 0.3155 | 0.316 |
| 0.3156 | 0.316 |
| 0.3157 | 0.316 |
| 0.3158 | 0.316 |
| 0.3159 | 0.316 |
| 0.316 | 0.316 |
| 0.3161 | 0.316 |
| 0.3162 | 0.317 |
| 0.3163 | 0.317 |
| 0.3164 | 0.317 |
| 0.3165 | 0.317 |
| 0.3166 | 0.317 |
| 0.3167 | 0.317 |
| 0.3168 | 0.317 |
| 0.3169 | 0.317 |
| 0.317 | 0.317 |
| 0.3171 | 0.317 |
| 0.3172 | 0.318 |
| 0.3173 | 0.318 |
| 0.3174 | 0.318 |
| 0.3175 | 0.318 |
| 0.3176 | 0.318 |
| 0.3177 | 0.318 |
| 0.3178 | 0.318 |
| 0.3179 | 0.318 |
| 0.318 | 0.318 |
| 0.3181 | 0.318 |
| 0.3182 | 0.319 |
| 0.3183 | 0.319 |
| 0.3184 | 0.319 |
| 0.3185 | 0.319 |
| 0.3186 | 0.319 |
| 0.3187 | 0.319 |
| 0.3188 | 0.319 |
| 0.3189 | 0.319 |
| 0.319 | 0.319 |
| 0.3191 | 0.319 |
| 0.3192 | 0.32 |
| 0.3193 | 0.32 |
| 0.3194 | 0.32 |
| 0.3195 | 0.32 |
| 0.3196 | 0.32 |
| 0.3197 | 0.32 |
| 0.3198 | 0.32 |
| 0.3199 | 0.32 |
| 0.32 | 0.32 |
| 0.3201 | 0.32 |
| 0.3202 | 0.321 |
| 0.3203 | 0.321 |
| 0.3204 | 0.321 |
| 0.3205 | 0.321 |
| 0.3206 | 0.321 |
| 0.3207 | 0.321 |
| 0.3208 | 0.321 |
| 0.3209 | 0.321 |
| 0.321 | 0.321 |
| 0.3211 | 0.321 |
| 0.3212 | 0.322 |
| 0.3213 | 0.322 |
| 0.3214 | 0.322 |
| 0.3215 | 0.322 |
| 0.3216 | 0.322 |
| 0.3217 | 0.322 |
| 0.3218 | 0.322 |
| 0.3219 | 0.322 |
| 0.322 | 0.322 |
| 0.3221 | 0.322 |
| 0.3222 | 0.323 |
| 0.3223 | 0.323 |
| 0.3224 | 0.323 |
| 0.3225 | 0.323 |
| 0.3226 | 0.323 |
| 0.3227 | 0.323 |
| 0.3228 | 0.323 |
| 0.3229 | 0.323 |
| 0.323 | 0.323 |
| 0.3231 | 0.323 |
| 0.3232 | 0.324 |
| 0.3233 | 0.324 |
| 0.3234 | 0.324 |
| 0.3235 | 0.324 |
| 0.3236 | 0.324 |
| 0.3237 | 0.324 |
| 0.3238 | 0.324 |
| 0.3239 | 0.324 |
| 0.324 | 0.324 |
| 0.3241 | 0.325 |
| 0.3242 | 0.325 |
| 0.3243 | 0.325 |
| 0.3244 | 0.325 |
| 0.3245 | 0.325 |
| 0.3246 | 0.325 |
| 0.3247 | 0.325 |
| 0.3248 | 0.325 |
| 0.3249 | 0.325 |
| 0.325 | 0.325 |
| 0.3251 | 0.326 |
| 0.3252 | 0.326 |
| 0.3253 | 0.326 |
| 0.3254 | 0.326 |
| 0.3255 | 0.326 |
| 0.3256 | 0.326 |
| 0.3257 | 0.326 |
| 0.3258 | 0.326 |
| 0.3259 | 0.326 |
| 0.326 | 0.326 |
| 0.3261 | 0.326 |
| 0.3262 | 0.327 |
| 0.3263 | 0.327 |
| 0.3264 | 0.327 |
| 0.3265 | 0.327 |
| 0.3266 | 0.327 |
| 0.3267 | 0.327 |
| 0.3268 | 0.327 |
| 0.3269 | 0.327 |
| 0.327 | 0.327 |
| 0.3271 | 0.327 |
| 0.3272 | 0.328 |
| 0.3273 | 0.328 |
| 0.3274 | 0.328 |
| 0.3275 | 0.328 |
| 0.3276 | 0.328 |
| 0.3277 | 0.328 |
| 0.3278 | 0.328 |
| 0.3279 | 0.328 |
| 0.328 | 0.328 |
| 0.3281 | 0.328 |
| 0.3282 | 0.329 |
| 0.3283 | 0.329 |
| 0.3284 | 0.329 |
| 0.3285 | 0.329 |
| 0.3286 | 0.329 |
| 0.3287 | 0.329 |
| 0.3288 | 0.329 |
| 0.3289 | 0.329 |
| 0.329 | 0.329 |
| 0.3291 | 0.329 |
| 0.3292 | 0.33 |
| 0.3293 | 0.33 |
| 0.3294 | 0.33 |
| 0.3295 | 0.33 |
| 0.3296 | 0.33 |
| 0.3297 | 0.33 |
| 0.3298 | 0.33 |
| 0.3299 | 0.33 |
| 0.33 | 0.33 |
| 0.3301 | 0.33 |
| 0.3302 | 0.331 |
| 0.3303 | 0.331 |
| 0.3304 | 0.331 |
| 0.3305 | 0.331 |
| 0.3306 | 0.331 |
| 0.3307 | 0.331 |
| 0.3308 | 0.331 |
| 0.3309 | 0.331 |
| 0.331 | 0.331 |
| 0.3311 | 0.331 |
| 0.3312 | 0.332 |
| 0.3313 | 0.332 |
| 0.3314 | 0.332 |
| 0.3315 | 0.332 |
| 0.3316 | 0.332 |
| 0.3317 | 0.332 |
| 0.3318 | 0.332 |
| 0.3319 | 0.332 |
| 0.332 | 0.332 |
| 0.3321 | 0.333 |
| 0.3322 | 0.333 |
| 0.3323 | 0.333 |
| 0.3324 | 0.333 |
| 0.3325 | 0.333 |
| 0.3326 | 0.333 |
| 0.3327 | 0.333 |
| 0.3328 | 0.333 |
| 0.3329 | 0.333 |
| 0.333 | 0.333 |
| 0.3331 | 0.333 |
| 0.3332 | 0.334 |
| 0.3333 | 0.334 |
| 0.3334 | 0.334 |
| 0.3335 | 0.334 |
| 0.3336 | 0.334 |
| 0.3337 | 0.334 |
| 0.3338 | 0.334 |
| 0.3339 | 0.334 |
| 0.334 | 0.334 |
| 0.3341 | 0.334 |
| 0.3342 | 0.335 |
| 0.3343 | 0.335 |
| 0.3344 | 0.335 |
| 0.3345 | 0.335 |
| 0.3346 | 0.335 |
| 0.3347 | 0.335 |
| 0.3348 | 0.335 |
| 0.3349 | 0.335 |
| 0.335 | 0.335 |
| 0.3351 | 0.335 |
| 0.3352 | 0.336 |
| 0.3353 | 0.336 |
| 0.3354 | 0.336 |
| 0.3355 | 0.336 |
| 0.3356 | 0.336 |
| 0.3357 | 0.336 |
| 0.3358 | 0.336 |
| 0.3359 | 0.336 |
| 0.336 | 0.336 |
| 0.3361 | 0.336 |
| 0.3362 | 0.337 |
| 0.3363 | 0.337 |
| 0.3364 | 0.337 |
| 0.3365 | 0.337 |
| 0.3366 | 0.337 |
| 0.3367 | 0.337 |
| 0.3368 | 0.337 |
| 0.3369 | 0.337 |
| 0.337 | 0.337 |
| 0.3371 | 0.337 |
| 0.3372 | 0.338 |
| 0.3373 | 0.338 |
| 0.3374 | 0.338 |
| 0.3375 | 0.338 |
| 0.3376 | 0.338 |
| 0.3377 | 0.338 |
| 0.3378 | 0.338 |
| 0.3379 | 0.338 |
| 0.338 | 0.338 |
| 0.3381 | 0.338 |
| 0.3382 | 0.339 |
| 0.3383 | 0.339 |
| 0.3384 | 0.339 |
| 0.3385 | 0.339 |
| 0.3386 | 0.339 |
| 0.3387 | 0.339 |
| 0.3388 | 0.339 |
| 0.3389 | 0.339 |
| 0.339 | 0.339 |
| 0.3391 | 0.339 |
| 0.3392 | 0.34 |
| 0.3393 | 0.34 |
| 0.3394 | 0.34 |
| 0.3395 | 0.34 |
| 0.3396 | 0.34 |
| 0.3397 | 0.34 |
| 0.3398 | 0.34 |
| 0.3399 | 0.34 |
| 0.34 | 0.34 |
| 0.3401 | 0.34 |
| 0.3402 | 0.341 |
| 0.3403 | 0.341 |
| 0.3404 | 0.341 |
| 0.3405 | 0.341 |
| 0.3406 | 0.341 |
| 0.3407 | 0.341 |
| 0.3408 | 0.341 |
| 0.3409 | 0.341 |
| 0.341 | 0.341 |
| 0.3411 | 0.341 |
| 0.3412 | 0.342 |
| 0.3413 | 0.342 |
| 0.3414 | 0.342 |
| 0.3415 | 0.342 |
| 0.3416 | 0.342 |
| 0.3417 | 0.342 |
| 0.3418 | 0.342 |
| 0.3419 | 0.342 |
| 0.342 | 0.342 |
| 0.3421 | 0.342 |
| 0.3422 | 0.343 |
| 0.3423 | 0.343 |
| 0.3424 | 0.343 |
| 0.3425 | 0.343 |
| 0.3426 | 0.343 |
| 0.3427 | 0.343 |
| 0.3428 | 0.343 |
| 0.3429 | 0.343 |
| 0.343 | 0.343 |
| 0.3431 | 0.343 |
| 0.3432 | 0.344 |
| 0.3433 | 0.344 |
| 0.3434 | 0.344 |
| 0.3435 | 0.344 |
| 0.3436 | 0.344 |
| 0.3437 | 0.344 |
| 0.3438 | 0.344 |
| 0.3439 | 0.344 |
| 0.344 | 0.344 |
| 0.3441 | 0.344 |
| 0.3442 | 0.345 |
| 0.3443 | 0.345 |
| 0.3444 | 0.345 |
| 0.3445 | 0.345 |
| 0.3446 | 0.345 |
| 0.3447 | 0.345 |
| 0.3448 | 0.345 |
| 0.3449 | 0.345 |
| 0.345 | 0.345 |
| 0.3451 | 0.346 |
| 0.3452 | 0.346 |
| 0.3453 | 0.346 |
| 0.3454 | 0.346 |
| 0.3455 | 0.346 |
| 0.3456 | 0.346 |
| 0.3457 | 0.346 |
| 0.3458 | 0.346 |
| 0.3459 | 0.346 |
| 0.346 | 0.346 |
| 0.3461 | 0.347 |
| 0.3462 | 0.347 |
| 0.3463 | 0.347 |
| 0.3464 | 0.347 |
| 0.3465 | 0.347 |
| 0.3466 | 0.347 |
| 0.3467 | 0.347 |
| 0.3468 | 0.347 |
| 0.3469 | 0.347 |
| 0.347 | 0.347 |
| 0.3471 | 0.347 |
| 0.3472 | 0.348 |
| 0.3473 | 0.348 |
| 0.3474 | 0.348 |
| 0.3475 | 0.348 |
| 0.3476 | 0.348 |
| 0.3477 | 0.348 |
| 0.3478 | 0.348 |
| 0.3479 | 0.348 |
| 0.348 | 0.348 |
| 0.3481 | 0.348 |
| 0.3482 | 0.349 |
| 0.3483 | 0.349 |
| 0.3484 | 0.349 |
| 0.3485 | 0.349 |
| 0.3486 | 0.349 |
| 0.3487 | 0.349 |
| 0.3488 | 0.349 |
| 0.3489 | 0.349 |
| 0.349 | 0.349 |
| 0.3491 | 0.349 |
| 0.3492 | 0.35 |
| 0.3493 | 0.35 |
| 0.3494 | 0.35 |
| 0.3495 | 0.35 |
| 0.3496 | 0.35 |
| 0.3497 | 0.35 |
| 0.3498 | 0.35 |
| 0.3499 | 0.35 |
| 0.35 | 0.35 |
| 0.3501 | 0.35 |
| 0.3502 | 0.351 |
| 0.3503 | 0.351 |
| 0.3504 | 0.351 |
| 0.3505 | 0.351 |
| 0.3506 | 0.351 |
| 0.3507 | 0.351 |
| 0.3508 | 0.351 |
| 0.3509 | 0.351 |
| 0.351 | 0.351 |
| 0.3511 | 0.351 |
| 0.3512 | 0.352 |
| 0.3513 | 0.352 |
| 0.3514 | 0.352 |
| 0.3515 | 0.352 |
| 0.3516 | 0.352 |
| 0.3517 | 0.352 |
| 0.3518 | 0.352 |
| 0.3519 | 0.352 |
| 0.352 | 0.352 |
| 0.3521 | 0.352 |
| 0.3522 | 0.353 |
| 0.3523 | 0.353 |
| 0.3524 | 0.353 |
| 0.3525 | 0.353 |
| 0.3526 | 0.353 |
| 0.3527 | 0.353 |
| 0.3528 | 0.353 |
| 0.3529 | 0.353 |
| 0.353 | 0.353 |
| 0.3531 | 0.354 |
| 0.3532 | 0.354 |
| 0.3533 | 0.354 |
| 0.3534 | 0.354 |
| 0.3535 | 0.354 |
| 0.3536 | 0.354 |
| 0.3537 | 0.354 |
| 0.3538 | 0.354 |
| 0.3539 | 0.354 |
| 0.354 | 0.354 |
| 0.3541 | 0.354 |
| 0.3542 | 0.355 |
| 0.3543 | 0.355 |
| 0.3544 | 0.355 |
| 0.3545 | 0.355 |
| 0.3546 | 0.355 |
| 0.3547 | 0.355 |
| 0.3548 | 0.355 |
| 0.3549 | 0.355 |
| 0.355 | 0.355 |
| 0.3551 | 0.355 |
| 0.3552 | 0.356 |
| 0.3553 | 0.356 |
| 0.3554 | 0.356 |
| 0.3555 | 0.356 |
| 0.3556 | 0.356 |
| 0.3557 | 0.356 |
| 0.3558 | 0.356 |
| 0.3559 | 0.356 |
| 0.356 | 0.356 |
| 0.3561 | 0.356 |
| 0.3562 | 0.357 |
| 0.3563 | 0.357 |
| 0.3564 | 0.357 |
| 0.3565 | 0.357 |
| 0.3566 | 0.357 |
| 0.3567 | 0.357 |
| 0.3568 | 0.357 |
| 0.3569 | 0.357 |
| 0.357 | 0.357 |
| 0.3571 | 0.357 |
| 0.3572 | 0.358 |
| 0.3573 | 0.358 |
| 0.3574 | 0.358 |
| 0.3575 | 0.358 |
| 0.3576 | 0.358 |
| 0.3577 | 0.358 |
| 0.3578 | 0.358 |
| 0.3579 | 0.358 |
| 0.358 | 0.358 |
| 0.3581 | 0.359 |
| 0.3582 | 0.359 |
| 0.3583 | 0.359 |
| 0.3584 | 0.359 |
| 0.3585 | 0.359 |
| 0.3586 | 0.359 |
| 0.3587 | 0.359 |
| 0.3588 | 0.359 |
| 0.3589 | 0.359 |
| 0.359 | 0.359 |
| 0.3591 | 0.36 |
| 0.3592 | 0.36 |
| 0.3593 | 0.36 |
| 0.3594 | 0.36 |
| 0.3595 | 0.36 |
| 0.3596 | 0.36 |
| 0.3597 | 0.36 |
| 0.3598 | 0.36 |
| 0.3599 | 0.36 |
| 0.36 | 0.36 |
| 0.3601 | 0.36 |
| 0.3602 | 0.361 |
| 0.3603 | 0.361 |
| 0.3604 | 0.361 |
| 0.3605 | 0.361 |
| 0.3606 | 0.361 |
| 0.3607 | 0.361 |
| 0.3608 | 0.361 |
| 0.3609 | 0.361 |
| 0.361 | 0.361 |
| 0.3611 | 0.361 |
| 0.3612 | 0.362 |
| 0.3613 | 0.362 |
| 0.3614 | 0.362 |
| 0.3615 | 0.362 |
| 0.3616 | 0.362 |
| 0.3617 | 0.362 |
| 0.3618 | 0.362 |
| 0.3619 | 0.362 |
| 0.362 | 0.362 |
| 0.3621 | 0.362 |
| 0.3622 | 0.363 |
| 0.3623 | 0.363 |
| 0.3624 | 0.363 |
| 0.3625 | 0.363 |
| 0.3626 | 0.363 |
| 0.3627 | 0.363 |
| 0.3628 | 0.363 |
| 0.3629 | 0.363 |
| 0.363 | 0.363 |
| 0.3631 | 0.364 |
| 0.3632 | 0.364 |
| 0.3633 | 0.364 |
| 0.3634 | 0.364 |
| 0.3635 | 0.364 |
| 0.3636 | 0.364 |
| 0.3637 | 0.364 |
| 0.3638 | 0.364 |
| 0.3639 | 0.364 |
| 0.364 | 0.364 |
| 0.3641 | 0.364 |
| 0.3642 | 0.365 |
| 0.3643 | 0.365 |
| 0.3644 | 0.365 |
| 0.3645 | 0.365 |
| 0.3646 | 0.365 |
| 0.3647 | 0.365 |
| 0.3648 | 0.365 |
| 0.3649 | 0.365 |
| 0.365 | 0.365 |
| 0.3651 | 0.366 |
| 0.3652 | 0.366 |
| 0.3653 | 0.366 |
| 0.3654 | 0.366 |
| 0.3655 | 0.366 |
| 0.3656 | 0.366 |
| 0.3657 | 0.366 |
| 0.3658 | 0.366 |
| 0.3659 | 0.366 |
| 0.366 | 0.366 |
| 0.3661 | 0.366 |
| 0.3662 | 0.367 |
| 0.3663 | 0.367 |
| 0.3664 | 0.367 |
| 0.3665 | 0.367 |
| 0.3666 | 0.367 |
| 0.3667 | 0.367 |
| 0.3668 | 0.367 |
| 0.3669 | 0.367 |
| 0.367 | 0.367 |
| 0.3671 | 0.367 |
| 0.3672 | 0.368 |
| 0.3673 | 0.368 |
| 0.3674 | 0.368 |
| 0.3675 | 0.368 |
| 0.3676 | 0.368 |
| 0.3677 | 0.368 |
| 0.3678 | 0.368 |
| 0.3679 | 0.368 |
| 0.368 | 0.368 |
| 0.3681 | 0.369 |
| 0.3682 | 0.369 |
| 0.3683 | 0.369 |
| 0.3684 | 0.369 |
| 0.3685 | 0.369 |
| 0.3686 | 0.369 |
| 0.3687 | 0.369 |
| 0.3688 | 0.369 |
| 0.3689 | 0.369 |
| 0.369 | 0.369 |
| 0.3691 | 0.37 |
| 0.3692 | 0.37 |
| 0.3693 | 0.37 |
| 0.3694 | 0.37 |
| 0.3695 | 0.37 |
| 0.3696 | 0.37 |
| 0.3697 | 0.37 |
| 0.3698 | 0.37 |
| 0.3699 | 0.37 |
| 0.37 | 0.37 |
| 0.3701 | 0.371 |
| 0.3702 | 0.371 |
| 0.3703 | 0.371 |
| 0.3704 | 0.371 |
| 0.3705 | 0.371 |
| 0.3706 | 0.371 |
| 0.3707 | 0.371 |
| 0.3708 | 0.371 |
| 0.3709 | 0.371 |
| 0.371 | 0.371 |
| 0.3711 | 0.372 |
| 0.3712 | 0.372 |
| 0.3713 | 0.372 |
| 0.3714 | 0.372 |
| 0.3715 | 0.372 |
| 0.3716 | 0.372 |
| 0.3717 | 0.372 |
| 0.3718 | 0.372 |
| 0.3719 | 0.372 |
| 0.372 | 0.372 |
| 0.3721 | 0.372 |
| 0.3722 | 0.373 |
| 0.3723 | 0.373 |
| 0.3724 | 0.373 |
| 0.3725 | 0.373 |
| 0.3726 | 0.373 |
| 0.3727 | 0.373 |
| 0.3728 | 0.373 |
| 0.3729 | 0.373 |
| 0.373 | 0.373 |
| 0.3731 | 0.374 |
| 0.3732 | 0.374 |
| 0.3733 | 0.374 |
| 0.3734 | 0.374 |
| 0.3735 | 0.374 |
| 0.3736 | 0.374 |
| 0.3737 | 0.374 |
| 0.3738 | 0.374 |
| 0.3739 | 0.374 |
| 0.374 | 0.374 |
| 0.3741 | 0.374 |
| 0.3742 | 0.375 |
| 0.3743 | 0.375 |
| 0.3744 | 0.375 |
| 0.3745 | 0.375 |
| 0.3746 | 0.375 |
| 0.3747 | 0.375 |
| 0.3748 | 0.375 |
| 0.3749 | 0.375 |
| 0.375 | 0.375 |
| 0.3751 | 0.375 |
| 0.3752 | 0.376 |
| 0.3753 | 0.376 |
| 0.3754 | 0.376 |
| 0.3755 | 0.376 |
| 0.3756 | 0.376 |
| 0.3757 | 0.376 |
| 0.3758 | 0.376 |
| 0.3759 | 0.376 |
| 0.376 | 0.376 |
| 0.3761 | 0.376 |
| 0.3762 | 0.377 |
| 0.3763 | 0.377 |
| 0.3764 | 0.377 |
| 0.3765 | 0.377 |
| 0.3766 | 0.377 |
| 0.3767 | 0.377 |
| 0.3768 | 0.377 |
| 0.3769 | 0.377 |
| 0.377 | 0.377 |
| 0.3771 | 0.377 |
| 0.3772 | 0.378 |
| 0.3773 | 0.378 |
| 0.3774 | 0.378 |
| 0.3775 | 0.378 |
| 0.3776 | 0.378 |
| 0.3777 | 0.378 |
| 0.3778 | 0.378 |
| 0.3779 | 0.378 |
| 0.378 | 0.378 |
| 0.3781 | 0.379 |
| 0.3782 | 0.379 |
| 0.3783 | 0.379 |
| 0.3784 | 0.379 |
| 0.3785 | 0.379 |
| 0.3786 | 0.379 |
| 0.3787 | 0.379 |
| 0.3788 | 0.379 |
| 0.3789 | 0.379 |
| 0.379 | 0.379 |
| 0.3791 | 0.38 |
| 0.3792 | 0.38 |
| 0.3793 | 0.38 |
| 0.3794 | 0.38 |
| 0.3795 | 0.38 |
| 0.3796 | 0.38 |
| 0.3797 | 0.38 |
| 0.3798 | 0.38 |
| 0.3799 | 0.38 |
| 0.38 | 0.38 |
| 0.3801 | 0.38 |
| 0.3802 | 0.381 |
| 0.3803 | 0.381 |
| 0.3804 | 0.381 |
| 0.3805 | 0.381 |
| 0.3806 | 0.381 |
| 0.3807 | 0.381 |
| 0.3808 | 0.381 |
| 0.3809 | 0.381 |
| 0.381 | 0.381 |
| 0.3811 | 0.382 |
| 0.3812 | 0.382 |
| 0.3813 | 0.382 |
| 0.3814 | 0.382 |
| 0.3815 | 0.382 |
| 0.3816 | 0.382 |
| 0.3817 | 0.382 |
| 0.3818 | 0.382 |
| 0.3819 | 0.382 |
| 0.382 | 0.382 |
| 0.3821 | 0.383 |
| 0.3822 | 0.383 |
| 0.3823 | 0.383 |
| 0.3824 | 0.383 |
| 0.3825 | 0.383 |
| 0.3826 | 0.383 |
| 0.3827 | 0.383 |
| 0.3828 | 0.383 |
| 0.3829 | 0.383 |
| 0.383 | 0.383 |
| 0.3831 | 0.384 |
| 0.3832 | 0.384 |
| 0.3833 | 0.384 |
| 0.3834 | 0.384 |
| 0.3835 | 0.384 |
| 0.3836 | 0.384 |
| 0.3837 | 0.384 |
| 0.3838 | 0.384 |
| 0.3839 | 0.384 |
| 0.384 | 0.384 |
| 0.3841 | 0.385 |
| 0.3842 | 0.385 |
| 0.3843 | 0.385 |
| 0.3844 | 0.385 |
| 0.3845 | 0.385 |
| 0.3846 | 0.385 |
| 0.3847 | 0.385 |
| 0.3848 | 0.385 |
| 0.3849 | 0.385 |
| 0.385 | 0.385 |
| 0.3851 | 0.386 |
| 0.3852 | 0.386 |
| 0.3853 | 0.386 |
| 0.3854 | 0.386 |
| 0.3855 | 0.386 |
| 0.3856 | 0.386 |
| 0.3857 | 0.386 |
| 0.3858 | 0.386 |
| 0.3859 | 0.386 |
| 0.386 | 0.386 |
| 0.3861 | 0.386 |
| 0.3862 | 0.387 |
| 0.3863 | 0.387 |
| 0.3864 | 0.387 |
| 0.3865 | 0.387 |
| 0.3866 | 0.387 |
| 0.3867 | 0.387 |
| 0.3868 | 0.387 |
| 0.3869 | 0.387 |
| 0.387 | 0.387 |
| 0.3871 | 0.388 |
| 0.3872 | 0.388 |
| 0.3873 | 0.388 |
| 0.3874 | 0.388 |
| 0.3875 | 0.388 |
| 0.3876 | 0.388 |
| 0.3877 | 0.388 |
| 0.3878 | 0.388 |
| 0.3879 | 0.388 |
| 0.388 | 0.388 |
| 0.3881 | 0.389 |
| 0.3882 | 0.389 |
| 0.3883 | 0.389 |
| 0.3884 | 0.389 |
| 0.3885 | 0.389 |
| 0.3886 | 0.389 |
| 0.3887 | 0.389 |
| 0.3888 | 0.389 |
| 0.3889 | 0.389 |
| 0.389 | 0.389 |
| 0.3891 | 0.389 |
| 0.3892 | 0.39 |
| 0.3893 | 0.39 |
| 0.3894 | 0.39 |
| 0.3895 | 0.39 |
| 0.3896 | 0.39 |
| 0.3897 | 0.39 |
| 0.3898 | 0.39 |
| 0.3899 | 0.39 |
| 0.39 | 0.39 |
| 0.3901 | 0.391 |
| 0.3902 | 0.391 |
| 0.3903 | 0.391 |
| 0.3904 | 0.391 |
| 0.3905 | 0.391 |
| 0.3906 | 0.391 |
| 0.3907 | 0.391 |
| 0.3908 | 0.391 |
| 0.3909 | 0.391 |
| 0.391 | 0.391 |
| 0.3911 | 0.391 |
| 0.3912 | 0.392 |
| 0.3913 | 0.392 |
| 0.3914 | 0.392 |
| 0.3915 | 0.392 |
| 0.3916 | 0.392 |
| 0.3917 | 0.392 |
| 0.3918 | 0.392 |
| 0.3919 | 0.392 |
| 0.392 | 0.392 |
| 0.3921 | 0.392 |
| 0.3922 | 0.393 |
| 0.3923 | 0.393 |
| 0.3924 | 0.393 |
| 0.3925 | 0.393 |
| 0.3926 | 0.393 |
| 0.3927 | 0.393 |
| 0.3928 | 0.393 |
| 0.3929 | 0.393 |
| 0.393 | 0.393 |
| 0.3931 | 0.394 |
| 0.3932 | 0.394 |
| 0.3933 | 0.394 |
| 0.3934 | 0.394 |
| 0.3935 | 0.394 |
| 0.3936 | 0.394 |
| 0.3937 | 0.394 |
| 0.3938 | 0.394 |
| 0.3939 | 0.394 |
| 0.394 | 0.394 |
| 0.3941 | 0.395 |
| 0.3942 | 0.395 |
| 0.3943 | 0.395 |
| 0.3944 | 0.395 |
| 0.3945 | 0.395 |
| 0.3946 | 0.395 |
| 0.3947 | 0.395 |
| 0.3948 | 0.395 |
| 0.3949 | 0.395 |
| 0.395 | 0.395 |
| 0.3951 | 0.396 |
| 0.3952 | 0.396 |
| 0.3953 | 0.396 |
| 0.3954 | 0.396 |
| 0.3955 | 0.396 |
| 0.3956 | 0.396 |
| 0.3957 | 0.396 |
| 0.3958 | 0.396 |
| 0.3959 | 0.396 |
| 0.396 | 0.396 |
| 0.3961 | 0.397 |
| 0.3962 | 0.397 |
| 0.3963 | 0.397 |
| 0.3964 | 0.397 |
| 0.3965 | 0.397 |
| 0.3966 | 0.397 |
| 0.3967 | 0.397 |
| 0.3968 | 0.397 |
| 0.3969 | 0.397 |
| 0.397 | 0.397 |
| 0.3971 | 0.398 |
| 0.3972 | 0.398 |
| 0.3973 | 0.398 |
| 0.3974 | 0.398 |
| 0.3975 | 0.398 |
| 0.3976 | 0.398 |
| 0.3977 | 0.398 |
| 0.3978 | 0.398 |
| 0.3979 | 0.398 |
| 0.398 | 0.398 |
| 0.3981 | 0.398 |
| 0.3982 | 0.399 |
| 0.3983 | 0.399 |
| 0.3984 | 0.399 |
| 0.3985 | 0.399 |
| 0.3986 | 0.399 |
| 0.3987 | 0.399 |
| 0.3988 | 0.399 |
| 0.3989 | 0.399 |
| 0.399 | 0.399 |
| 0.3991 | 0.4 |
| 0.3992 | 0.4 |
| 0.3993 | 0.4 |
| 0.3994 | 0.4 |
| 0.3995 | 0.4 |
| 0.3996 | 0.4 |
| 0.3997 | 0.4 |
| 0.3998 | 0.4 |
| 0.3999 | 0.4 |
| 0.4 | 0.4 |
| 0.4001 | 0.401 |
| 0.4002 | 0.401 |
| 0.4003 | 0.401 |
| 0.4004 | 0.401 |
| 0.4005 | 0.401 |
| 0.4006 | 0.401 |
| 0.4007 | 0.401 |
| 0.4008 | 0.401 |
| 0.4009 | 0.401 |
| 0.401 | 0.401 |
| 0.4011 | 0.402 |
| 0.4012 | 0.402 |
| 0.4013 | 0.402 |
| 0.4014 | 0.402 |
| 0.4015 | 0.402 |
| 0.4016 | 0.402 |
| 0.4017 | 0.402 |
| 0.4018 | 0.402 |
| 0.4019 | 0.402 |
| 0.402 | 0.402 |
| 0.4021 | 0.403 |
| 0.4022 | 0.403 |
| 0.4023 | 0.403 |
| 0.4024 | 0.403 |
| 0.4025 | 0.403 |
| 0.4026 | 0.403 |
| 0.4027 | 0.403 |
| 0.4028 | 0.403 |
| 0.4029 | 0.403 |
| 0.403 | 0.403 |
| 0.4031 | 0.404 |
| 0.4032 | 0.404 |
| 0.4033 | 0.404 |
| 0.4034 | 0.404 |
| 0.4035 | 0.404 |
| 0.4036 | 0.404 |
| 0.4037 | 0.404 |
| 0.4038 | 0.404 |
| 0.4039 | 0.404 |
| 0.404 | 0.404 |
| 0.4041 | 0.405 |
| 0.4042 | 0.405 |
| 0.4043 | 0.405 |
| 0.4044 | 0.405 |
| 0.4045 | 0.405 |
| 0.4046 | 0.405 |
| 0.4047 | 0.405 |
| 0.4048 | 0.405 |
| 0.4049 | 0.405 |
| 0.405 | 0.405 |
| 0.4051 | 0.406 |
| 0.4052 | 0.406 |
| 0.4053 | 0.406 |
| 0.4054 | 0.406 |
| 0.4055 | 0.406 |
| 0.4056 | 0.406 |
| 0.4057 | 0.406 |
| 0.4058 | 0.406 |
| 0.4059 | 0.406 |
| 0.406 | 0.406 |
| 0.4061 | 0.406 |
| 0.4062 | 0.407 |
| 0.4063 | 0.407 |
| 0.4064 | 0.407 |
| 0.4065 | 0.407 |
| 0.4066 | 0.407 |
| 0.4067 | 0.407 |
| 0.4068 | 0.407 |
| 0.4069 | 0.407 |
| 0.407 | 0.407 |
| 0.4071 | 0.408 |
| 0.4072 | 0.408 |
| 0.4073 | 0.408 |
| 0.4074 | 0.408 |
| 0.4075 | 0.408 |
| 0.4076 | 0.408 |
| 0.4077 | 0.408 |
| 0.4078 | 0.408 |
| 0.4079 | 0.408 |
| 0.408 | 0.408 |
| 0.4081 | 0.408 |
| 0.4082 | 0.409 |
| 0.4083 | 0.409 |
| 0.4084 | 0.409 |
| 0.4085 | 0.409 |
| 0.4086 | 0.409 |
| 0.4087 | 0.409 |
| 0.4088 | 0.409 |
| 0.4089 | 0.409 |
| 0.409 | 0.409 |
| 0.4091 | 0.41 |
| 0.4092 | 0.41 |
| 0.4093 | 0.41 |
| 0.4094 | 0.41 |
| 0.4095 | 0.41 |
| 0.4096 | 0.41 |
| 0.4097 | 0.41 |
| 0.4098 | 0.41 |
| 0.4099 | 0.41 |
| 0.41 | 0.41 |
| 0.4101 | 0.411 |
| 0.4102 | 0.411 |
| 0.4103 | 0.411 |
| 0.4104 | 0.411 |
| 0.4105 | 0.411 |
| 0.4106 | 0.411 |
| 0.4107 | 0.411 |
| 0.4108 | 0.411 |
| 0.4109 | 0.411 |
| 0.411 | 0.411 |
| 0.4111 | 0.412 |
| 0.4112 | 0.412 |
| 0.4113 | 0.412 |
| 0.4114 | 0.412 |
| 0.4115 | 0.412 |
| 0.4116 | 0.412 |
| 0.4117 | 0.412 |
| 0.4118 | 0.412 |
| 0.4119 | 0.412 |
| 0.412 | 0.412 |
| 0.4121 | 0.413 |
| 0.4122 | 0.413 |
| 0.4123 | 0.413 |
| 0.4124 | 0.413 |
| 0.4125 | 0.413 |
| 0.4126 | 0.413 |
| 0.4127 | 0.413 |
| 0.4128 | 0.413 |
| 0.4129 | 0.413 |
| 0.413 | 0.413 |
| 0.4131 | 0.414 |
| 0.4132 | 0.414 |
| 0.4133 | 0.414 |
| 0.4134 | 0.414 |
| 0.4135 | 0.414 |
| 0.4136 | 0.414 |
| 0.4137 | 0.414 |
| 0.4138 | 0.414 |
| 0.4139 | 0.414 |
| 0.414 | 0.414 |
| 0.4141 | 0.415 |
| 0.4142 | 0.415 |
| 0.4143 | 0.415 |
| 0.4144 | 0.415 |
| 0.4145 | 0.415 |
| 0.4146 | 0.415 |
| 0.4147 | 0.415 |
| 0.4148 | 0.415 |
| 0.4149 | 0.415 |
| 0.415 | 0.415 |
| 0.4151 | 0.416 |
| 0.4152 | 0.416 |
| 0.4153 | 0.416 |
| 0.4154 | 0.416 |
| 0.4155 | 0.416 |
| 0.4156 | 0.416 |
| 0.4157 | 0.416 |
| 0.4158 | 0.416 |
| 0.4159 | 0.416 |
| 0.416 | 0.416 |
| 0.4161 | 0.417 |
| 0.4162 | 0.417 |
| 0.4163 | 0.417 |
| 0.4164 | 0.417 |
| 0.4165 | 0.417 |
| 0.4166 | 0.417 |
| 0.4167 | 0.417 |
| 0.4168 | 0.417 |
| 0.4169 | 0.417 |
| 0.417 | 0.417 |
| 0.4171 | 0.418 |
| 0.4172 | 0.418 |
| 0.4173 | 0.418 |
| 0.4174 | 0.418 |
| 0.4175 | 0.418 |
| 0.4176 | 0.418 |
| 0.4177 | 0.418 |
| 0.4178 | 0.418 |
| 0.4179 | 0.418 |
| 0.418 | 0.418 |
| 0.4181 | 0.419 |
| 0.4182 | 0.419 |
| 0.4183 | 0.419 |
| 0.4184 | 0.419 |
| 0.4185 | 0.419 |
| 0.4186 | 0.419 |
| 0.4187 | 0.419 |
| 0.4188 | 0.419 |
| 0.4189 | 0.419 |
| 0.419 | 0.419 |
| 0.4191 | 0.42 |
| 0.4192 | 0.42 |
| 0.4193 | 0.42 |
| 0.4194 | 0.42 |
| 0.4195 | 0.42 |
| 0.4196 | 0.42 |
| 0.4197 | 0.42 |
| 0.4198 | 0.42 |
| 0.4199 | 0.42 |
| 0.42 | 0.42 |
| 0.4201 | 0.421 |
| 0.4202 | 0.421 |
| 0.4203 | 0.421 |
| 0.4204 | 0.421 |
| 0.4205 | 0.421 |
| 0.4206 | 0.421 |
| 0.4207 | 0.421 |
| 0.4208 | 0.421 |
| 0.4209 | 0.421 |
| 0.421 | 0.421 |
| 0.4211 | 0.422 |
| 0.4212 | 0.422 |
| 0.4213 | 0.422 |
| 0.4214 | 0.422 |
| 0.4215 | 0.422 |
| 0.4216 | 0.422 |
| 0.4217 | 0.422 |
| 0.4218 | 0.422 |
| 0.4219 | 0.422 |
| 0.422 | 0.422 |
| 0.4221 | 0.423 |
| 0.4222 | 0.423 |
| 0.4223 | 0.423 |
| 0.4224 | 0.423 |
| 0.4225 | 0.423 |
| 0.4226 | 0.423 |
| 0.4227 | 0.423 |
| 0.4228 | 0.423 |
| 0.4229 | 0.423 |
| 0.423 | 0.423 |
| 0.4231 | 0.424 |
| 0.4232 | 0.424 |
| 0.4233 | 0.424 |
| 0.4234 | 0.424 |
| 0.4235 | 0.424 |
| 0.4236 | 0.424 |
| 0.4237 | 0.424 |
| 0.4238 | 0.424 |
| 0.4239 | 0.424 |
| 0.424 | 0.424 |
| 0.4241 | 0.425 |
| 0.4242 | 0.425 |
| 0.4243 | 0.425 |
| 0.4244 | 0.425 |
| 0.4245 | 0.425 |
| 0.4246 | 0.425 |
| 0.4247 | 0.425 |
| 0.4248 | 0.425 |
| 0.4249 | 0.425 |
| 0.425 | 0.425 |
| 0.4251 | 0.426 |
| 0.4252 | 0.426 |
| 0.4253 | 0.426 |
| 0.4254 | 0.426 |
| 0.4255 | 0.426 |
| 0.4256 | 0.426 |
| 0.4257 | 0.426 |
| 0.4258 | 0.426 |
| 0.4259 | 0.426 |
| 0.426 | 0.427 |
| 0.4261 | 0.427 |
| 0.4262 | 0.427 |
| 0.4263 | 0.427 |
| 0.4264 | 0.427 |
| 0.4265 | 0.427 |
| 0.4266 | 0.427 |
| 0.4267 | 0.427 |
| 0.4268 | 0.427 |
| 0.4269 | 0.427 |
| 0.427 | 0.427 |
| 0.4271 | 0.428 |
| 0.4272 | 0.428 |
| 0.4273 | 0.428 |
| 0.4274 | 0.428 |
| 0.4275 | 0.428 |
| 0.4276 | 0.428 |
| 0.4277 | 0.428 |
| 0.4278 | 0.428 |
| 0.4279 | 0.428 |
| 0.428 | 0.428 |
| 0.4281 | 0.429 |
| 0.4282 | 0.429 |
| 0.4283 | 0.429 |
| 0.4284 | 0.429 |
| 0.4285 | 0.429 |
| 0.4286 | 0.429 |
| 0.4287 | 0.429 |
| 0.4288 | 0.429 |
| 0.4289 | 0.429 |
| 0.429 | 0.429 |
| 0.4291 | 0.43 |
| 0.4292 | 0.43 |
| 0.4293 | 0.43 |
| 0.4294 | 0.43 |
| 0.4295 | 0.43 |
| 0.4296 | 0.43 |
| 0.4297 | 0.43 |
| 0.4298 | 0.43 |
| 0.4299 | 0.43 |
| 0.43 | 0.43 |
| 0.4301 | 0.431 |
| 0.4302 | 0.431 |
| 0.4303 | 0.431 |
| 0.4304 | 0.431 |
| 0.4305 | 0.431 |
| 0.4306 | 0.431 |
| 0.4307 | 0.431 |
| 0.4308 | 0.431 |
| 0.4309 | 0.431 |
| 0.431 | 0.431 |
| 0.4311 | 0.432 |
| 0.4312 | 0.432 |
| 0.4313 | 0.432 |
| 0.4314 | 0.432 |
| 0.4315 | 0.432 |
| 0.4316 | 0.432 |
| 0.4317 | 0.432 |
| 0.4318 | 0.432 |
| 0.4319 | 0.432 |
| 0.432 | 0.432 |
| 0.4321 | 0.433 |
| 0.4322 | 0.433 |
| 0.4323 | 0.433 |
| 0.4324 | 0.433 |
| 0.4325 | 0.433 |
| 0.4326 | 0.433 |
| 0.4327 | 0.433 |
| 0.4328 | 0.433 |
| 0.4329 | 0.433 |
| 0.433 | 0.433 |
| 0.4331 | 0.434 |
| 0.4332 | 0.434 |
| 0.4333 | 0.434 |
| 0.4334 | 0.434 |
| 0.4335 | 0.434 |
| 0.4336 | 0.434 |
| 0.4337 | 0.434 |
| 0.4338 | 0.434 |
| 0.4339 | 0.434 |
| 0.434 | 0.434 |
| 0.4341 | 0.435 |
| 0.4342 | 0.435 |
| 0.4343 | 0.435 |
| 0.4344 | 0.435 |
| 0.4345 | 0.435 |
| 0.4346 | 0.435 |
| 0.4347 | 0.435 |
| 0.4348 | 0.435 |
| 0.4349 | 0.435 |
| 0.435 | 0.435 |
| 0.4351 | 0.436 |
| 0.4352 | 0.436 |
| 0.4353 | 0.436 |
| 0.4354 | 0.436 |
| 0.4355 | 0.436 |
| 0.4356 | 0.436 |
| 0.4357 | 0.436 |
| 0.4358 | 0.436 |
| 0.4359 | 0.436 |
| 0.436 | 0.436 |
| 0.4361 | 0.437 |
| 0.4362 | 0.437 |
| 0.4363 | 0.437 |
| 0.4364 | 0.437 |
| 0.4365 | 0.437 |
| 0.4366 | 0.437 |
| 0.4367 | 0.437 |
| 0.4368 | 0.437 |
| 0.4369 | 0.437 |
| 0.437 | 0.437 |
| 0.4371 | 0.438 |
| 0.4372 | 0.438 |
| 0.4373 | 0.438 |
| 0.4374 | 0.438 |
| 0.4375 | 0.438 |
| 0.4376 | 0.438 |
| 0.4377 | 0.438 |
| 0.4378 | 0.438 |
| 0.4379 | 0.438 |
| 0.438 | 0.438 |
| 0.4381 | 0.439 |
| 0.4382 | 0.439 |
| 0.4383 | 0.439 |
| 0.4384 | 0.439 |
| 0.4385 | 0.439 |
| 0.4386 | 0.439 |
| 0.4387 | 0.439 |
| 0.4388 | 0.439 |
| 0.4389 | 0.439 |
| 0.439 | 0.439 |
| 0.4391 | 0.44 |
| 0.4392 | 0.44 |
| 0.4393 | 0.44 |
| 0.4394 | 0.44 |
| 0.4395 | 0.44 |
| 0.4396 | 0.44 |
| 0.4397 | 0.44 |
| 0.4398 | 0.44 |
| 0.4399 | 0.44 |
| 0.44 | 0.44 |
| 0.4401 | 0.441 |
| 0.4402 | 0.441 |
| 0.4403 | 0.441 |
| 0.4404 | 0.441 |
| 0.4405 | 0.441 |
| 0.4406 | 0.441 |
| 0.4407 | 0.441 |
| 0.4408 | 0.441 |
| 0.4409 | 0.441 |
| 0.441 | 0.441 |
| 0.4411 | 0.442 |
| 0.4412 | 0.442 |
| 0.4413 | 0.442 |
| 0.4414 | 0.442 |
| 0.4415 | 0.442 |
| 0.4416 | 0.442 |
| 0.4417 | 0.442 |
| 0.4418 | 0.442 |
| 0.4419 | 0.442 |
| 0.442 | 0.442 |
| 0.4421 | 0.443 |
| 0.4422 | 0.443 |
| 0.4423 | 0.443 |
| 0.4424 | 0.443 |
| 0.4425 | 0.443 |
| 0.4426 | 0.443 |
| 0.4427 | 0.443 |
| 0.4428 | 0.443 |
| 0.4429 | 0.443 |
| 0.443 | 0.444 |
| 0.4431 | 0.444 |
| 0.4432 | 0.444 |
| 0.4433 | 0.444 |
| 0.4434 | 0.444 |
| 0.4435 | 0.444 |
| 0.4436 | 0.444 |
| 0.4437 | 0.444 |
| 0.4438 | 0.444 |
| 0.4439 | 0.444 |
| 0.444 | 0.444 |
| 0.4441 | 0.445 |
| 0.4442 | 0.445 |
| 0.4443 | 0.445 |
| 0.4444 | 0.445 |
| 0.4445 | 0.445 |
| 0.4446 | 0.445 |
| 0.4447 | 0.445 |
| 0.4448 | 0.445 |
| 0.4449 | 0.445 |
| 0.445 | 0.445 |
| 0.4451 | 0.446 |
| 0.4452 | 0.446 |
| 0.4453 | 0.446 |
| 0.4454 | 0.446 |
| 0.4455 | 0.446 |
| 0.4456 | 0.446 |
| 0.4457 | 0.446 |
| 0.4458 | 0.446 |
| 0.4459 | 0.446 |
| 0.446 | 0.446 |
| 0.4461 | 0.447 |
| 0.4462 | 0.447 |
| 0.4463 | 0.447 |
| 0.4464 | 0.447 |
| 0.4465 | 0.447 |
| 0.4466 | 0.447 |
| 0.4467 | 0.447 |
| 0.4468 | 0.447 |
| 0.4469 | 0.447 |
| 0.447 | 0.447 |
| 0.4471 | 0.448 |
| 0.4472 | 0.448 |
| 0.4473 | 0.448 |
| 0.4474 | 0.448 |
| 0.4475 | 0.448 |
| 0.4476 | 0.448 |
| 0.4477 | 0.448 |
| 0.4478 | 0.448 |
| 0.4479 | 0.448 |
| 0.448 | 0.448 |
| 0.4481 | 0.449 |
| 0.4482 | 0.449 |
| 0.4483 | 0.449 |
| 0.4484 | 0.449 |
| 0.4485 | 0.449 |
| 0.4486 | 0.449 |
| 0.4487 | 0.449 |
| 0.4488 | 0.449 |
| 0.4489 | 0.449 |
| 0.449 | 0.449 |
| 0.4491 | 0.45 |
| 0.4492 | 0.45 |
| 0.4493 | 0.45 |
| 0.4494 | 0.45 |
| 0.4495 | 0.45 |
| 0.4496 | 0.45 |
| 0.4497 | 0.45 |
| 0.4498 | 0.45 |
| 0.4499 | 0.45 |
| 0.45 | 0.45 |
| 0.4501 | 0.451 |
| 0.4502 | 0.451 |
| 0.4503 | 0.451 |
| 0.4504 | 0.451 |
| 0.4505 | 0.451 |
| 0.4506 | 0.451 |
| 0.4507 | 0.451 |
| 0.4508 | 0.451 |
| 0.4509 | 0.451 |
| 0.451 | 0.452 |
| 0.4511 | 0.452 |
| 0.4512 | 0.452 |
| 0.4513 | 0.452 |
| 0.4514 | 0.452 |
| 0.4515 | 0.452 |
| 0.4516 | 0.452 |
| 0.4517 | 0.452 |
| 0.4518 | 0.452 |
| 0.4519 | 0.452 |
| 0.452 | 0.452 |
| 0.4521 | 0.453 |
| 0.4522 | 0.453 |
| 0.4523 | 0.453 |
| 0.4524 | 0.453 |
| 0.4525 | 0.453 |
| 0.4526 | 0.453 |
| 0.4527 | 0.453 |
| 0.4528 | 0.453 |
| 0.4529 | 0.453 |
| 0.453 | 0.453 |
| 0.4531 | 0.454 |
| 0.4532 | 0.454 |
| 0.4533 | 0.454 |
| 0.4534 | 0.454 |
| 0.4535 | 0.454 |
| 0.4536 | 0.454 |
| 0.4537 | 0.454 |
| 0.4538 | 0.454 |
| 0.4539 | 0.454 |
| 0.454 | 0.454 |
| 0.4541 | 0.455 |
| 0.4542 | 0.455 |
| 0.4543 | 0.455 |
| 0.4544 | 0.455 |
| 0.4545 | 0.455 |
| 0.4546 | 0.455 |
| 0.4547 | 0.455 |
| 0.4548 | 0.455 |
| 0.4549 | 0.455 |
| 0.455 | 0.455 |
| 0.4551 | 0.456 |
| 0.4552 | 0.456 |
| 0.4553 | 0.456 |
| 0.4554 | 0.456 |
| 0.4555 | 0.456 |
| 0.4556 | 0.456 |
| 0.4557 | 0.456 |
| 0.4558 | 0.456 |
| 0.4559 | 0.456 |
| 0.456 | 0.456 |
| 0.4561 | 0.457 |
| 0.4562 | 0.457 |
| 0.4563 | 0.457 |
| 0.4564 | 0.457 |
| 0.4565 | 0.457 |
| 0.4566 | 0.457 |
| 0.4567 | 0.457 |
| 0.4568 | 0.457 |
| 0.4569 | 0.457 |
| 0.457 | 0.457 |
| 0.4571 | 0.458 |
| 0.4572 | 0.458 |
| 0.4573 | 0.458 |
| 0.4574 | 0.458 |
| 0.4575 | 0.458 |
| 0.4576 | 0.458 |
| 0.4577 | 0.458 |
| 0.4578 | 0.458 |
| 0.4579 | 0.458 |
| 0.458 | 0.458 |
| 0.4581 | 0.459 |
| 0.4582 | 0.459 |
| 0.4583 | 0.459 |
| 0.4584 | 0.459 |
| 0.4585 | 0.459 |
| 0.4586 | 0.459 |
| 0.4587 | 0.459 |
| 0.4588 | 0.459 |
| 0.4589 | 0.459 |
| 0.459 | 0.459 |
| 0.4591 | 0.46 |
| 0.4592 | 0.46 |
| 0.4593 | 0.46 |
| 0.4594 | 0.46 |
| 0.4595 | 0.46 |
| 0.4596 | 0.46 |
| 0.4597 | 0.46 |
| 0.4598 | 0.46 |
| 0.4599 | 0.46 |
| 0.46 | 0.46 |
| 0.4601 | 0.461 |
| 0.4602 | 0.461 |
| 0.4603 | 0.461 |
| 0.4604 | 0.461 |
| 0.4605 | 0.461 |
| 0.4606 | 0.461 |
| 0.4607 | 0.461 |
| 0.4608 | 0.461 |
| 0.4609 | 0.461 |
| 0.461 | 0.462 |
| 0.4611 | 0.462 |
| 0.4612 | 0.462 |
| 0.4613 | 0.462 |
| 0.4614 | 0.462 |
| 0.4615 | 0.462 |
| 0.4616 | 0.462 |
| 0.4617 | 0.462 |
| 0.4618 | 0.462 |
| 0.4619 | 0.462 |
| 0.462 | 0.462 |
| 0.4621 | 0.463 |
| 0.4622 | 0.463 |
| 0.4623 | 0.463 |
| 0.4624 | 0.463 |
| 0.4625 | 0.463 |
| 0.4626 | 0.463 |
| 0.4627 | 0.463 |
| 0.4628 | 0.463 |
| 0.4629 | 0.463 |
| 0.463 | 0.463 |
| 0.4631 | 0.464 |
| 0.4632 | 0.464 |
| 0.4633 | 0.464 |
| 0.4634 | 0.464 |
| 0.4635 | 0.464 |
| 0.4636 | 0.464 |
| 0.4637 | 0.464 |
| 0.4638 | 0.464 |
| 0.4639 | 0.464 |
| 0.464 | 0.464 |
| 0.4641 | 0.465 |
| 0.4642 | 0.465 |
| 0.4643 | 0.465 |
| 0.4644 | 0.465 |
| 0.4645 | 0.465 |
| 0.4646 | 0.465 |
| 0.4647 | 0.465 |
| 0.4648 | 0.465 |
| 0.4649 | 0.465 |
| 0.465 | 0.465 |
| 0.4651 | 0.466 |
| 0.4652 | 0.466 |
| 0.4653 | 0.466 |
| 0.4654 | 0.466 |
| 0.4655 | 0.466 |
| 0.4656 | 0.466 |
| 0.4657 | 0.466 |
| 0.4658 | 0.466 |
| 0.4659 | 0.466 |
| 0.466 | 0.467 |
| 0.4661 | 0.467 |
| 0.4662 | 0.467 |
| 0.4663 | 0.467 |
| 0.4664 | 0.467 |
| 0.4665 | 0.467 |
| 0.4666 | 0.467 |
| 0.4667 | 0.467 |
| 0.4668 | 0.467 |
| 0.4669 | 0.467 |
| 0.467 | 0.467 |
| 0.4671 | 0.468 |
| 0.4672 | 0.468 |
| 0.4673 | 0.468 |
| 0.4674 | 0.468 |
| 0.4675 | 0.468 |
| 0.4676 | 0.468 |
| 0.4677 | 0.468 |
| 0.4678 | 0.468 |
| 0.4679 | 0.468 |
| 0.468 | 0.468 |
| 0.4681 | 0.469 |
| 0.4682 | 0.469 |
| 0.4683 | 0.469 |
| 0.4684 | 0.469 |
| 0.4685 | 0.469 |
| 0.4686 | 0.469 |
| 0.4687 | 0.469 |
| 0.4688 | 0.469 |
| 0.4689 | 0.469 |
| 0.469 | 0.469 |
| 0.4691 | 0.47 |
| 0.4692 | 0.47 |
| 0.4693 | 0.47 |
| 0.4694 | 0.47 |
| 0.4695 | 0.47 |
| 0.4696 | 0.47 |
| 0.4697 | 0.47 |
| 0.4698 | 0.47 |
| 0.4699 | 0.47 |
| 0.47 | 0.47 |
| 0.4701 | 0.471 |
| 0.4702 | 0.471 |
| 0.4703 | 0.471 |
| 0.4704 | 0.471 |
| 0.4705 | 0.471 |
| 0.4706 | 0.471 |
| 0.4707 | 0.471 |
| 0.4708 | 0.471 |
| 0.4709 | 0.471 |
| 0.471 | 0.471 |
| 0.4711 | 0.472 |
| 0.4712 | 0.472 |
| 0.4713 | 0.472 |
| 0.4714 | 0.472 |
| 0.4715 | 0.472 |
| 0.4716 | 0.472 |
| 0.4717 | 0.472 |
| 0.4718 | 0.472 |
| 0.4719 | 0.472 |
| 0.472 | 0.472 |
| 0.4721 | 0.473 |
| 0.4722 | 0.473 |
| 0.4723 | 0.473 |
| 0.4724 | 0.473 |
| 0.4725 | 0.473 |
| 0.4726 | 0.473 |
| 0.4727 | 0.473 |
| 0.4728 | 0.473 |
| 0.4729 | 0.473 |
| 0.473 | 0.473 |
| 0.4731 | 0.474 |
| 0.4732 | 0.474 |
| 0.4733 | 0.474 |
| 0.4734 | 0.474 |
| 0.4735 | 0.474 |
| 0.4736 | 0.474 |
| 0.4737 | 0.474 |
| 0.4738 | 0.474 |
| 0.4739 | 0.474 |
| 0.474 | 0.474 |
| 0.4741 | 0.475 |
| 0.4742 | 0.475 |
| 0.4743 | 0.475 |
| 0.4744 | 0.475 |
| 0.4745 | 0.475 |
| 0.4746 | 0.475 |
| 0.4747 | 0.475 |
| 0.4748 | 0.475 |
| 0.4749 | 0.475 |
| 0.475 | 0.475 |
| 0.4751 | 0.476 |
| 0.4752 | 0.476 |
| 0.4753 | 0.476 |
| 0.4754 | 0.476 |
| 0.4755 | 0.476 |
| 0.4756 | 0.476 |
| 0.4757 | 0.476 |
| 0.4758 | 0.476 |
| 0.4759 | 0.476 |
| 0.476 | 0.476 |
| 0.4761 | 0.477 |
| 0.4762 | 0.477 |
| 0.4763 | 0.477 |
| 0.4764 | 0.477 |
| 0.4765 | 0.477 |
| 0.4766 | 0.477 |
| 0.4767 | 0.477 |
| 0.4768 | 0.477 |
| 0.4769 | 0.477 |
| 0.477 | 0.478 |
| 0.4771 | 0.478 |
| 0.4772 | 0.478 |
| 0.4773 | 0.478 |
| 0.4774 | 0.478 |
| 0.4775 | 0.478 |
| 0.4776 | 0.478 |
| 0.4777 | 0.478 |
| 0.4778 | 0.478 |
| 0.4779 | 0.478 |
| 0.478 | 0.478 |
| 0.4781 | 0.479 |
| 0.4782 | 0.479 |
| 0.4783 | 0.479 |
| 0.4784 | 0.479 |
| 0.4785 | 0.479 |
| 0.4786 | 0.479 |
| 0.4787 | 0.479 |
| 0.4788 | 0.479 |
| 0.4789 | 0.479 |
| 0.479 | 0.479 |
| 0.4791 | 0.48 |
| 0.4792 | 0.48 |
| 0.4793 | 0.48 |
| 0.4794 | 0.48 |
| 0.4795 | 0.48 |
| 0.4796 | 0.48 |
| 0.4797 | 0.48 |
| 0.4798 | 0.48 |
| 0.4799 | 0.48 |
| 0.48 | 0.48 |
| 0.4801 | 0.481 |
| 0.4802 | 0.481 |
| 0.4803 | 0.481 |
| 0.4804 | 0.481 |
| 0.4805 | 0.481 |
| 0.4806 | 0.481 |
| 0.4807 | 0.481 |
| 0.4808 | 0.481 |
| 0.4809 | 0.481 |
| 0.481 | 0.481 |
| 0.4811 | 0.482 |
| 0.4812 | 0.482 |
| 0.4813 | 0.482 |
| 0.4814 | 0.482 |
| 0.4815 | 0.482 |
| 0.4816 | 0.482 |
| 0.4817 | 0.482 |
| 0.4818 | 0.482 |
| 0.4819 | 0.482 |
| 0.482 | 0.482 |
| 0.4821 | 0.483 |
| 0.4822 | 0.483 |
| 0.4823 | 0.483 |
| 0.4824 | 0.483 |
| 0.4825 | 0.483 |
| 0.4826 | 0.483 |
| 0.4827 | 0.483 |
| 0.4828 | 0.483 |
| 0.4829 | 0.483 |
| 0.483 | 0.483 |
| 0.4831 | 0.484 |
| 0.4832 | 0.484 |
| 0.4833 | 0.484 |
| 0.4834 | 0.484 |
| 0.4835 | 0.484 |
| 0.4836 | 0.484 |
| 0.4837 | 0.484 |
| 0.4838 | 0.484 |
| 0.4839 | 0.484 |
| 0.484 | 0.484 |
| 0.4841 | 0.485 |
| 0.4842 | 0.485 |
| 0.4843 | 0.485 |
| 0.4844 | 0.485 |
| 0.4845 | 0.485 |
| 0.4846 | 0.485 |
| 0.4847 | 0.485 |
| 0.4848 | 0.485 |
| 0.4849 | 0.485 |
| 0.485 | 0.485 |
| 0.4851 | 0.486 |
| 0.4852 | 0.486 |
| 0.4853 | 0.486 |
| 0.4854 | 0.486 |
| 0.4855 | 0.486 |
| 0.4856 | 0.486 |
| 0.4857 | 0.486 |
| 0.4858 | 0.486 |
| 0.4859 | 0.486 |
| 0.486 | 0.487 |
| 0.4861 | 0.487 |
| 0.4862 | 0.487 |
| 0.4863 | 0.487 |
| 0.4864 | 0.487 |
| 0.4865 | 0.487 |
| 0.4866 | 0.487 |
| 0.4867 | 0.487 |
| 0.4868 | 0.487 |
| 0.4869 | 0.487 |
| 0.487 | 0.488 |
| 0.4871 | 0.488 |
| 0.4872 | 0.488 |
| 0.4873 | 0.488 |
| 0.4874 | 0.488 |
| 0.4875 | 0.488 |
| 0.4876 | 0.488 |
| 0.4877 | 0.488 |
| 0.4878 | 0.488 |
| 0.4879 | 0.488 |
| 0.488 | 0.488 |
| 0.4881 | 0.489 |
| 0.4882 | 0.489 |
| 0.4883 | 0.489 |
| 0.4884 | 0.489 |
| 0.4885 | 0.489 |
| 0.4886 | 0.489 |
| 0.4887 | 0.489 |
| 0.4888 | 0.489 |
| 0.4889 | 0.489 |
| 0.489 | 0.49 |
| 0.4891 | 0.49 |
| 0.4892 | 0.49 |
| 0.4893 | 0.49 |
| 0.4894 | 0.49 |
| 0.4895 | 0.49 |
| 0.4896 | 0.49 |
| 0.4897 | 0.49 |
| 0.4898 | 0.49 |
| 0.4899 | 0.49 |
| 0.49 | 0.49 |
| 0.4901 | 0.491 |
| 0.4902 | 0.491 |
| 0.4903 | 0.491 |
| 0.4904 | 0.491 |
| 0.4905 | 0.491 |
| 0.4906 | 0.491 |
| 0.4907 | 0.491 |
| 0.4908 | 0.491 |
| 0.4909 | 0.491 |
| 0.491 | 0.491 |
| 0.4911 | 0.492 |
| 0.4912 | 0.492 |
| 0.4913 | 0.492 |
| 0.4914 | 0.492 |
| 0.4915 | 0.492 |
| 0.4916 | 0.492 |
| 0.4917 | 0.492 |
| 0.4918 | 0.492 |
| 0.4919 | 0.492 |
| 0.492 | 0.492 |
| 0.4921 | 0.493 |
| 0.4922 | 0.493 |
| 0.4923 | 0.493 |
| 0.4924 | 0.493 |
| 0.4925 | 0.493 |
| 0.4926 | 0.493 |
| 0.4927 | 0.493 |
| 0.4928 | 0.493 |
| 0.4929 | 0.493 |
| 0.493 | 0.493 |
| 0.4931 | 0.494 |
| 0.4932 | 0.494 |
| 0.4933 | 0.494 |
| 0.4934 | 0.494 |
| 0.4935 | 0.494 |
| 0.4936 | 0.494 |
| 0.4937 | 0.494 |
| 0.4938 | 0.494 |
| 0.4939 | 0.494 |
| 0.494 | 0.494 |
| 0.4941 | 0.495 |
| 0.4942 | 0.495 |
| 0.4943 | 0.495 |
| 0.4944 | 0.495 |
| 0.4945 | 0.495 |
| 0.4946 | 0.495 |
| 0.4947 | 0.495 |
| 0.4948 | 0.495 |
| 0.4949 | 0.495 |
| 0.495 | 0.495 |
| 0.4951 | 0.496 |
| 0.4952 | 0.496 |
| 0.4953 | 0.496 |
| 0.4954 | 0.496 |
| 0.4955 | 0.496 |
| 0.4956 | 0.496 |
| 0.4957 | 0.496 |
| 0.4958 | 0.496 |
| 0.4959 | 0.496 |
| 0.496 | 0.496 |
| 0.4961 | 0.497 |
| 0.4962 | 0.497 |
| 0.4963 | 0.497 |
| 0.4964 | 0.497 |
| 0.4965 | 0.497 |
| 0.4966 | 0.497 |
| 0.4967 | 0.497 |
| 0.4968 | 0.497 |
| 0.4969 | 0.497 |
| 0.497 | 0.497 |
| 0.4971 | 0.498 |
| 0.4972 | 0.498 |
| 0.4973 | 0.498 |
| 0.4974 | 0.498 |
| 0.4975 | 0.498 |
| 0.4976 | 0.498 |
| 0.4977 | 0.498 |
| 0.4978 | 0.498 |
| 0.4979 | 0.498 |
| 0.498 | 0.498 |
| 0.4981 | 0.499 |
| 0.4982 | 0.499 |
| 0.4983 | 0.499 |
| 0.4984 | 0.499 |
| 0.4985 | 0.499 |
| 0.4986 | 0.499 |
| 0.4987 | 0.499 |
| 0.4988 | 0.499 |
| 0.4989 | 0.499 |
| 0.499 | 0.499 |
| 0.4991 | 0.5 |
| 0.4992 | 0.5 |
| 0.4993 | 0.5 |
| 0.4994 | 0.5 |
| 0.4995 | 0.5 |
| 0.4996 | 0.5 |
| 0.4997 | 0.5 |
| 0.4998 | 0.5 |
| 0.4999 | 0.5 |
| 0.5 | 0.5 |
| 0.5001 | 0.501 |
| 0.5002 | 0.501 |
| 0.5003 | 0.501 |
| 0.5004 | 0.501 |
| 0.5005 | 0.501 |
| 0.5006 | 0.501 |
| 0.5007 | 0.501 |
| 0.5008 | 0.501 |
| 0.5009 | 0.501 |
| 0.501 | 0.501 |
| 0.5011 | 0.502 |
| 0.5012 | 0.502 |
| 0.5013 | 0.502 |
| 0.5014 | 0.502 |
| 0.5015 | 0.502 |
| 0.5016 | 0.502 |
| 0.5017 | 0.502 |
| 0.5018 | 0.502 |
| 0.5019 | 0.502 |
| 0.502 | 0.502 |
| 0.5021 | 0.503 |
| 0.5022 | 0.503 |
| 0.5023 | 0.503 |
| 0.5024 | 0.503 |
| 0.5025 | 0.503 |
| 0.5026 | 0.503 |
| 0.5027 | 0.503 |
| 0.5028 | 0.503 |
| 0.5029 | 0.503 |
| 0.503 | 0.504 |
| 0.5031 | 0.504 |
| 0.5032 | 0.504 |
| 0.5033 | 0.504 |
| 0.5034 | 0.504 |
| 0.5035 | 0.504 |
| 0.5036 | 0.504 |
| 0.5037 | 0.504 |
| 0.5038 | 0.504 |
| 0.5039 | 0.504 |
| 0.504 | 0.504 |
| 0.5041 | 0.505 |
| 0.5042 | 0.505 |
| 0.5043 | 0.505 |
| 0.5044 | 0.505 |
| 0.5045 | 0.505 |
| 0.5046 | 0.505 |
| 0.5047 | 0.505 |
| 0.5048 | 0.505 |
| 0.5049 | 0.505 |
| 0.505 | 0.506 |
| 0.5051 | 0.506 |
| 0.5052 | 0.506 |
| 0.5053 | 0.506 |
| 0.5054 | 0.506 |
| 0.5055 | 0.506 |
| 0.5056 | 0.506 |
| 0.5057 | 0.506 |
| 0.5058 | 0.506 |
| 0.5059 | 0.506 |
| 0.506 | 0.507 |
| 0.5061 | 0.507 |
| 0.5062 | 0.507 |
| 0.5063 | 0.507 |
| 0.5064 | 0.507 |
| 0.5065 | 0.507 |
| 0.5066 | 0.507 |
| 0.5067 | 0.507 |
| 0.5068 | 0.507 |
| 0.5069 | 0.507 |
| 0.507 | 0.508 |
| 0.5071 | 0.508 |
| 0.5072 | 0.508 |
| 0.5073 | 0.508 |
| 0.5074 | 0.508 |
| 0.5075 | 0.508 |
| 0.5076 | 0.508 |
| 0.5077 | 0.508 |
| 0.5078 | 0.508 |
| 0.5079 | 0.508 |
| 0.508 | 0.509 |
| 0.5081 | 0.509 |
| 0.5082 | 0.509 |
| 0.5083 | 0.509 |
| 0.5084 | 0.509 |
| 0.5085 | 0.509 |
| 0.5086 | 0.509 |
| 0.5087 | 0.509 |
| 0.5088 | 0.509 |
| 0.5089 | 0.509 |
| 0.509 | 0.51 |
| 0.5091 | 0.51 |
| 0.5092 | 0.51 |
| 0.5093 | 0.51 |
| 0.5094 | 0.51 |
| 0.5095 | 0.51 |
| 0.5096 | 0.51 |
| 0.5097 | 0.51 |
| 0.5098 | 0.51 |
| 0.5099 | 0.51 |
| 0.51 | 0.511 |
| 0.5101 | 0.511 |
| 0.5102 | 0.511 |
| 0.5103 | 0.511 |
| 0.5104 | 0.511 |
| 0.5105 | 0.511 |
| 0.5106 | 0.511 |
| 0.5107 | 0.511 |
| 0.5108 | 0.511 |
| 0.5109 | 0.511 |
| 0.511 | 0.512 |
| 0.5111 | 0.512 |
| 0.5112 | 0.512 |
| 0.5113 | 0.512 |
| 0.5114 | 0.512 |
| 0.5115 | 0.512 |
| 0.5116 | 0.512 |
| 0.5117 | 0.512 |
| 0.5118 | 0.512 |
| 0.5119 | 0.512 |
| 0.512 | 0.512 |
| 0.5121 | 0.513 |
| 0.5122 | 0.513 |
| 0.5123 | 0.513 |
| 0.5124 | 0.513 |
| 0.5125 | 0.513 |
| 0.5126 | 0.513 |
| 0.5127 | 0.513 |
| 0.5128 | 0.513 |
| 0.5129 | 0.513 |
| 0.513 | 0.513 |
| 0.5131 | 0.514 |
| 0.5132 | 0.514 |
| 0.5133 | 0.514 |
| 0.5134 | 0.514 |
| 0.5135 | 0.514 |
| 0.5136 | 0.514 |
| 0.5137 | 0.514 |
| 0.5138 | 0.514 |
| 0.5139 | 0.514 |
| 0.514 | 0.514 |
| 0.5141 | 0.515 |
| 0.5142 | 0.515 |
| 0.5143 | 0.515 |
| 0.5144 | 0.515 |
| 0.5145 | 0.515 |
| 0.5146 | 0.515 |
| 0.5147 | 0.515 |
| 0.5148 | 0.515 |
| 0.5149 | 0.515 |
| 0.515 | 0.515 |
| 0.5151 | 0.516 |
| 0.5152 | 0.516 |
| 0.5153 | 0.516 |
| 0.5154 | 0.516 |
| 0.5155 | 0.516 |
| 0.5156 | 0.516 |
| 0.5157 | 0.516 |
| 0.5158 | 0.516 |
| 0.5159 | 0.516 |
| 0.516 | 0.516 |
| 0.5161 | 0.517 |
| 0.5162 | 0.517 |
| 0.5163 | 0.517 |
| 0.5164 | 0.517 |
| 0.5165 | 0.517 |
| 0.5166 | 0.517 |
| 0.5167 | 0.517 |
| 0.5168 | 0.517 |
| 0.5169 | 0.517 |
| 0.517 | 0.517 |
| 0.5171 | 0.518 |
| 0.5172 | 0.518 |
| 0.5173 | 0.518 |
| 0.5174 | 0.518 |
| 0.5175 | 0.518 |
| 0.5176 | 0.518 |
| 0.5177 | 0.518 |
| 0.5178 | 0.518 |
| 0.5179 | 0.518 |
| 0.518 | 0.519 |
| 0.5181 | 0.519 |
| 0.5182 | 0.519 |
| 0.5183 | 0.519 |
| 0.5184 | 0.519 |
| 0.5185 | 0.519 |
| 0.5186 | 0.519 |
| 0.5187 | 0.519 |
| 0.5188 | 0.519 |
| 0.5189 | 0.519 |
| 0.519 | 0.519 |
| 0.5191 | 0.52 |
| 0.5192 | 0.52 |
| 0.5193 | 0.52 |
| 0.5194 | 0.52 |
| 0.5195 | 0.52 |
| 0.5196 | 0.52 |
| 0.5197 | 0.52 |
| 0.5198 | 0.52 |
| 0.5199 | 0.52 |
| 0.52 | 0.52 |
| 0.5201 | 0.521 |
| 0.5202 | 0.521 |
| 0.5203 | 0.521 |
| 0.5204 | 0.521 |
| 0.5205 | 0.521 |
| 0.5206 | 0.521 |
| 0.5207 | 0.521 |
| 0.5208 | 0.521 |
| 0.5209 | 0.521 |
| 0.521 | 0.521 |
| 0.5211 | 0.522 |
| 0.5212 | 0.522 |
| 0.5213 | 0.522 |
| 0.5214 | 0.522 |
| 0.5215 | 0.522 |
| 0.5216 | 0.522 |
| 0.5217 | 0.522 |
| 0.5218 | 0.522 |
| 0.5219 | 0.522 |
| 0.522 | 0.522 |
| 0.5221 | 0.523 |
| 0.5222 | 0.523 |
| 0.5223 | 0.523 |
| 0.5224 | 0.523 |
| 0.5225 | 0.523 |
| 0.5226 | 0.523 |
| 0.5227 | 0.523 |
| 0.5228 | 0.523 |
| 0.5229 | 0.523 |
| 0.523 | 0.524 |
| 0.5231 | 0.524 |
| 0.5232 | 0.524 |
| 0.5233 | 0.524 |
| 0.5234 | 0.524 |
| 0.5235 | 0.524 |
| 0.5236 | 0.524 |
| 0.5237 | 0.524 |
| 0.5238 | 0.524 |
| 0.5239 | 0.524 |
| 0.524 | 0.524 |
| 0.5241 | 0.525 |
| 0.5242 | 0.525 |
| 0.5243 | 0.525 |
| 0.5244 | 0.525 |
| 0.5245 | 0.525 |
| 0.5246 | 0.525 |
| 0.5247 | 0.525 |
| 0.5248 | 0.525 |
| 0.5249 | 0.525 |
| 0.525 | 0.526 |
| 0.5251 | 0.526 |
| 0.5252 | 0.526 |
| 0.5253 | 0.526 |
| 0.5254 | 0.526 |
| 0.5255 | 0.526 |
| 0.5256 | 0.526 |
| 0.5257 | 0.526 |
| 0.5258 | 0.526 |
| 0.5259 | 0.526 |
| 0.526 | 0.527 |
| 0.5261 | 0.527 |
| 0.5262 | 0.527 |
| 0.5263 | 0.527 |
| 0.5264 | 0.527 |
| 0.5265 | 0.527 |
| 0.5266 | 0.527 |
| 0.5267 | 0.527 |
| 0.5268 | 0.527 |
| 0.5269 | 0.527 |
| 0.527 | 0.528 |
| 0.5271 | 0.528 |
| 0.5272 | 0.528 |
| 0.5273 | 0.528 |
| 0.5274 | 0.528 |
| 0.5275 | 0.528 |
| 0.5276 | 0.528 |
| 0.5277 | 0.528 |
| 0.5278 | 0.528 |
| 0.5279 | 0.528 |
| 0.528 | 0.529 |
| 0.5281 | 0.529 |
| 0.5282 | 0.529 |
| 0.5283 | 0.529 |
| 0.5284 | 0.529 |
| 0.5285 | 0.529 |
| 0.5286 | 0.529 |
| 0.5287 | 0.529 |
| 0.5288 | 0.529 |
| 0.5289 | 0.529 |
| 0.529 | 0.53 |
| 0.5291 | 0.53 |
| 0.5292 | 0.53 |
| 0.5293 | 0.53 |
| 0.5294 | 0.53 |
| 0.5295 | 0.53 |
| 0.5296 | 0.53 |
| 0.5297 | 0.53 |
| 0.5298 | 0.53 |
| 0.5299 | 0.53 |
| 0.53 | 0.53 |
| 0.5301 | 0.531 |
| 0.5302 | 0.531 |
| 0.5303 | 0.531 |
| 0.5304 | 0.531 |
| 0.5305 | 0.531 |
| 0.5306 | 0.531 |
| 0.5307 | 0.531 |
| 0.5308 | 0.531 |
| 0.5309 | 0.531 |
| 0.531 | 0.531 |
| 0.5311 | 0.532 |
| 0.5312 | 0.532 |
| 0.5313 | 0.532 |
| 0.5314 | 0.532 |
| 0.5315 | 0.532 |
| 0.5316 | 0.532 |
| 0.5317 | 0.532 |
| 0.5318 | 0.532 |
| 0.5319 | 0.532 |
| 0.532 | 0.533 |
| 0.5321 | 0.533 |
| 0.5322 | 0.533 |
| 0.5323 | 0.533 |
| 0.5324 | 0.533 |
| 0.5325 | 0.533 |
| 0.5326 | 0.533 |
| 0.5327 | 0.533 |
| 0.5328 | 0.533 |
| 0.5329 | 0.533 |
| 0.533 | 0.534 |
| 0.5331 | 0.534 |
| 0.5332 | 0.534 |
| 0.5333 | 0.534 |
| 0.5334 | 0.534 |
| 0.5335 | 0.534 |
| 0.5336 | 0.534 |
| 0.5337 | 0.534 |
| 0.5338 | 0.534 |
| 0.5339 | 0.534 |
| 0.534 | 0.534 |
| 0.5341 | 0.535 |
| 0.5342 | 0.535 |
| 0.5343 | 0.535 |
| 0.5344 | 0.535 |
| 0.5345 | 0.535 |
| 0.5346 | 0.535 |
| 0.5347 | 0.535 |
| 0.5348 | 0.535 |
| 0.5349 | 0.535 |
| 0.535 | 0.536 |
| 0.5351 | 0.536 |
| 0.5352 | 0.536 |
| 0.5353 | 0.536 |
| 0.5354 | 0.536 |
| 0.5355 | 0.536 |
| 0.5356 | 0.536 |
| 0.5357 | 0.536 |
| 0.5358 | 0.536 |
| 0.5359 | 0.536 |
| 0.536 | 0.537 |
| 0.5361 | 0.537 |
| 0.5362 | 0.537 |
| 0.5363 | 0.537 |
| 0.5364 | 0.537 |
| 0.5365 | 0.537 |
| 0.5366 | 0.537 |
| 0.5367 | 0.537 |
| 0.5368 | 0.537 |
| 0.5369 | 0.537 |
| 0.537 | 0.538 |
| 0.5371 | 0.538 |
| 0.5372 | 0.538 |
| 0.5373 | 0.538 |
| 0.5374 | 0.538 |
| 0.5375 | 0.538 |
| 0.5376 | 0.538 |
| 0.5377 | 0.538 |
| 0.5378 | 0.538 |
| 0.5379 | 0.538 |
| 0.538 | 0.538 |
| 0.5381 | 0.539 |
| 0.5382 | 0.539 |
| 0.5383 | 0.539 |
| 0.5384 | 0.539 |
| 0.5385 | 0.539 |
| 0.5386 | 0.539 |
| 0.5387 | 0.539 |
| 0.5388 | 0.539 |
| 0.5389 | 0.539 |
| 0.539 | 0.539 |
| 0.5391 | 0.54 |
| 0.5392 | 0.54 |
| 0.5393 | 0.54 |
| 0.5394 | 0.54 |
| 0.5395 | 0.54 |
| 0.5396 | 0.54 |
| 0.5397 | 0.54 |
| 0.5398 | 0.54 |
| 0.5399 | 0.54 |
| 0.54 | 0.54 |
| 0.5401 | 0.541 |
| 0.5402 | 0.541 |
| 0.5403 | 0.541 |
| 0.5404 | 0.541 |
| 0.5405 | 0.541 |
| 0.5406 | 0.541 |
| 0.5407 | 0.541 |
| 0.5408 | 0.541 |
| 0.5409 | 0.541 |
| 0.541 | 0.541 |
| 0.5411 | 0.542 |
| 0.5412 | 0.542 |
| 0.5413 | 0.542 |
| 0.5414 | 0.542 |
| 0.5415 | 0.542 |
| 0.5416 | 0.542 |
| 0.5417 | 0.542 |
| 0.5418 | 0.542 |
| 0.5419 | 0.542 |
| 0.542 | 0.543 |
| 0.5421 | 0.543 |
| 0.5422 | 0.543 |
| 0.5423 | 0.543 |
| 0.5424 | 0.543 |
| 0.5425 | 0.543 |
| 0.5426 | 0.543 |
| 0.5427 | 0.543 |
| 0.5428 | 0.543 |
| 0.5429 | 0.543 |
| 0.543 | 0.543 |
| 0.5431 | 0.544 |
| 0.5432 | 0.544 |
| 0.5433 | 0.544 |
| 0.5434 | 0.544 |
| 0.5435 | 0.544 |
| 0.5436 | 0.544 |
| 0.5437 | 0.544 |
| 0.5438 | 0.544 |
| 0.5439 | 0.544 |
| 0.544 | 0.544 |
| 0.5441 | 0.545 |
| 0.5442 | 0.545 |
| 0.5443 | 0.545 |
| 0.5444 | 0.545 |
| 0.5445 | 0.545 |
| 0.5446 | 0.545 |
| 0.5447 | 0.545 |
| 0.5448 | 0.545 |
| 0.5449 | 0.545 |
| 0.545 | 0.546 |
| 0.5451 | 0.546 |
| 0.5452 | 0.546 |
| 0.5453 | 0.546 |
| 0.5454 | 0.546 |
| 0.5455 | 0.546 |
| 0.5456 | 0.546 |
| 0.5457 | 0.546 |
| 0.5458 | 0.546 |
| 0.5459 | 0.546 |
| 0.546 | 0.547 |
| 0.5461 | 0.547 |
| 0.5462 | 0.547 |
| 0.5463 | 0.547 |
| 0.5464 | 0.547 |
| 0.5465 | 0.547 |
| 0.5466 | 0.547 |
| 0.5467 | 0.547 |
| 0.5468 | 0.547 |
| 0.5469 | 0.547 |
| 0.547 | 0.548 |
| 0.5471 | 0.548 |
| 0.5472 | 0.548 |
| 0.5473 | 0.548 |
| 0.5474 | 0.548 |
| 0.5475 | 0.548 |
| 0.5476 | 0.548 |
| 0.5477 | 0.548 |
| 0.5478 | 0.548 |
| 0.5479 | 0.548 |
| 0.548 | 0.548 |
| 0.5481 | 0.549 |
| 0.5482 | 0.549 |
| 0.5483 | 0.549 |
| 0.5484 | 0.549 |
| 0.5485 | 0.549 |
| 0.5486 | 0.549 |
| 0.5487 | 0.549 |
| 0.5488 | 0.549 |
| 0.5489 | 0.549 |
| 0.549 | 0.55 |
| 0.5491 | 0.55 |
| 0.5492 | 0.55 |
| 0.5493 | 0.55 |
| 0.5494 | 0.55 |
| 0.5495 | 0.55 |
| 0.5496 | 0.55 |
| 0.5497 | 0.55 |
| 0.5498 | 0.55 |
| 0.5499 | 0.55 |
| 0.55 | 0.55 |
| 0.5501 | 0.551 |
| 0.5502 | 0.551 |
| 0.5503 | 0.551 |
| 0.5504 | 0.551 |
| 0.5505 | 0.551 |
| 0.5506 | 0.551 |
| 0.5507 | 0.551 |
| 0.5508 | 0.551 |
| 0.5509 | 0.551 |
| 0.551 | 0.551 |
| 0.5511 | 0.552 |
| 0.5512 | 0.552 |
| 0.5513 | 0.552 |
| 0.5514 | 0.552 |
| 0.5515 | 0.552 |
| 0.5516 | 0.552 |
| 0.5517 | 0.552 |
| 0.5518 | 0.552 |
| 0.5519 | 0.552 |
| 0.552 | 0.553 |
| 0.5521 | 0.553 |
| 0.5522 | 0.553 |
| 0.5523 | 0.553 |
| 0.5524 | 0.553 |
| 0.5525 | 0.553 |
| 0.5526 | 0.553 |
| 0.5527 | 0.553 |
| 0.5528 | 0.553 |
| 0.5529 | 0.553 |
| 0.553 | 0.554 |
| 0.5531 | 0.554 |
| 0.5532 | 0.554 |
| 0.5533 | 0.554 |
| 0.5534 | 0.554 |
| 0.5535 | 0.554 |
| 0.5536 | 0.554 |
| 0.5537 | 0.554 |
| 0.5538 | 0.554 |
| 0.5539 | 0.554 |
| 0.554 | 0.554 |
| 0.5541 | 0.555 |
| 0.5542 | 0.555 |
| 0.5543 | 0.555 |
| 0.5544 | 0.555 |
| 0.5545 | 0.555 |
| 0.5546 | 0.555 |
| 0.5547 | 0.555 |
| 0.5548 | 0.555 |
| 0.5549 | 0.555 |
| 0.555 | 0.555 |
| 0.5551 | 0.556 |
| 0.5552 | 0.556 |
| 0.5553 | 0.556 |
| 0.5554 | 0.556 |
| 0.5555 | 0.556 |
| 0.5556 | 0.556 |
| 0.5557 | 0.556 |
| 0.5558 | 0.556 |
| 0.5559 | 0.556 |
| 0.556 | 0.556 |
| 0.5561 | 0.557 |
| 0.5562 | 0.557 |
| 0.5563 | 0.557 |
| 0.5564 | 0.557 |
| 0.5565 | 0.557 |
| 0.5566 | 0.557 |
| 0.5567 | 0.557 |
| 0.5568 | 0.557 |
| 0.5569 | 0.557 |
| 0.557 | 0.557 |
| 0.5571 | 0.558 |
| 0.5572 | 0.558 |
| 0.5573 | 0.558 |
| 0.5574 | 0.558 |
| 0.5575 | 0.558 |
| 0.5576 | 0.558 |
| 0.5577 | 0.558 |
| 0.5578 | 0.558 |
| 0.5579 | 0.558 |
| 0.558 | 0.559 |
| 0.5581 | 0.559 |
| 0.5582 | 0.559 |
| 0.5583 | 0.559 |
| 0.5584 | 0.559 |
| 0.5585 | 0.559 |
| 0.5586 | 0.559 |
| 0.5587 | 0.559 |
| 0.5588 | 0.559 |
| 0.5589 | 0.559 |
| 0.559 | 0.559 |
| 0.5591 | 0.56 |
| 0.5592 | 0.56 |
| 0.5593 | 0.56 |
| 0.5594 | 0.56 |
| 0.5595 | 0.56 |
| 0.5596 | 0.56 |
| 0.5597 | 0.56 |
| 0.5598 | 0.56 |
| 0.5599 | 0.56 |
| 0.56 | 0.56 |
| 0.5601 | 0.561 |
| 0.5602 | 0.561 |
| 0.5603 | 0.561 |
| 0.5604 | 0.561 |
| 0.5605 | 0.561 |
| 0.5606 | 0.561 |
| 0.5607 | 0.561 |
| 0.5608 | 0.561 |
| 0.5609 | 0.561 |
| 0.561 | 0.562 |
| 0.5611 | 0.562 |
| 0.5612 | 0.562 |
| 0.5613 | 0.562 |
| 0.5614 | 0.562 |
| 0.5615 | 0.562 |
| 0.5616 | 0.562 |
| 0.5617 | 0.562 |
| 0.5618 | 0.562 |
| 0.5619 | 0.562 |
| 0.562 | 0.562 |
| 0.5621 | 0.563 |
| 0.5622 | 0.563 |
| 0.5623 | 0.563 |
| 0.5624 | 0.563 |
| 0.5625 | 0.563 |
| 0.5626 | 0.563 |
| 0.5627 | 0.563 |
| 0.5628 | 0.563 |
| 0.5629 | 0.563 |
| 0.563 | 0.564 |
| 0.5631 | 0.564 |
| 0.5632 | 0.564 |
| 0.5633 | 0.564 |
| 0.5634 | 0.564 |
| 0.5635 | 0.564 |
| 0.5636 | 0.564 |
| 0.5637 | 0.564 |
| 0.5638 | 0.564 |
| 0.5639 | 0.564 |
| 0.564 | 0.564 |
| 0.5641 | 0.565 |
| 0.5642 | 0.565 |
| 0.5643 | 0.565 |
| 0.5644 | 0.565 |
| 0.5645 | 0.565 |
| 0.5646 | 0.565 |
| 0.5647 | 0.565 |
| 0.5648 | 0.565 |
| 0.5649 | 0.565 |
| 0.565 | 0.565 |
| 0.5651 | 0.566 |
| 0.5652 | 0.566 |
| 0.5653 | 0.566 |
| 0.5654 | 0.566 |
| 0.5655 | 0.566 |
| 0.5656 | 0.566 |
| 0.5657 | 0.566 |
| 0.5658 | 0.566 |
| 0.5659 | 0.566 |
| 0.566 | 0.567 |
| 0.5661 | 0.567 |
| 0.5662 | 0.567 |
| 0.5663 | 0.567 |
| 0.5664 | 0.567 |
| 0.5665 | 0.567 |
| 0.5666 | 0.567 |
| 0.5667 | 0.567 |
| 0.5668 | 0.567 |
| 0.5669 | 0.567 |
| 0.567 | 0.567 |
| 0.5671 | 0.568 |
| 0.5672 | 0.568 |
| 0.5673 | 0.568 |
| 0.5674 | 0.568 |
| 0.5675 | 0.568 |
| 0.5676 | 0.568 |
| 0.5677 | 0.568 |
| 0.5678 | 0.568 |
| 0.5679 | 0.568 |
| 0.568 | 0.569 |
| 0.5681 | 0.569 |
| 0.5682 | 0.569 |
| 0.5683 | 0.569 |
| 0.5684 | 0.569 |
| 0.5685 | 0.569 |
| 0.5686 | 0.569 |
| 0.5687 | 0.569 |
| 0.5688 | 0.569 |
| 0.5689 | 0.569 |
| 0.569 | 0.569 |
| 0.5691 | 0.57 |
| 0.5692 | 0.57 |
| 0.5693 | 0.57 |
| 0.5694 | 0.57 |
| 0.5695 | 0.57 |
| 0.5696 | 0.57 |
| 0.5697 | 0.57 |
| 0.5698 | 0.57 |
| 0.5699 | 0.57 |
| 0.57 | 0.571 |
| 0.5701 | 0.571 |
| 0.5702 | 0.571 |
| 0.5703 | 0.571 |
| 0.5704 | 0.571 |
| 0.5705 | 0.571 |
| 0.5706 | 0.571 |
| 0.5707 | 0.571 |
| 0.5708 | 0.571 |
| 0.5709 | 0.571 |
| 0.571 | 0.571 |
| 0.5711 | 0.572 |
| 0.5712 | 0.572 |
| 0.5713 | 0.572 |
| 0.5714 | 0.572 |
| 0.5715 | 0.572 |
| 0.5716 | 0.572 |
| 0.5717 | 0.572 |
| 0.5718 | 0.572 |
| 0.5719 | 0.572 |
| 0.572 | 0.573 |
| 0.5721 | 0.573 |
| 0.5722 | 0.573 |
| 0.5723 | 0.573 |
| 0.5724 | 0.573 |
| 0.5725 | 0.573 |
| 0.5726 | 0.573 |
| 0.5727 | 0.573 |
| 0.5728 | 0.573 |
| 0.5729 | 0.573 |
| 0.573 | 0.573 |
| 0.5731 | 0.574 |
| 0.5732 | 0.574 |
| 0.5733 | 0.574 |
| 0.5734 | 0.574 |
| 0.5735 | 0.574 |
| 0.5736 | 0.574 |
| 0.5737 | 0.574 |
| 0.5738 | 0.574 |
| 0.5739 | 0.574 |
| 0.574 | 0.574 |
| 0.5741 | 0.575 |
| 0.5742 | 0.575 |
| 0.5743 | 0.575 |
| 0.5744 | 0.575 |
| 0.5745 | 0.575 |
| 0.5746 | 0.575 |
| 0.5747 | 0.575 |
| 0.5748 | 0.575 |
| 0.5749 | 0.575 |
| 0.575 | 0.576 |
| 0.5751 | 0.576 |
| 0.5752 | 0.576 |
| 0.5753 | 0.576 |
| 0.5754 | 0.576 |
| 0.5755 | 0.576 |
| 0.5756 | 0.576 |
| 0.5757 | 0.576 |
| 0.5758 | 0.576 |
| 0.5759 | 0.576 |
| 0.576 | 0.577 |
| 0.5761 | 0.577 |
| 0.5762 | 0.577 |
| 0.5763 | 0.577 |
| 0.5764 | 0.577 |
| 0.5765 | 0.577 |
| 0.5766 | 0.577 |
| 0.5767 | 0.577 |
| 0.5768 | 0.577 |
| 0.5769 | 0.577 |
| 0.577 | 0.577 |
| 0.5771 | 0.578 |
| 0.5772 | 0.578 |
| 0.5773 | 0.578 |
| 0.5774 | 0.578 |
| 0.5775 | 0.578 |
| 0.5776 | 0.578 |
| 0.5777 | 0.578 |
| 0.5778 | 0.578 |
| 0.5779 | 0.578 |
| 0.578 | 0.578 |
| 0.5781 | 0.579 |
| 0.5782 | 0.579 |
| 0.5783 | 0.579 |
| 0.5784 | 0.579 |
| 0.5785 | 0.579 |
| 0.5786 | 0.579 |
| 0.5787 | 0.579 |
| 0.5788 | 0.579 |
| 0.5789 | 0.579 |
| 0.579 | 0.58 |
| 0.5791 | 0.58 |
| 0.5792 | 0.58 |
| 0.5793 | 0.58 |
| 0.5794 | 0.58 |
| 0.5795 | 0.58 |
| 0.5796 | 0.58 |
| 0.5797 | 0.58 |
| 0.5798 | 0.58 |
| 0.5799 | 0.58 |
| 0.58 | 0.58 |
| 0.5801 | 0.581 |
| 0.5802 | 0.581 |
| 0.5803 | 0.581 |
| 0.5804 | 0.581 |
| 0.5805 | 0.581 |
| 0.5806 | 0.581 |
| 0.5807 | 0.581 |
| 0.5808 | 0.581 |
| 0.5809 | 0.581 |
| 0.581 | 0.582 |
| 0.5811 | 0.582 |
| 0.5812 | 0.582 |
| 0.5813 | 0.582 |
| 0.5814 | 0.582 |
| 0.5815 | 0.582 |
| 0.5816 | 0.582 |
| 0.5817 | 0.582 |
| 0.5818 | 0.582 |
| 0.5819 | 0.582 |
| 0.582 | 0.583 |
| 0.5821 | 0.583 |
| 0.5822 | 0.583 |
| 0.5823 | 0.583 |
| 0.5824 | 0.583 |
| 0.5825 | 0.583 |
| 0.5826 | 0.583 |
| 0.5827 | 0.583 |
| 0.5828 | 0.583 |
| 0.5829 | 0.583 |
| 0.583 | 0.583 |
| 0.5831 | 0.584 |
| 0.5832 | 0.584 |
| 0.5833 | 0.584 |
| 0.5834 | 0.584 |
| 0.5835 | 0.584 |
| 0.5836 | 0.584 |
| 0.5837 | 0.584 |
| 0.5838 | 0.584 |
| 0.5839 | 0.584 |
| 0.584 | 0.585 |
| 0.5841 | 0.585 |
| 0.5842 | 0.585 |
| 0.5843 | 0.585 |
| 0.5844 | 0.585 |
| 0.5845 | 0.585 |
| 0.5846 | 0.585 |
| 0.5847 | 0.585 |
| 0.5848 | 0.585 |
| 0.5849 | 0.585 |
| 0.585 | 0.586 |
| 0.5851 | 0.586 |
| 0.5852 | 0.586 |
| 0.5853 | 0.586 |
| 0.5854 | 0.586 |
| 0.5855 | 0.586 |
| 0.5856 | 0.586 |
| 0.5857 | 0.586 |
| 0.5858 | 0.586 |
| 0.5859 | 0.586 |
| 0.586 | 0.587 |
| 0.5861 | 0.587 |
| 0.5862 | 0.587 |
| 0.5863 | 0.587 |
| 0.5864 | 0.587 |
| 0.5865 | 0.587 |
| 0.5866 | 0.587 |
| 0.5867 | 0.587 |
| 0.5868 | 0.587 |
| 0.5869 | 0.587 |
| 0.587 | 0.587 |
| 0.5871 | 0.588 |
| 0.5872 | 0.588 |
| 0.5873 | 0.588 |
| 0.5874 | 0.588 |
| 0.5875 | 0.588 |
| 0.5876 | 0.588 |
| 0.5877 | 0.588 |
| 0.5878 | 0.588 |
| 0.5879 | 0.588 |
| 0.588 | 0.589 |
| 0.5881 | 0.589 |
| 0.5882 | 0.589 |
| 0.5883 | 0.589 |
| 0.5884 | 0.589 |
| 0.5885 | 0.589 |
| 0.5886 | 0.589 |
| 0.5887 | 0.589 |
| 0.5888 | 0.589 |
| 0.5889 | 0.589 |
| 0.589 | 0.589 |
| 0.5891 | 0.59 |
| 0.5892 | 0.59 |
| 0.5893 | 0.59 |
| 0.5894 | 0.59 |
| 0.5895 | 0.59 |
| 0.5896 | 0.59 |
| 0.5897 | 0.59 |
| 0.5898 | 0.59 |
| 0.5899 | 0.59 |
| 0.59 | 0.59 |
| 0.5901 | 0.591 |
| 0.5902 | 0.591 |
| 0.5903 | 0.591 |
| 0.5904 | 0.591 |
| 0.5905 | 0.591 |
| 0.5906 | 0.591 |
| 0.5907 | 0.591 |
| 0.5908 | 0.591 |
| 0.5909 | 0.591 |
| 0.591 | 0.591 |
| 0.5911 | 0.592 |
| 0.5912 | 0.592 |
| 0.5913 | 0.592 |
| 0.5914 | 0.592 |
| 0.5915 | 0.592 |
| 0.5916 | 0.592 |
| 0.5917 | 0.592 |
| 0.5918 | 0.592 |
| 0.5919 | 0.592 |
| 0.592 | 0.592 |
| 0.5921 | 0.593 |
| 0.5922 | 0.593 |
| 0.5923 | 0.593 |
| 0.5924 | 0.593 |
| 0.5925 | 0.593 |
| 0.5926 | 0.593 |
| 0.5927 | 0.593 |
| 0.5928 | 0.593 |
| 0.5929 | 0.593 |
| 0.593 | 0.594 |
| 0.5931 | 0.594 |
| 0.5932 | 0.594 |
| 0.5933 | 0.594 |
| 0.5934 | 0.594 |
| 0.5935 | 0.594 |
| 0.5936 | 0.594 |
| 0.5937 | 0.594 |
| 0.5938 | 0.594 |
| 0.5939 | 0.594 |
| 0.594 | 0.594 |
| 0.5941 | 0.595 |
| 0.5942 | 0.595 |
| 0.5943 | 0.595 |
| 0.5944 | 0.595 |
| 0.5945 | 0.595 |
| 0.5946 | 0.595 |
| 0.5947 | 0.595 |
| 0.5948 | 0.595 |
| 0.5949 | 0.595 |
| 0.595 | 0.596 |
| 0.5951 | 0.596 |
| 0.5952 | 0.596 |
| 0.5953 | 0.596 |
| 0.5954 | 0.596 |
| 0.5955 | 0.596 |
| 0.5956 | 0.596 |
| 0.5957 | 0.596 |
| 0.5958 | 0.596 |
| 0.5959 | 0.596 |
| 0.596 | 0.596 |
| 0.5961 | 0.597 |
| 0.5962 | 0.597 |
| 0.5963 | 0.597 |
| 0.5964 | 0.597 |
| 0.5965 | 0.597 |
| 0.5966 | 0.597 |
| 0.5967 | 0.597 |
| 0.5968 | 0.597 |
| 0.5969 | 0.597 |
| 0.597 | 0.597 |
| 0.5971 | 0.598 |
| 0.5972 | 0.598 |
| 0.5973 | 0.598 |
| 0.5974 | 0.598 |
| 0.5975 | 0.598 |
| 0.5976 | 0.598 |
| 0.5977 | 0.598 |
| 0.5978 | 0.598 |
| 0.5979 | 0.598 |
| 0.598 | 0.598 |
| 0.5981 | 0.599 |
| 0.5982 | 0.599 |
| 0.5983 | 0.599 |
| 0.5984 | 0.599 |
| 0.5985 | 0.599 |
| 0.5986 | 0.599 |
| 0.5987 | 0.599 |
| 0.5988 | 0.599 |
| 0.5989 | 0.599 |
| 0.599 | 0.599 |
| 0.5991 | 0.6 |
| 0.5992 | 0.6 |
| 0.5993 | 0.6 |
| 0.5994 | 0.6 |
| 0.5995 | 0.6 |
| 0.5996 | 0.6 |
| 0.5997 | 0.6 |
| 0.5998 | 0.6 |
| 0.5999 | 0.6 |
| 0.6 | 0.6 |
| 0.6001 | 0.601 |
| 0.6002 | 0.601 |
| 0.6003 | 0.601 |
| 0.6004 | 0.601 |
| 0.6005 | 0.601 |
| 0.6006 | 0.601 |
| 0.6007 | 0.601 |
| 0.6008 | 0.601 |
| 0.6009 | 0.601 |
| 0.601 | 0.601 |
| 0.6011 | 0.602 |
| 0.6012 | 0.602 |
| 0.6013 | 0.602 |
| 0.6014 | 0.602 |
| 0.6015 | 0.602 |
| 0.6016 | 0.602 |
| 0.6017 | 0.602 |
| 0.6018 | 0.602 |
| 0.6019 | 0.602 |
| 0.602 | 0.602 |
| 0.6021 | 0.603 |
| 0.6022 | 0.603 |
| 0.6023 | 0.603 |
| 0.6024 | 0.603 |
| 0.6025 | 0.603 |
| 0.6026 | 0.603 |
| 0.6027 | 0.603 |
| 0.6028 | 0.603 |
| 0.6029 | 0.603 |
| 0.603 | 0.603 |
| 0.6031 | 0.604 |
| 0.6032 | 0.604 |
| 0.6033 | 0.604 |
| 0.6034 | 0.604 |
| 0.6035 | 0.604 |
| 0.6036 | 0.604 |
| 0.6037 | 0.604 |
| 0.6038 | 0.604 |
| 0.6039 | 0.604 |
| 0.604 | 0.604 |
| 0.6041 | 0.605 |
| 0.6042 | 0.605 |
| 0.6043 | 0.605 |
| 0.6044 | 0.605 |
| 0.6045 | 0.605 |
| 0.6046 | 0.605 |
| 0.6047 | 0.605 |
| 0.6048 | 0.605 |
| 0.6049 | 0.605 |
| 0.605 | 0.606 |
| 0.6051 | 0.606 |
| 0.6052 | 0.606 |
| 0.6053 | 0.606 |
| 0.6054 | 0.606 |
| 0.6055 | 0.606 |
| 0.6056 | 0.606 |
| 0.6057 | 0.606 |
| 0.6058 | 0.606 |
| 0.6059 | 0.606 |
| 0.606 | 0.607 |
| 0.6061 | 0.607 |
| 0.6062 | 0.607 |
| 0.6063 | 0.607 |
| 0.6064 | 0.607 |
| 0.6065 | 0.607 |
| 0.6066 | 0.607 |
| 0.6067 | 0.607 |
| 0.6068 | 0.607 |
| 0.6069 | 0.607 |
| 0.607 | 0.608 |
| 0.6071 | 0.608 |
| 0.6072 | 0.608 |
| 0.6073 | 0.608 |
| 0.6074 | 0.608 |
| 0.6075 | 0.608 |
| 0.6076 | 0.608 |
| 0.6077 | 0.608 |
| 0.6078 | 0.608 |
| 0.6079 | 0.608 |
| 0.608 | 0.608 |
| 0.6081 | 0.609 |
| 0.6082 | 0.609 |
| 0.6083 | 0.609 |
| 0.6084 | 0.609 |
| 0.6085 | 0.609 |
| 0.6086 | 0.609 |
| 0.6087 | 0.609 |
| 0.6088 | 0.609 |
| 0.6089 | 0.609 |
| 0.609 | 0.609 |
| 0.6091 | 0.61 |
| 0.6092 | 0.61 |
| 0.6093 | 0.61 |
| 0.6094 | 0.61 |
| 0.6095 | 0.61 |
| 0.6096 | 0.61 |
| 0.6097 | 0.61 |
| 0.6098 | 0.61 |
| 0.6099 | 0.61 |
| 0.61 | 0.61 |
| 0.6101 | 0.611 |
| 0.6102 | 0.611 |
| 0.6103 | 0.611 |
| 0.6104 | 0.611 |
| 0.6105 | 0.611 |
| 0.6106 | 0.611 |
| 0.6107 | 0.611 |
| 0.6108 | 0.611 |
| 0.6109 | 0.611 |
| 0.611 | 0.611 |
| 0.6111 | 0.612 |
| 0.6112 | 0.612 |
| 0.6113 | 0.612 |
| 0.6114 | 0.612 |
| 0.6115 | 0.612 |
| 0.6116 | 0.612 |
| 0.6117 | 0.612 |
| 0.6118 | 0.612 |
| 0.6119 | 0.612 |
| 0.612 | 0.612 |
| 0.6121 | 0.613 |
| 0.6122 | 0.613 |
| 0.6123 | 0.613 |
| 0.6124 | 0.613 |
| 0.6125 | 0.613 |
| 0.6126 | 0.613 |
| 0.6127 | 0.613 |
| 0.6128 | 0.613 |
| 0.6129 | 0.613 |
| 0.613 | 0.614 |
| 0.6131 | 0.614 |
| 0.6132 | 0.614 |
| 0.6133 | 0.614 |
| 0.6134 | 0.614 |
| 0.6135 | 0.614 |
| 0.6136 | 0.614 |
| 0.6137 | 0.614 |
| 0.6138 | 0.614 |
| 0.6139 | 0.614 |
| 0.614 | 0.614 |
| 0.6141 | 0.615 |
| 0.6142 | 0.615 |
| 0.6143 | 0.615 |
| 0.6144 | 0.615 |
| 0.6145 | 0.615 |
| 0.6146 | 0.615 |
| 0.6147 | 0.615 |
| 0.6148 | 0.615 |
| 0.6149 | 0.615 |
| 0.615 | 0.615 |
| 0.6151 | 0.616 |
| 0.6152 | 0.616 |
| 0.6153 | 0.616 |
| 0.6154 | 0.616 |
| 0.6155 | 0.616 |
| 0.6156 | 0.616 |
| 0.6157 | 0.616 |
| 0.6158 | 0.616 |
| 0.6159 | 0.616 |
| 0.616 | 0.616 |
| 0.6161 | 0.617 |
| 0.6162 | 0.617 |
| 0.6163 | 0.617 |
| 0.6164 | 0.617 |
| 0.6165 | 0.617 |
| 0.6166 | 0.617 |
| 0.6167 | 0.617 |
| 0.6168 | 0.617 |
| 0.6169 | 0.617 |
| 0.617 | 0.617 |
| 0.6171 | 0.618 |
| 0.6172 | 0.618 |
| 0.6173 | 0.618 |
| 0.6174 | 0.618 |
| 0.6175 | 0.618 |
| 0.6176 | 0.618 |
| 0.6177 | 0.618 |
| 0.6178 | 0.618 |
| 0.6179 | 0.618 |
| 0.618 | 0.618 |
| 0.6181 | 0.619 |
| 0.6182 | 0.619 |
| 0.6183 | 0.619 |
| 0.6184 | 0.619 |
| 0.6185 | 0.619 |
| 0.6186 | 0.619 |
| 0.6187 | 0.619 |
| 0.6188 | 0.619 |
| 0.6189 | 0.619 |
| 0.619 | 0.619 |
| 0.6191 | 0.62 |
| 0.6192 | 0.62 |
| 0.6193 | 0.62 |
| 0.6194 | 0.62 |
| 0.6195 | 0.62 |
| 0.6196 | 0.62 |
| 0.6197 | 0.62 |
| 0.6198 | 0.62 |
| 0.6199 | 0.62 |
| 0.62 | 0.62 |
| 0.6201 | 0.621 |
| 0.6202 | 0.621 |
| 0.6203 | 0.621 |
| 0.6204 | 0.621 |
| 0.6205 | 0.621 |
| 0.6206 | 0.621 |
| 0.6207 | 0.621 |
| 0.6208 | 0.621 |
| 0.6209 | 0.621 |
| 0.621 | 0.621 |
| 0.6211 | 0.622 |
| 0.6212 | 0.622 |
| 0.6213 | 0.622 |
| 0.6214 | 0.622 |
| 0.6215 | 0.622 |
| 0.6216 | 0.622 |
| 0.6217 | 0.622 |
| 0.6218 | 0.622 |
| 0.6219 | 0.622 |
| 0.622 | 0.622 |
| 0.6221 | 0.623 |
| 0.6222 | 0.623 |
| 0.6223 | 0.623 |
| 0.6224 | 0.623 |
| 0.6225 | 0.623 |
| 0.6226 | 0.623 |
| 0.6227 | 0.623 |
| 0.6228 | 0.623 |
| 0.6229 | 0.623 |
| 0.623 | 0.623 |
| 0.6231 | 0.624 |
| 0.6232 | 0.624 |
| 0.6233 | 0.624 |
| 0.6234 | 0.624 |
| 0.6235 | 0.624 |
| 0.6236 | 0.624 |
| 0.6237 | 0.624 |
| 0.6238 | 0.624 |
| 0.6239 | 0.624 |
| 0.624 | 0.624 |
| 0.6241 | 0.625 |
| 0.6242 | 0.625 |
| 0.6243 | 0.625 |
| 0.6244 | 0.625 |
| 0.6245 | 0.625 |
| 0.6246 | 0.625 |
| 0.6247 | 0.625 |
| 0.6248 | 0.625 |
| 0.6249 | 0.625 |
| 0.625 | 0.626 |
| 0.6251 | 0.626 |
| 0.6252 | 0.626 |
| 0.6253 | 0.626 |
| 0.6254 | 0.626 |
| 0.6255 | 0.626 |
| 0.6256 | 0.626 |
| 0.6257 | 0.626 |
| 0.6258 | 0.626 |
| 0.6259 | 0.626 |
| 0.626 | 0.627 |
| 0.6261 | 0.627 |
| 0.6262 | 0.627 |
| 0.6263 | 0.627 |
| 0.6264 | 0.627 |
| 0.6265 | 0.627 |
| 0.6266 | 0.627 |
| 0.6267 | 0.627 |
| 0.6268 | 0.627 |
| 0.6269 | 0.627 |
| 0.627 | 0.627 |
| 0.6271 | 0.628 |
| 0.6272 | 0.628 |
| 0.6273 | 0.628 |
| 0.6274 | 0.628 |
| 0.6275 | 0.628 |
| 0.6276 | 0.628 |
| 0.6277 | 0.628 |
| 0.6278 | 0.628 |
| 0.6279 | 0.628 |
| 0.628 | 0.628 |
| 0.6281 | 0.629 |
| 0.6282 | 0.629 |
| 0.6283 | 0.629 |
| 0.6284 | 0.629 |
| 0.6285 | 0.629 |
| 0.6286 | 0.629 |
| 0.6287 | 0.629 |
| 0.6288 | 0.629 |
| 0.6289 | 0.629 |
| 0.629 | 0.629 |
| 0.6291 | 0.629 |
| 0.6292 | 0.63 |
| 0.6293 | 0.63 |
| 0.6294 | 0.63 |
| 0.6295 | 0.63 |
| 0.6296 | 0.63 |
| 0.6297 | 0.63 |
| 0.6298 | 0.63 |
| 0.6299 | 0.63 |
| 0.63 | 0.63 |
| 0.6301 | 0.631 |
| 0.6302 | 0.631 |
| 0.6303 | 0.631 |
| 0.6304 | 0.631 |
| 0.6305 | 0.631 |
| 0.6306 | 0.631 |
| 0.6307 | 0.631 |
| 0.6308 | 0.631 |
| 0.6309 | 0.631 |
| 0.631 | 0.631 |
| 0.6311 | 0.632 |
| 0.6312 | 0.632 |
| 0.6313 | 0.632 |
| 0.6314 | 0.632 |
| 0.6315 | 0.632 |
| 0.6316 | 0.632 |
| 0.6317 | 0.632 |
| 0.6318 | 0.632 |
| 0.6319 | 0.632 |
| 0.632 | 0.632 |
| 0.6321 | 0.632 |
| 0.6322 | 0.633 |
| 0.6323 | 0.633 |
| 0.6324 | 0.633 |
| 0.6325 | 0.633 |
| 0.6326 | 0.633 |
| 0.6327 | 0.633 |
| 0.6328 | 0.633 |
| 0.6329 | 0.633 |
| 0.633 | 0.633 |
| 0.6331 | 0.634 |
| 0.6332 | 0.634 |
| 0.6333 | 0.634 |
| 0.6334 | 0.634 |
| 0.6335 | 0.634 |
| 0.6336 | 0.634 |
| 0.6337 | 0.634 |
| 0.6338 | 0.634 |
| 0.6339 | 0.634 |
| 0.634 | 0.635 |
| 0.6341 | 0.635 |
| 0.6342 | 0.635 |
| 0.6343 | 0.635 |
| 0.6344 | 0.635 |
| 0.6345 | 0.635 |
| 0.6346 | 0.635 |
| 0.6347 | 0.635 |
| 0.6348 | 0.635 |
| 0.6349 | 0.635 |
| 0.635 | 0.635 |
| 0.6351 | 0.636 |
| 0.6352 | 0.636 |
| 0.6353 | 0.636 |
| 0.6354 | 0.636 |
| 0.6355 | 0.636 |
| 0.6356 | 0.636 |
| 0.6357 | 0.636 |
| 0.6358 | 0.636 |
| 0.6359 | 0.636 |
| 0.636 | 0.636 |
| 0.6361 | 0.637 |
| 0.6362 | 0.637 |
| 0.6363 | 0.637 |
| 0.6364 | 0.637 |
| 0.6365 | 0.637 |
| 0.6366 | 0.637 |
| 0.6367 | 0.637 |
| 0.6368 | 0.637 |
| 0.6369 | 0.637 |
| 0.637 | 0.638 |
| 0.6371 | 0.638 |
| 0.6372 | 0.638 |
| 0.6373 | 0.638 |
| 0.6374 | 0.638 |
| 0.6375 | 0.638 |
| 0.6376 | 0.638 |
| 0.6377 | 0.638 |
| 0.6378 | 0.638 |
| 0.6379 | 0.638 |
| 0.638 | 0.638 |
| 0.6381 | 0.639 |
| 0.6382 | 0.639 |
| 0.6383 | 0.639 |
| 0.6384 | 0.639 |
| 0.6385 | 0.639 |
| 0.6386 | 0.639 |
| 0.6387 | 0.639 |
| 0.6388 | 0.639 |
| 0.6389 | 0.639 |
| 0.639 | 0.639 |
| 0.6391 | 0.64 |
| 0.6392 | 0.64 |
| 0.6393 | 0.64 |
| 0.6394 | 0.64 |
| 0.6395 | 0.64 |
| 0.6396 | 0.64 |
| 0.6397 | 0.64 |
| 0.6398 | 0.64 |
| 0.6399 | 0.64 |
| 0.64 | 0.641 |
| 0.6401 | 0.641 |
| 0.6402 | 0.641 |
| 0.6403 | 0.641 |
| 0.6404 | 0.641 |
| 0.6405 | 0.641 |
| 0.6406 | 0.641 |
| 0.6407 | 0.641 |
| 0.6408 | 0.641 |
| 0.6409 | 0.641 |
| 0.641 | 0.642 |
| 0.6411 | 0.642 |
| 0.6412 | 0.642 |
| 0.6413 | 0.642 |
| 0.6414 | 0.642 |
| 0.6415 | 0.642 |
| 0.6416 | 0.642 |
| 0.6417 | 0.642 |
| 0.6418 | 0.642 |
| 0.6419 | 0.642 |
| 0.642 | 0.642 |
| 0.6421 | 0.643 |
| 0.6422 | 0.643 |
| 0.6423 | 0.643 |
| 0.6424 | 0.643 |
| 0.6425 | 0.643 |
| 0.6426 | 0.643 |
| 0.6427 | 0.643 |
| 0.6428 | 0.643 |
| 0.6429 | 0.643 |
| 0.643 | 0.643 |
| 0.6431 | 0.644 |
| 0.6432 | 0.644 |
| 0.6433 | 0.644 |
| 0.6434 | 0.644 |
| 0.6435 | 0.644 |
| 0.6436 | 0.644 |
| 0.6437 | 0.644 |
| 0.6438 | 0.644 |
| 0.6439 | 0.644 |
| 0.644 | 0.644 |
| 0.6441 | 0.645 |
| 0.6442 | 0.645 |
| 0.6443 | 0.645 |
| 0.6444 | 0.645 |
| 0.6445 | 0.645 |
| 0.6446 | 0.645 |
| 0.6447 | 0.645 |
| 0.6448 | 0.645 |
| 0.6449 | 0.645 |
| 0.645 | 0.645 |
| 0.6451 | 0.646 |
| 0.6452 | 0.646 |
| 0.6453 | 0.646 |
| 0.6454 | 0.646 |
| 0.6455 | 0.646 |
| 0.6456 | 0.646 |
| 0.6457 | 0.646 |
| 0.6458 | 0.646 |
| 0.6459 | 0.646 |
| 0.646 | 0.646 |
| 0.6461 | 0.647 |
| 0.6462 | 0.647 |
| 0.6463 | 0.647 |
| 0.6464 | 0.647 |
| 0.6465 | 0.647 |
| 0.6466 | 0.647 |
| 0.6467 | 0.647 |
| 0.6468 | 0.647 |
| 0.6469 | 0.647 |
| 0.647 | 0.647 |
| 0.6471 | 0.648 |
| 0.6472 | 0.648 |
| 0.6473 | 0.648 |
| 0.6474 | 0.648 |
| 0.6475 | 0.648 |
| 0.6476 | 0.648 |
| 0.6477 | 0.648 |
| 0.6478 | 0.648 |
| 0.6479 | 0.648 |
| 0.648 | 0.648 |
| 0.6481 | 0.649 |
| 0.6482 | 0.649 |
| 0.6483 | 0.649 |
| 0.6484 | 0.649 |
| 0.6485 | 0.649 |
| 0.6486 | 0.649 |
| 0.6487 | 0.649 |
| 0.6488 | 0.649 |
| 0.6489 | 0.649 |
| 0.649 | 0.649 |
| 0.6491 | 0.65 |
| 0.6492 | 0.65 |
| 0.6493 | 0.65 |
| 0.6494 | 0.65 |
| 0.6495 | 0.65 |
| 0.6496 | 0.65 |
| 0.6497 | 0.65 |
| 0.6498 | 0.65 |
| 0.6499 | 0.65 |
| 0.65 | 0.65 |
| 0.6501 | 0.651 |
| 0.6502 | 0.651 |
| 0.6503 | 0.651 |
| 0.6504 | 0.651 |
| 0.6505 | 0.651 |
| 0.6506 | 0.651 |
| 0.6507 | 0.651 |
| 0.6508 | 0.651 |
| 0.6509 | 0.651 |
| 0.651 | 0.651 |
| 0.6511 | 0.652 |
| 0.6512 | 0.652 |
| 0.6513 | 0.652 |
| 0.6514 | 0.652 |
| 0.6515 | 0.652 |
| 0.6516 | 0.652 |
| 0.6517 | 0.652 |
| 0.6518 | 0.652 |
| 0.6519 | 0.652 |
| 0.652 | 0.652 |
| 0.6521 | 0.653 |
| 0.6522 | 0.653 |
| 0.6523 | 0.653 |
| 0.6524 | 0.653 |
| 0.6525 | 0.653 |
| 0.6526 | 0.653 |
| 0.6527 | 0.653 |
| 0.6528 | 0.653 |
| 0.6529 | 0.653 |
| 0.653 | 0.653 |
| 0.6531 | 0.654 |
| 0.6532 | 0.654 |
| 0.6533 | 0.654 |
| 0.6534 | 0.654 |
| 0.6535 | 0.654 |
| 0.6536 | 0.654 |
| 0.6537 | 0.654 |
| 0.6538 | 0.654 |
| 0.6539 | 0.654 |
| 0.654 | 0.654 |
| 0.6541 | 0.655 |
| 0.6542 | 0.655 |
| 0.6543 | 0.655 |
| 0.6544 | 0.655 |
| 0.6545 | 0.655 |
| 0.6546 | 0.655 |
| 0.6547 | 0.655 |
| 0.6548 | 0.655 |
| 0.6549 | 0.655 |
| 0.655 | 0.655 |
| 0.6551 | 0.656 |
| 0.6552 | 0.656 |
| 0.6553 | 0.656 |
| 0.6554 | 0.656 |
| 0.6555 | 0.656 |
| 0.6556 | 0.656 |
| 0.6557 | 0.656 |
| 0.6558 | 0.656 |
| 0.6559 | 0.656 |
| 0.656 | 0.656 |
| 0.6561 | 0.657 |
| 0.6562 | 0.657 |
| 0.6563 | 0.657 |
| 0.6564 | 0.657 |
| 0.6565 | 0.657 |
| 0.6566 | 0.657 |
| 0.6567 | 0.657 |
| 0.6568 | 0.657 |
| 0.6569 | 0.657 |
| 0.657 | 0.657 |
| 0.6571 | 0.658 |
| 0.6572 | 0.658 |
| 0.6573 | 0.658 |
| 0.6574 | 0.658 |
| 0.6575 | 0.658 |
| 0.6576 | 0.658 |
| 0.6577 | 0.658 |
| 0.6578 | 0.658 |
| 0.6579 | 0.658 |
| 0.658 | 0.658 |
| 0.6581 | 0.659 |
| 0.6582 | 0.659 |
| 0.6583 | 0.659 |
| 0.6584 | 0.659 |
| 0.6585 | 0.659 |
| 0.6586 | 0.659 |
| 0.6587 | 0.659 |
| 0.6588 | 0.659 |
| 0.6589 | 0.659 |
| 0.659 | 0.659 |
| 0.6591 | 0.66 |
| 0.6592 | 0.66 |
| 0.6593 | 0.66 |
| 0.6594 | 0.66 |
| 0.6595 | 0.66 |
| 0.6596 | 0.66 |
| 0.6597 | 0.66 |
| 0.6598 | 0.66 |
| 0.6599 | 0.66 |
| 0.66 | 0.66 |
| 0.6601 | 0.661 |
| 0.6602 | 0.661 |
| 0.6603 | 0.661 |
| 0.6604 | 0.661 |
| 0.6605 | 0.661 |
| 0.6606 | 0.661 |
| 0.6607 | 0.661 |
| 0.6608 | 0.661 |
| 0.6609 | 0.661 |
| 0.661 | 0.661 |
| 0.6611 | 0.662 |
| 0.6612 | 0.662 |
| 0.6613 | 0.662 |
| 0.6614 | 0.662 |
| 0.6615 | 0.662 |
| 0.6616 | 0.662 |
| 0.6617 | 0.662 |
| 0.6618 | 0.662 |
| 0.6619 | 0.662 |
| 0.662 | 0.662 |
| 0.6621 | 0.663 |
| 0.6622 | 0.663 |
| 0.6623 | 0.663 |
| 0.6624 | 0.663 |
| 0.6625 | 0.663 |
| 0.6626 | 0.663 |
| 0.6627 | 0.663 |
| 0.6628 | 0.663 |
| 0.6629 | 0.663 |
| 0.663 | 0.663 |
| 0.6631 | 0.664 |
| 0.6632 | 0.664 |
| 0.6633 | 0.664 |
| 0.6634 | 0.664 |
| 0.6635 | 0.664 |
| 0.6636 | 0.664 |
| 0.6637 | 0.664 |
| 0.6638 | 0.664 |
| 0.6639 | 0.664 |
| 0.664 | 0.664 |
| 0.6641 | 0.665 |
| 0.6642 | 0.665 |
| 0.6643 | 0.665 |
| 0.6644 | 0.665 |
| 0.6645 | 0.665 |
| 0.6646 | 0.665 |
| 0.6647 | 0.665 |
| 0.6648 | 0.665 |
| 0.6649 | 0.665 |
| 0.665 | 0.665 |
| 0.6651 | 0.666 |
| 0.6652 | 0.666 |
| 0.6653 | 0.666 |
| 0.6654 | 0.666 |
| 0.6655 | 0.666 |
| 0.6656 | 0.666 |
| 0.6657 | 0.666 |
| 0.6658 | 0.666 |
| 0.6659 | 0.666 |
| 0.666 | 0.666 |
| 0.6661 | 0.667 |
| 0.6662 | 0.667 |
| 0.6663 | 0.667 |
| 0.6664 | 0.667 |
| 0.6665 | 0.667 |
| 0.6666 | 0.667 |
| 0.6667 | 0.667 |
| 0.6668 | 0.667 |
| 0.6669 | 0.667 |
| 0.667 | 0.667 |
| 0.6671 | 0.668 |
| 0.6672 | 0.668 |
| 0.6673 | 0.668 |
| 0.6674 | 0.668 |
| 0.6675 | 0.668 |
| 0.6676 | 0.668 |
| 0.6677 | 0.668 |
| 0.6678 | 0.668 |
| 0.6679 | 0.668 |
| 0.668 | 0.668 |
| 0.6681 | 0.669 |
| 0.6682 | 0.669 |
| 0.6683 | 0.669 |
| 0.6684 | 0.669 |
| 0.6685 | 0.669 |
| 0.6686 | 0.669 |
| 0.6687 | 0.669 |
| 0.6688 | 0.669 |
| 0.6689 | 0.669 |
| 0.669 | 0.669 |
| 0.6691 | 0.67 |
| 0.6692 | 0.67 |
| 0.6693 | 0.67 |
| 0.6694 | 0.67 |
| 0.6695 | 0.67 |
| 0.6696 | 0.67 |
| 0.6697 | 0.67 |
| 0.6698 | 0.67 |
| 0.6699 | 0.67 |
| 0.67 | 0.67 |
| 0.6701 | 0.671 |
| 0.6702 | 0.671 |
| 0.6703 | 0.671 |
| 0.6704 | 0.671 |
| 0.6705 | 0.671 |
| 0.6706 | 0.671 |
| 0.6707 | 0.671 |
| 0.6708 | 0.671 |
| 0.6709 | 0.671 |
| 0.671 | 0.671 |
| 0.6711 | 0.672 |
| 0.6712 | 0.672 |
| 0.6713 | 0.672 |
| 0.6714 | 0.672 |
| 0.6715 | 0.672 |
| 0.6716 | 0.672 |
| 0.6717 | 0.672 |
| 0.6718 | 0.672 |
| 0.6719 | 0.672 |
| 0.672 | 0.672 |
| 0.6721 | 0.673 |
| 0.6722 | 0.673 |
| 0.6723 | 0.673 |
| 0.6724 | 0.673 |
| 0.6725 | 0.673 |
| 0.6726 | 0.673 |
| 0.6727 | 0.673 |
| 0.6728 | 0.673 |
| 0.6729 | 0.673 |
| 0.673 | 0.673 |
| 0.6731 | 0.674 |
| 0.6732 | 0.674 |
| 0.6733 | 0.674 |
| 0.6734 | 0.674 |
| 0.6735 | 0.674 |
| 0.6736 | 0.674 |
| 0.6737 | 0.674 |
| 0.6738 | 0.674 |
| 0.6739 | 0.674 |
| 0.674 | 0.674 |
| 0.6741 | 0.675 |
| 0.6742 | 0.675 |
| 0.6743 | 0.675 |
| 0.6744 | 0.675 |
| 0.6745 | 0.675 |
| 0.6746 | 0.675 |
| 0.6747 | 0.675 |
| 0.6748 | 0.675 |
| 0.6749 | 0.675 |
| 0.675 | 0.675 |
| 0.6751 | 0.676 |
| 0.6752 | 0.676 |
| 0.6753 | 0.676 |
| 0.6754 | 0.676 |
| 0.6755 | 0.676 |
| 0.6756 | 0.676 |
| 0.6757 | 0.676 |
| 0.6758 | 0.676 |
| 0.6759 | 0.676 |
| 0.676 | 0.676 |
| 0.6761 | 0.677 |
| 0.6762 | 0.677 |
| 0.6763 | 0.677 |
| 0.6764 | 0.677 |
| 0.6765 | 0.677 |
| 0.6766 | 0.677 |
| 0.6767 | 0.677 |
| 0.6768 | 0.677 |
| 0.6769 | 0.677 |
| 0.677 | 0.677 |
| 0.6771 | 0.678 |
| 0.6772 | 0.678 |
| 0.6773 | 0.678 |
| 0.6774 | 0.678 |
| 0.6775 | 0.678 |
| 0.6776 | 0.678 |
| 0.6777 | 0.678 |
| 0.6778 | 0.678 |
| 0.6779 | 0.678 |
| 0.678 | 0.678 |
| 0.6781 | 0.679 |
| 0.6782 | 0.679 |
| 0.6783 | 0.679 |
| 0.6784 | 0.679 |
| 0.6785 | 0.679 |
| 0.6786 | 0.679 |
| 0.6787 | 0.679 |
| 0.6788 | 0.679 |
| 0.6789 | 0.679 |
| 0.679 | 0.679 |
| 0.6791 | 0.68 |
| 0.6792 | 0.68 |
| 0.6793 | 0.68 |
| 0.6794 | 0.68 |
| 0.6795 | 0.68 |
| 0.6796 | 0.68 |
| 0.6797 | 0.68 |
| 0.6798 | 0.68 |
| 0.6799 | 0.68 |
| 0.68 | 0.68 |
| 0.6801 | 0.681 |
| 0.6802 | 0.681 |
| 0.6803 | 0.681 |
| 0.6804 | 0.681 |
| 0.6805 | 0.681 |
| 0.6806 | 0.681 |
| 0.6807 | 0.681 |
| 0.6808 | 0.681 |
| 0.6809 | 0.681 |
| 0.681 | 0.681 |
| 0.6811 | 0.681 |
| 0.6812 | 0.682 |
| 0.6813 | 0.682 |
| 0.6814 | 0.682 |
| 0.6815 | 0.682 |
| 0.6816 | 0.682 |
| 0.6817 | 0.682 |
| 0.6818 | 0.682 |
| 0.6819 | 0.682 |
| 0.682 | 0.682 |
| 0.6821 | 0.682 |
| 0.6822 | 0.683 |
| 0.6823 | 0.683 |
| 0.6824 | 0.683 |
| 0.6825 | 0.683 |
| 0.6826 | 0.683 |
| 0.6827 | 0.683 |
| 0.6828 | 0.683 |
| 0.6829 | 0.683 |
| 0.683 | 0.683 |
| 0.6831 | 0.684 |
| 0.6832 | 0.684 |
| 0.6833 | 0.684 |
| 0.6834 | 0.684 |
| 0.6835 | 0.684 |
| 0.6836 | 0.684 |
| 0.6837 | 0.684 |
| 0.6838 | 0.684 |
| 0.6839 | 0.684 |
| 0.684 | 0.684 |
| 0.6841 | 0.685 |
| 0.6842 | 0.685 |
| 0.6843 | 0.685 |
| 0.6844 | 0.685 |
| 0.6845 | 0.685 |
| 0.6846 | 0.685 |
| 0.6847 | 0.685 |
| 0.6848 | 0.685 |
| 0.6849 | 0.685 |
| 0.685 | 0.685 |
| 0.6851 | 0.686 |
| 0.6852 | 0.686 |
| 0.6853 | 0.686 |
| 0.6854 | 0.686 |
| 0.6855 | 0.686 |
| 0.6856 | 0.686 |
| 0.6857 | 0.686 |
| 0.6858 | 0.686 |
| 0.6859 | 0.686 |
| 0.686 | 0.686 |
| 0.6861 | 0.686 |
| 0.6862 | 0.687 |
| 0.6863 | 0.687 |
| 0.6864 | 0.687 |
| 0.6865 | 0.687 |
| 0.6866 | 0.687 |
| 0.6867 | 0.687 |
| 0.6868 | 0.687 |
| 0.6869 | 0.687 |
| 0.687 | 0.687 |
| 0.6871 | 0.688 |
| 0.6872 | 0.688 |
| 0.6873 | 0.688 |
| 0.6874 | 0.688 |
| 0.6875 | 0.688 |
| 0.6876 | 0.688 |
| 0.6877 | 0.688 |
| 0.6878 | 0.688 |
| 0.6879 | 0.688 |
| 0.688 | 0.688 |
| 0.6881 | 0.688 |
| 0.6882 | 0.689 |
| 0.6883 | 0.689 |
| 0.6884 | 0.689 |
| 0.6885 | 0.689 |
| 0.6886 | 0.689 |
| 0.6887 | 0.689 |
| 0.6888 | 0.689 |
| 0.6889 | 0.689 |
| 0.689 | 0.689 |
| 0.6891 | 0.69 |
| 0.6892 | 0.69 |
| 0.6893 | 0.69 |
| 0.6894 | 0.69 |
| 0.6895 | 0.69 |
| 0.6896 | 0.69 |
| 0.6897 | 0.69 |
| 0.6898 | 0.69 |
| 0.6899 | 0.69 |
| 0.69 | 0.69 |
| 0.6901 | 0.691 |
| 0.6902 | 0.691 |
| 0.6903 | 0.691 |
| 0.6904 | 0.691 |
| 0.6905 | 0.691 |
| 0.6906 | 0.691 |
| 0.6907 | 0.691 |
| 0.6908 | 0.691 |
| 0.6909 | 0.691 |
| 0.691 | 0.691 |
| 0.6911 | 0.692 |
| 0.6912 | 0.692 |
| 0.6913 | 0.692 |
| 0.6914 | 0.692 |
| 0.6915 | 0.692 |
| 0.6916 | 0.692 |
| 0.6917 | 0.692 |
| 0.6918 | 0.692 |
| 0.6919 | 0.692 |
| 0.692 | 0.692 |
| 0.6921 | 0.692 |
| 0.6922 | 0.693 |
| 0.6923 | 0.693 |
| 0.6924 | 0.693 |
| 0.6925 | 0.693 |
| 0.6926 | 0.693 |
| 0.6927 | 0.693 |
| 0.6928 | 0.693 |
| 0.6929 | 0.693 |
| 0.693 | 0.693 |
| 0.6931 | 0.693 |
| 0.6932 | 0.694 |
| 0.6933 | 0.694 |
| 0.6934 | 0.694 |
| 0.6935 | 0.694 |
| 0.6936 | 0.694 |
| 0.6937 | 0.694 |
| 0.6938 | 0.694 |
| 0.6939 | 0.694 |
| 0.694 | 0.694 |
| 0.6941 | 0.695 |
| 0.6942 | 0.695 |
| 0.6943 | 0.695 |
| 0.6944 | 0.695 |
| 0.6945 | 0.695 |
| 0.6946 | 0.695 |
| 0.6947 | 0.695 |
| 0.6948 | 0.695 |
| 0.6949 | 0.695 |
| 0.695 | 0.695 |
| 0.6951 | 0.696 |
| 0.6952 | 0.696 |
| 0.6953 | 0.696 |
| 0.6954 | 0.696 |
| 0.6955 | 0.696 |
| 0.6956 | 0.696 |
| 0.6957 | 0.696 |
| 0.6958 | 0.696 |
| 0.6959 | 0.696 |
| 0.696 | 0.696 |
| 0.6961 | 0.697 |
| 0.6962 | 0.697 |
| 0.6963 | 0.697 |
| 0.6964 | 0.697 |
| 0.6965 | 0.697 |
| 0.6966 | 0.697 |
| 0.6967 | 0.697 |
| 0.6968 | 0.697 |
| 0.6969 | 0.697 |
| 0.697 | 0.697 |
| 0.6971 | 0.698 |
| 0.6972 | 0.698 |
| 0.6973 | 0.698 |
| 0.6974 | 0.698 |
| 0.6975 | 0.698 |
| 0.6976 | 0.698 |
| 0.6977 | 0.698 |
| 0.6978 | 0.698 |
| 0.6979 | 0.698 |
| 0.698 | 0.698 |
| 0.6981 | 0.698 |
| 0.6982 | 0.699 |
| 0.6983 | 0.699 |
| 0.6984 | 0.699 |
| 0.6985 | 0.699 |
| 0.6986 | 0.699 |
| 0.6987 | 0.699 |
| 0.6988 | 0.699 |
| 0.6989 | 0.699 |
| 0.699 | 0.699 |
| 0.6991 | 0.7 |
| 0.6992 | 0.7 |
| 0.6993 | 0.7 |
| 0.6994 | 0.7 |
| 0.6995 | 0.7 |
| 0.6996 | 0.7 |
| 0.6997 | 0.7 |
| 0.6998 | 0.7 |
| 0.6999 | 0.7 |
| 0.7 | 0.7 |
| 0.7001 | 0.7 |
| 0.7002 | 0.701 |
| 0.7003 | 0.701 |
| 0.7004 | 0.701 |
| 0.7005 | 0.701 |
| 0.7006 | 0.701 |
| 0.7007 | 0.701 |
| 0.7008 | 0.701 |
| 0.7009 | 0.701 |
| 0.701 | 0.701 |
| 0.7011 | 0.701 |
| 0.7012 | 0.702 |
| 0.7013 | 0.702 |
| 0.7014 | 0.702 |
| 0.7015 | 0.702 |
| 0.7016 | 0.702 |
| 0.7017 | 0.702 |
| 0.7018 | 0.702 |
| 0.7019 | 0.702 |
| 0.702 | 0.702 |
| 0.7021 | 0.702 |
| 0.7022 | 0.703 |
| 0.7023 | 0.703 |
| 0.7024 | 0.703 |
| 0.7025 | 0.703 |
| 0.7026 | 0.703 |
| 0.7027 | 0.703 |
| 0.7028 | 0.703 |
| 0.7029 | 0.703 |
| 0.703 | 0.703 |
| 0.7031 | 0.704 |
| 0.7032 | 0.704 |
| 0.7033 | 0.704 |
| 0.7034 | 0.704 |
| 0.7035 | 0.704 |
| 0.7036 | 0.704 |
| 0.7037 | 0.704 |
| 0.7038 | 0.704 |
| 0.7039 | 0.704 |
| 0.704 | 0.704 |
| 0.7041 | 0.704 |
| 0.7042 | 0.705 |
| 0.7043 | 0.705 |
| 0.7044 | 0.705 |
| 0.7045 | 0.705 |
| 0.7046 | 0.705 |
| 0.7047 | 0.705 |
| 0.7048 | 0.705 |
| 0.7049 | 0.705 |
| 0.705 | 0.705 |
| 0.7051 | 0.705 |
| 0.7052 | 0.706 |
| 0.7053 | 0.706 |
| 0.7054 | 0.706 |
| 0.7055 | 0.706 |
| 0.7056 | 0.706 |
| 0.7057 | 0.706 |
| 0.7058 | 0.706 |
| 0.7059 | 0.706 |
| 0.706 | 0.706 |
| 0.7061 | 0.706 |
| 0.7062 | 0.707 |
| 0.7063 | 0.707 |
| 0.7064 | 0.707 |
| 0.7065 | 0.707 |
| 0.7066 | 0.707 |
| 0.7067 | 0.707 |
| 0.7068 | 0.707 |
| 0.7069 | 0.707 |
| 0.707 | 0.707 |
| 0.7071 | 0.707 |
| 0.7072 | 0.708 |
| 0.7073 | 0.708 |
| 0.7074 | 0.708 |
| 0.7075 | 0.708 |
| 0.7076 | 0.708 |
| 0.7077 | 0.708 |
| 0.7078 | 0.708 |
| 0.7079 | 0.708 |
| 0.708 | 0.708 |
| 0.7081 | 0.708 |
| 0.7082 | 0.709 |
| 0.7083 | 0.709 |
| 0.7084 | 0.709 |
| 0.7085 | 0.709 |
| 0.7086 | 0.709 |
| 0.7087 | 0.709 |
| 0.7088 | 0.709 |
| 0.7089 | 0.709 |
| 0.709 | 0.709 |
| 0.7091 | 0.709 |
| 0.7092 | 0.71 |
| 0.7093 | 0.71 |
| 0.7094 | 0.71 |
| 0.7095 | 0.71 |
| 0.7096 | 0.71 |
| 0.7097 | 0.71 |
| 0.7098 | 0.71 |
| 0.7099 | 0.71 |
| 0.71 | 0.71 |
| 0.7101 | 0.71 |
| 0.7102 | 0.71 |
| 0.7103 | 0.711 |
| 0.7104 | 0.711 |
| 0.7105 | 0.711 |
| 0.7106 | 0.711 |
| 0.7107 | 0.711 |
| 0.7108 | 0.711 |
| 0.7109 | 0.711 |
| 0.711 | 0.711 |
| 0.7111 | 0.711 |
| 0.7112 | 0.712 |
| 0.7113 | 0.712 |
| 0.7114 | 0.712 |
| 0.7115 | 0.712 |
| 0.7116 | 0.712 |
| 0.7117 | 0.712 |
| 0.7118 | 0.712 |
| 0.7119 | 0.712 |
| 0.712 | 0.712 |
| 0.7121 | 0.712 |
| 0.7122 | 0.713 |
| 0.7123 | 0.713 |
| 0.7124 | 0.713 |
| 0.7125 | 0.713 |
| 0.7126 | 0.713 |
| 0.7127 | 0.713 |
| 0.7128 | 0.713 |
| 0.7129 | 0.713 |
| 0.713 | 0.713 |
| 0.7131 | 0.713 |
| 0.7132 | 0.714 |
| 0.7133 | 0.714 |
| 0.7134 | 0.714 |
| 0.7135 | 0.714 |
| 0.7136 | 0.714 |
| 0.7137 | 0.714 |
| 0.7138 | 0.714 |
| 0.7139 | 0.714 |
| 0.714 | 0.714 |
| 0.7141 | 0.714 |
| 0.7142 | 0.715 |
| 0.7143 | 0.715 |
| 0.7144 | 0.715 |
| 0.7145 | 0.715 |
| 0.7146 | 0.715 |
| 0.7147 | 0.715 |
| 0.7148 | 0.715 |
| 0.7149 | 0.715 |
| 0.715 | 0.715 |
| 0.7151 | 0.715 |
| 0.7152 | 0.716 |
| 0.7153 | 0.716 |
| 0.7154 | 0.716 |
| 0.7155 | 0.716 |
| 0.7156 | 0.716 |
| 0.7157 | 0.716 |
| 0.7158 | 0.716 |
| 0.7159 | 0.716 |
| 0.716 | 0.716 |
| 0.7161 | 0.716 |
| 0.7162 | 0.717 |
| 0.7163 | 0.717 |
| 0.7164 | 0.717 |
| 0.7165 | 0.717 |
| 0.7166 | 0.717 |
| 0.7167 | 0.717 |
| 0.7168 | 0.717 |
| 0.7169 | 0.717 |
| 0.717 | 0.717 |
| 0.7171 | 0.717 |
| 0.7172 | 0.718 |
| 0.7173 | 0.718 |
| 0.7174 | 0.718 |
| 0.7175 | 0.718 |
| 0.7176 | 0.718 |
| 0.7177 | 0.718 |
| 0.7178 | 0.718 |
| 0.7179 | 0.718 |
| 0.718 | 0.718 |
| 0.7181 | 0.718 |
| 0.7182 | 0.719 |
| 0.7183 | 0.719 |
| 0.7184 | 0.719 |
| 0.7185 | 0.719 |
| 0.7186 | 0.719 |
| 0.7187 | 0.719 |
| 0.7188 | 0.719 |
| 0.7189 | 0.719 |
| 0.719 | 0.719 |
| 0.7191 | 0.72 |
| 0.7192 | 0.72 |
| 0.7193 | 0.72 |
| 0.7194 | 0.72 |
| 0.7195 | 0.72 |
| 0.7196 | 0.72 |
| 0.7197 | 0.72 |
| 0.7198 | 0.72 |
| 0.7199 | 0.72 |
| 0.72 | 0.72 |
| 0.7201 | 0.72 |
| 0.7202 | 0.721 |
| 0.7203 | 0.721 |
| 0.7204 | 0.721 |
| 0.7205 | 0.721 |
| 0.7206 | 0.721 |
| 0.7207 | 0.721 |
| 0.7208 | 0.721 |
| 0.7209 | 0.721 |
| 0.721 | 0.721 |
| 0.7211 | 0.721 |
| 0.7212 | 0.722 |
| 0.7213 | 0.722 |
| 0.7214 | 0.722 |
| 0.7215 | 0.722 |
| 0.7216 | 0.722 |
| 0.7217 | 0.722 |
| 0.7218 | 0.722 |
| 0.7219 | 0.722 |
| 0.722 | 0.722 |
| 0.7221 | 0.722 |
| 0.7222 | 0.723 |
| 0.7223 | 0.723 |
| 0.7224 | 0.723 |
| 0.7225 | 0.723 |
| 0.7226 | 0.723 |
| 0.7227 | 0.723 |
| 0.7228 | 0.723 |
| 0.7229 | 0.723 |
| 0.723 | 0.723 |
| 0.7231 | 0.723 |
| 0.7232 | 0.724 |
| 0.7233 | 0.724 |
| 0.7234 | 0.724 |
| 0.7235 | 0.724 |
| 0.7236 | 0.724 |
| 0.7237 | 0.724 |
| 0.7238 | 0.724 |
| 0.7239 | 0.724 |
| 0.724 | 0.724 |
| 0.7241 | 0.724 |
| 0.7242 | 0.725 |
| 0.7243 | 0.725 |
| 0.7244 | 0.725 |
| 0.7245 | 0.725 |
| 0.7246 | 0.725 |
| 0.7247 | 0.725 |
| 0.7248 | 0.725 |
| 0.7249 | 0.725 |
| 0.725 | 0.725 |
| 0.7251 | 0.725 |
| 0.7252 | 0.726 |
| 0.7253 | 0.726 |
| 0.7254 | 0.726 |
| 0.7255 | 0.726 |
| 0.7256 | 0.726 |
| 0.7257 | 0.726 |
| 0.7258 | 0.726 |
| 0.7259 | 0.726 |
| 0.726 | 0.726 |
| 0.7261 | 0.726 |
| 0.7262 | 0.727 |
| 0.7263 | 0.727 |
| 0.7264 | 0.727 |
| 0.7265 | 0.727 |
| 0.7266 | 0.727 |
| 0.7267 | 0.727 |
| 0.7268 | 0.727 |
| 0.7269 | 0.727 |
| 0.727 | 0.727 |
| 0.7271 | 0.727 |
| 0.7272 | 0.728 |
| 0.7273 | 0.728 |
| 0.7274 | 0.728 |
| 0.7275 | 0.728 |
| 0.7276 | 0.728 |
| 0.7277 | 0.728 |
| 0.7278 | 0.728 |
| 0.7279 | 0.728 |
| 0.728 | 0.728 |
| 0.7281 | 0.728 |
| 0.7282 | 0.729 |
| 0.7283 | 0.729 |
| 0.7284 | 0.729 |
| 0.7285 | 0.729 |
| 0.7286 | 0.729 |
| 0.7287 | 0.729 |
| 0.7288 | 0.729 |
| 0.7289 | 0.729 |
| 0.729 | 0.729 |
| 0.7291 | 0.729 |
| 0.7292 | 0.73 |
| 0.7293 | 0.73 |
| 0.7294 | 0.73 |
| 0.7295 | 0.73 |
| 0.7296 | 0.73 |
| 0.7297 | 0.73 |
| 0.7298 | 0.73 |
| 0.7299 | 0.73 |
| 0.73 | 0.73 |
| 0.7301 | 0.73 |
| 0.7302 | 0.73 |
| 0.7303 | 0.731 |
| 0.7304 | 0.731 |
| 0.7305 | 0.731 |
| 0.7306 | 0.731 |
| 0.7307 | 0.731 |
| 0.7308 | 0.731 |
| 0.7309 | 0.731 |
| 0.731 | 0.731 |
| 0.7311 | 0.731 |
| 0.7312 | 0.732 |
| 0.7313 | 0.732 |
| 0.7314 | 0.732 |
| 0.7315 | 0.732 |
| 0.7316 | 0.732 |
| 0.7317 | 0.732 |
| 0.7318 | 0.732 |
| 0.7319 | 0.732 |
| 0.732 | 0.732 |
| 0.7321 | 0.732 |
| 0.7322 | 0.733 |
| 0.7323 | 0.733 |
| 0.7324 | 0.733 |
| 0.7325 | 0.733 |
| 0.7326 | 0.733 |
| 0.7327 | 0.733 |
| 0.7328 | 0.733 |
| 0.7329 | 0.733 |
| 0.733 | 0.733 |
| 0.7331 | 0.733 |
| 0.7332 | 0.734 |
| 0.7333 | 0.734 |
| 0.7334 | 0.734 |
| 0.7335 | 0.734 |
| 0.7336 | 0.734 |
| 0.7337 | 0.734 |
| 0.7338 | 0.734 |
| 0.7339 | 0.734 |
| 0.734 | 0.734 |
| 0.7341 | 0.734 |
| 0.7342 | 0.735 |
| 0.7343 | 0.735 |
| 0.7344 | 0.735 |
| 0.7345 | 0.735 |
| 0.7346 | 0.735 |
| 0.7347 | 0.735 |
| 0.7348 | 0.735 |
| 0.7349 | 0.735 |
| 0.735 | 0.735 |
| 0.7351 | 0.735 |
| 0.7352 | 0.736 |
| 0.7353 | 0.736 |
| 0.7354 | 0.736 |
| 0.7355 | 0.736 |
| 0.7356 | 0.736 |
| 0.7357 | 0.736 |
| 0.7358 | 0.736 |
| 0.7359 | 0.736 |
| 0.736 | 0.736 |
| 0.7361 | 0.736 |
| 0.7362 | 0.737 |
| 0.7363 | 0.737 |
| 0.7364 | 0.737 |
| 0.7365 | 0.737 |
| 0.7366 | 0.737 |
| 0.7367 | 0.737 |
| 0.7368 | 0.737 |
| 0.7369 | 0.737 |
| 0.737 | 0.737 |
| 0.7371 | 0.737 |
| 0.7372 | 0.738 |
| 0.7373 | 0.738 |
| 0.7374 | 0.738 |
| 0.7375 | 0.738 |
| 0.7376 | 0.738 |
| 0.7377 | 0.738 |
| 0.7378 | 0.738 |
| 0.7379 | 0.738 |
| 0.738 | 0.738 |
| 0.7381 | 0.738 |
| 0.7382 | 0.739 |
| 0.7383 | 0.739 |
| 0.7384 | 0.739 |
| 0.7385 | 0.739 |
| 0.7386 | 0.739 |
| 0.7387 | 0.739 |
| 0.7388 | 0.739 |
| 0.7389 | 0.739 |
| 0.739 | 0.739 |
| 0.7391 | 0.739 |
| 0.7392 | 0.74 |
| 0.7393 | 0.74 |
| 0.7394 | 0.74 |
| 0.7395 | 0.74 |
| 0.7396 | 0.74 |
| 0.7397 | 0.74 |
| 0.7398 | 0.74 |
| 0.7399 | 0.74 |
| 0.74 | 0.74 |
| 0.7401 | 0.74 |
| 0.7402 | 0.741 |
| 0.7403 | 0.741 |
| 0.7404 | 0.741 |
| 0.7405 | 0.741 |
| 0.7406 | 0.741 |
| 0.7407 | 0.741 |
| 0.7408 | 0.741 |
| 0.7409 | 0.741 |
| 0.741 | 0.741 |
| 0.7411 | 0.741 |
| 0.7412 | 0.742 |
| 0.7413 | 0.742 |
| 0.7414 | 0.742 |
| 0.7415 | 0.742 |
| 0.7416 | 0.742 |
| 0.7417 | 0.742 |
| 0.7418 | 0.742 |
| 0.7419 | 0.742 |
| 0.742 | 0.742 |
| 0.7421 | 0.742 |
| 0.7422 | 0.743 |
| 0.7423 | 0.743 |
| 0.7424 | 0.743 |
| 0.7425 | 0.743 |
| 0.7426 | 0.743 |
| 0.7427 | 0.743 |
| 0.7428 | 0.743 |
| 0.7429 | 0.743 |
| 0.743 | 0.743 |
| 0.7431 | 0.743 |
| 0.7432 | 0.744 |
| 0.7433 | 0.744 |
| 0.7434 | 0.744 |
| 0.7435 | 0.744 |
| 0.7436 | 0.744 |
| 0.7437 | 0.744 |
| 0.7438 | 0.744 |
| 0.7439 | 0.744 |
| 0.744 | 0.744 |
| 0.7441 | 0.744 |
| 0.7442 | 0.745 |
| 0.7443 | 0.745 |
| 0.7444 | 0.745 |
| 0.7445 | 0.745 |
| 0.7446 | 0.745 |
| 0.7447 | 0.745 |
| 0.7448 | 0.745 |
| 0.7449 | 0.745 |
| 0.745 | 0.745 |
| 0.7451 | 0.745 |
| 0.7452 | 0.746 |
| 0.7453 | 0.746 |
| 0.7454 | 0.746 |
| 0.7455 | 0.746 |
| 0.7456 | 0.746 |
| 0.7457 | 0.746 |
| 0.7458 | 0.746 |
| 0.7459 | 0.746 |
| 0.746 | 0.746 |
| 0.7461 | 0.746 |
| 0.7462 | 0.747 |
| 0.7463 | 0.747 |
| 0.7464 | 0.747 |
| 0.7465 | 0.747 |
| 0.7466 | 0.747 |
| 0.7467 | 0.747 |
| 0.7468 | 0.747 |
| 0.7469 | 0.747 |
| 0.747 | 0.747 |
| 0.7471 | 0.747 |
| 0.7472 | 0.748 |
| 0.7473 | 0.748 |
| 0.7474 | 0.748 |
| 0.7475 | 0.748 |
| 0.7476 | 0.748 |
| 0.7477 | 0.748 |
| 0.7478 | 0.748 |
| 0.7479 | 0.748 |
| 0.748 | 0.748 |
| 0.7481 | 0.748 |
| 0.7482 | 0.749 |
| 0.7483 | 0.749 |
| 0.7484 | 0.749 |
| 0.7485 | 0.749 |
| 0.7486 | 0.749 |
| 0.7487 | 0.749 |
| 0.7488 | 0.749 |
| 0.7489 | 0.749 |
| 0.749 | 0.749 |
| 0.7491 | 0.749 |
| 0.7492 | 0.75 |
| 0.7493 | 0.75 |
| 0.7494 | 0.75 |
| 0.7495 | 0.75 |
| 0.7496 | 0.75 |
| 0.7497 | 0.75 |
| 0.7498 | 0.75 |
| 0.7499 | 0.75 |
| 0.75 | 0.75 |
| 0.7501 | 0.75 |
| 0.7502 | 0.751 |
| 0.7503 | 0.751 |
| 0.7504 | 0.751 |
| 0.7505 | 0.751 |
| 0.7506 | 0.751 |
| 0.7507 | 0.751 |
| 0.7508 | 0.751 |
| 0.7509 | 0.751 |
| 0.751 | 0.751 |
| 0.7511 | 0.751 |
| 0.7512 | 0.752 |
| 0.7513 | 0.752 |
| 0.7514 | 0.752 |
| 0.7515 | 0.752 |
| 0.7516 | 0.752 |
| 0.7517 | 0.752 |
| 0.7518 | 0.752 |
| 0.7519 | 0.752 |
| 0.752 | 0.752 |
| 0.7521 | 0.752 |
| 0.7522 | 0.753 |
| 0.7523 | 0.753 |
| 0.7524 | 0.753 |
| 0.7525 | 0.753 |
| 0.7526 | 0.753 |
| 0.7527 | 0.753 |
| 0.7528 | 0.753 |
| 0.7529 | 0.753 |
| 0.753 | 0.753 |
| 0.7531 | 0.753 |
| 0.7532 | 0.754 |
| 0.7533 | 0.754 |
| 0.7534 | 0.754 |
| 0.7535 | 0.754 |
| 0.7536 | 0.754 |
| 0.7537 | 0.754 |
| 0.7538 | 0.754 |
| 0.7539 | 0.754 |
| 0.754 | 0.754 |
| 0.7541 | 0.754 |
| 0.7542 | 0.755 |
| 0.7543 | 0.755 |
| 0.7544 | 0.755 |
| 0.7545 | 0.755 |
| 0.7546 | 0.755 |
| 0.7547 | 0.755 |
| 0.7548 | 0.755 |
| 0.7549 | 0.755 |
| 0.755 | 0.755 |
| 0.7551 | 0.755 |
| 0.7552 | 0.756 |
| 0.7553 | 0.756 |
| 0.7554 | 0.756 |
| 0.7555 | 0.756 |
| 0.7556 | 0.756 |
| 0.7557 | 0.756 |
| 0.7558 | 0.756 |
| 0.7559 | 0.756 |
| 0.756 | 0.756 |
| 0.7561 | 0.756 |
| 0.7562 | 0.756 |
| 0.7563 | 0.757 |
| 0.7564 | 0.757 |
| 0.7565 | 0.757 |
| 0.7566 | 0.757 |
| 0.7567 | 0.757 |
| 0.7568 | 0.757 |
| 0.7569 | 0.757 |
| 0.757 | 0.757 |
| 0.7571 | 0.757 |
| 0.7572 | 0.758 |
| 0.7573 | 0.758 |
| 0.7574 | 0.758 |
| 0.7575 | 0.758 |
| 0.7576 | 0.758 |
| 0.7577 | 0.758 |
| 0.7578 | 0.758 |
| 0.7579 | 0.758 |
| 0.758 | 0.758 |
| 0.7581 | 0.758 |
| 0.7582 | 0.759 |
| 0.7583 | 0.759 |
| 0.7584 | 0.759 |
| 0.7585 | 0.759 |
| 0.7586 | 0.759 |
| 0.7587 | 0.759 |
| 0.7588 | 0.759 |
| 0.7589 | 0.759 |
| 0.759 | 0.759 |
| 0.7591 | 0.759 |
| 0.7592 | 0.76 |
| 0.7593 | 0.76 |
| 0.7594 | 0.76 |
| 0.7595 | 0.76 |
| 0.7596 | 0.76 |
| 0.7597 | 0.76 |
| 0.7598 | 0.76 |
| 0.7599 | 0.76 |
| 0.76 | 0.76 |
| 0.7601 | 0.76 |
| 0.7602 | 0.761 |
| 0.7603 | 0.761 |
| 0.7604 | 0.761 |
| 0.7605 | 0.761 |
| 0.7606 | 0.761 |
| 0.7607 | 0.761 |
| 0.7608 | 0.761 |
| 0.7609 | 0.761 |
| 0.761 | 0.761 |
| 0.7611 | 0.761 |
| 0.7612 | 0.761 |
| 0.7613 | 0.762 |
| 0.7614 | 0.762 |
| 0.7615 | 0.762 |
| 0.7616 | 0.762 |
| 0.7617 | 0.762 |
| 0.7618 | 0.762 |
| 0.7619 | 0.762 |
| 0.762 | 0.762 |
| 0.7621 | 0.762 |
| 0.7622 | 0.763 |
| 0.7623 | 0.763 |
| 0.7624 | 0.763 |
| 0.7625 | 0.763 |
| 0.7626 | 0.763 |
| 0.7627 | 0.763 |
| 0.7628 | 0.763 |
| 0.7629 | 0.763 |
| 0.763 | 0.763 |
| 0.7631 | 0.763 |
| 0.7632 | 0.763 |
| 0.7633 | 0.764 |
| 0.7634 | 0.764 |
| 0.7635 | 0.764 |
| 0.7636 | 0.764 |
| 0.7637 | 0.764 |
| 0.7638 | 0.764 |
| 0.7639 | 0.764 |
| 0.764 | 0.764 |
| 0.7641 | 0.764 |
| 0.7642 | 0.764 |
| 0.7643 | 0.765 |
| 0.7644 | 0.765 |
| 0.7645 | 0.765 |
| 0.7646 | 0.765 |
| 0.7647 | 0.765 |
| 0.7648 | 0.765 |
| 0.7649 | 0.765 |
| 0.765 | 0.765 |
| 0.7651 | 0.765 |
| 0.7652 | 0.765 |
| 0.7653 | 0.766 |
| 0.7654 | 0.766 |
| 0.7655 | 0.766 |
| 0.7656 | 0.766 |
| 0.7657 | 0.766 |
| 0.7658 | 0.766 |
| 0.7659 | 0.766 |
| 0.766 | 0.766 |
| 0.7661 | 0.766 |
| 0.7662 | 0.767 |
| 0.7663 | 0.767 |
| 0.7664 | 0.767 |
| 0.7665 | 0.767 |
| 0.7666 | 0.767 |
| 0.7667 | 0.767 |
| 0.7668 | 0.767 |
| 0.7669 | 0.767 |
| 0.767 | 0.767 |
| 0.7671 | 0.767 |
| 0.7672 | 0.767 |
| 0.7673 | 0.768 |
| 0.7674 | 0.768 |
| 0.7675 | 0.768 |
| 0.7676 | 0.768 |
| 0.7677 | 0.768 |
| 0.7678 | 0.768 |
| 0.7679 | 0.768 |
| 0.768 | 0.768 |
| 0.7681 | 0.768 |
| 0.7682 | 0.769 |
| 0.7683 | 0.769 |
| 0.7684 | 0.769 |
| 0.7685 | 0.769 |
| 0.7686 | 0.769 |
| 0.7687 | 0.769 |
| 0.7688 | 0.769 |
| 0.7689 | 0.769 |
| 0.769 | 0.769 |
| 0.7691 | 0.769 |
| 0.7692 | 0.769 |
| 0.7693 | 0.77 |
| 0.7694 | 0.77 |
| 0.7695 | 0.77 |
| 0.7696 | 0.77 |
| 0.7697 | 0.77 |
| 0.7698 | 0.77 |
| 0.7699 | 0.77 |
| 0.77 | 0.77 |
| 0.7701 | 0.77 |
| 0.7702 | 0.77 |
| 0.7703 | 0.771 |
| 0.7704 | 0.771 |
| 0.7705 | 0.771 |
| 0.7706 | 0.771 |
| 0.7707 | 0.771 |
| 0.7708 | 0.771 |
| 0.7709 | 0.771 |
| 0.771 | 0.771 |
| 0.7711 | 0.771 |
| 0.7712 | 0.772 |
| 0.7713 | 0.772 |
| 0.7714 | 0.772 |
| 0.7715 | 0.772 |
| 0.7716 | 0.772 |
| 0.7717 | 0.772 |
| 0.7718 | 0.772 |
| 0.7719 | 0.772 |
| 0.772 | 0.772 |
| 0.7721 | 0.772 |
| 0.7722 | 0.773 |
| 0.7723 | 0.773 |
| 0.7724 | 0.773 |
| 0.7725 | 0.773 |
| 0.7726 | 0.773 |
| 0.7727 | 0.773 |
| 0.7728 | 0.773 |
| 0.7729 | 0.773 |
| 0.773 | 0.773 |
| 0.7731 | 0.773 |
| 0.7732 | 0.774 |
| 0.7733 | 0.774 |
| 0.7734 | 0.774 |
| 0.7735 | 0.774 |
| 0.7736 | 0.774 |
| 0.7737 | 0.774 |
| 0.7738 | 0.774 |
| 0.7739 | 0.774 |
| 0.774 | 0.774 |
| 0.7741 | 0.774 |
| 0.7742 | 0.775 |
| 0.7743 | 0.775 |
| 0.7744 | 0.775 |
| 0.7745 | 0.775 |
| 0.7746 | 0.775 |
| 0.7747 | 0.775 |
| 0.7748 | 0.775 |
| 0.7749 | 0.775 |
| 0.775 | 0.775 |
| 0.7751 | 0.775 |
| 0.7752 | 0.775 |
| 0.7753 | 0.776 |
| 0.7754 | 0.776 |
| 0.7755 | 0.776 |
| 0.7756 | 0.776 |
| 0.7757 | 0.776 |
| 0.7758 | 0.776 |
| 0.7759 | 0.776 |
| 0.776 | 0.776 |
| 0.7761 | 0.776 |
| 0.7762 | 0.777 |
| 0.7763 | 0.777 |
| 0.7764 | 0.777 |
| 0.7765 | 0.777 |
| 0.7766 | 0.777 |
| 0.7767 | 0.777 |
| 0.7768 | 0.777 |
| 0.7769 | 0.777 |
| 0.777 | 0.777 |
| 0.7771 | 0.777 |
| 0.7772 | 0.777 |
| 0.7773 | 0.778 |
| 0.7774 | 0.778 |
| 0.7775 | 0.778 |
| 0.7776 | 0.778 |
| 0.7777 | 0.778 |
| 0.7778 | 0.778 |
| 0.7779 | 0.778 |
| 0.778 | 0.778 |
| 0.7781 | 0.778 |
| 0.7782 | 0.778 |
| 0.7783 | 0.779 |
| 0.7784 | 0.779 |
| 0.7785 | 0.779 |
| 0.7786 | 0.779 |
| 0.7787 | 0.779 |
| 0.7788 | 0.779 |
| 0.7789 | 0.779 |
| 0.779 | 0.779 |
| 0.7791 | 0.779 |
| 0.7792 | 0.779 |
| 0.7793 | 0.78 |
| 0.7794 | 0.78 |
| 0.7795 | 0.78 |
| 0.7796 | 0.78 |
| 0.7797 | 0.78 |
| 0.7798 | 0.78 |
| 0.7799 | 0.78 |
| 0.78 | 0.78 |
| 0.7801 | 0.78 |
| 0.7802 | 0.78 |
| 0.7803 | 0.781 |
| 0.7804 | 0.781 |
| 0.7805 | 0.781 |
| 0.7806 | 0.781 |
| 0.7807 | 0.781 |
| 0.7808 | 0.781 |
| 0.7809 | 0.781 |
| 0.781 | 0.781 |
| 0.7811 | 0.781 |
| 0.7812 | 0.781 |
| 0.7813 | 0.782 |
| 0.7814 | 0.782 |
| 0.7815 | 0.782 |
| 0.7816 | 0.782 |
| 0.7817 | 0.782 |
| 0.7818 | 0.782 |
| 0.7819 | 0.782 |
| 0.782 | 0.782 |
| 0.7821 | 0.782 |
| 0.7822 | 0.782 |
| 0.7823 | 0.783 |
| 0.7824 | 0.783 |
| 0.7825 | 0.783 |
| 0.7826 | 0.783 |
| 0.7827 | 0.783 |
| 0.7828 | 0.783 |
| 0.7829 | 0.783 |
| 0.783 | 0.783 |
| 0.7831 | 0.783 |
| 0.7832 | 0.783 |
| 0.7833 | 0.784 |
| 0.7834 | 0.784 |
| 0.7835 | 0.784 |
| 0.7836 | 0.784 |
| 0.7837 | 0.784 |
| 0.7838 | 0.784 |
| 0.7839 | 0.784 |
| 0.784 | 0.784 |
| 0.7841 | 0.784 |
| 0.7842 | 0.784 |
| 0.7843 | 0.785 |
| 0.7844 | 0.785 |
| 0.7845 | 0.785 |
| 0.7846 | 0.785 |
| 0.7847 | 0.785 |
| 0.7848 | 0.785 |
| 0.7849 | 0.785 |
| 0.785 | 0.785 |
| 0.7851 | 0.785 |
| 0.7852 | 0.785 |
| 0.7853 | 0.786 |
| 0.7854 | 0.786 |
| 0.7855 | 0.786 |
| 0.7856 | 0.786 |
| 0.7857 | 0.786 |
| 0.7858 | 0.786 |
| 0.7859 | 0.786 |
| 0.786 | 0.786 |
| 0.7861 | 0.786 |
| 0.7862 | 0.786 |
| 0.7863 | 0.787 |
| 0.7864 | 0.787 |
| 0.7865 | 0.787 |
| 0.7866 | 0.787 |
| 0.7867 | 0.787 |
| 0.7868 | 0.787 |
| 0.7869 | 0.787 |
| 0.787 | 0.787 |
| 0.7871 | 0.787 |
| 0.7872 | 0.787 |
| 0.7873 | 0.788 |
| 0.7874 | 0.788 |
| 0.7875 | 0.788 |
| 0.7876 | 0.788 |
| 0.7877 | 0.788 |
| 0.7878 | 0.788 |
| 0.7879 | 0.788 |
| 0.788 | 0.788 |
| 0.7881 | 0.788 |
| 0.7882 | 0.788 |
| 0.7883 | 0.789 |
| 0.7884 | 0.789 |
| 0.7885 | 0.789 |
| 0.7886 | 0.789 |
| 0.7887 | 0.789 |
| 0.7888 | 0.789 |
| 0.7889 | 0.789 |
| 0.789 | 0.789 |
| 0.7891 | 0.789 |
| 0.7892 | 0.789 |
| 0.7893 | 0.79 |
| 0.7894 | 0.79 |
| 0.7895 | 0.79 |
| 0.7896 | 0.79 |
| 0.7897 | 0.79 |
| 0.7898 | 0.79 |
| 0.7899 | 0.79 |
| 0.79 | 0.79 |
| 0.7901 | 0.79 |
| 0.7902 | 0.79 |
| 0.7903 | 0.791 |
| 0.7904 | 0.791 |
| 0.7905 | 0.791 |
| 0.7906 | 0.791 |
| 0.7907 | 0.791 |
| 0.7908 | 0.791 |
| 0.7909 | 0.791 |
| 0.791 | 0.791 |
| 0.7911 | 0.791 |
| 0.7912 | 0.791 |
| 0.7913 | 0.792 |
| 0.7914 | 0.792 |
| 0.7915 | 0.792 |
| 0.7916 | 0.792 |
| 0.7917 | 0.792 |
| 0.7918 | 0.792 |
| 0.7919 | 0.792 |
| 0.792 | 0.792 |
| 0.7921 | 0.792 |
| 0.7922 | 0.792 |
| 0.7923 | 0.793 |
| 0.7924 | 0.793 |
| 0.7925 | 0.793 |
| 0.7926 | 0.793 |
| 0.7927 | 0.793 |
| 0.7928 | 0.793 |
| 0.7929 | 0.793 |
| 0.793 | 0.793 |
| 0.7931 | 0.793 |
| 0.7932 | 0.793 |
| 0.7933 | 0.794 |
| 0.7934 | 0.794 |
| 0.7935 | 0.794 |
| 0.7936 | 0.794 |
| 0.7937 | 0.794 |
| 0.7938 | 0.794 |
| 0.7939 | 0.794 |
| 0.794 | 0.794 |
| 0.7941 | 0.794 |
| 0.7942 | 0.794 |
| 0.7943 | 0.795 |
| 0.7944 | 0.795 |
| 0.7945 | 0.795 |
| 0.7946 | 0.795 |
| 0.7947 | 0.795 |
| 0.7948 | 0.795 |
| 0.7949 | 0.795 |
| 0.795 | 0.795 |
| 0.7951 | 0.795 |
| 0.7952 | 0.795 |
| 0.7953 | 0.796 |
| 0.7954 | 0.796 |
| 0.7955 | 0.796 |
| 0.7956 | 0.796 |
| 0.7957 | 0.796 |
| 0.7958 | 0.796 |
| 0.7959 | 0.796 |
| 0.796 | 0.796 |
| 0.7961 | 0.796 |
| 0.7962 | 0.796 |
| 0.7963 | 0.797 |
| 0.7964 | 0.797 |
| 0.7965 | 0.797 |
| 0.7966 | 0.797 |
| 0.7967 | 0.797 |
| 0.7968 | 0.797 |
| 0.7969 | 0.797 |
| 0.797 | 0.797 |
| 0.7971 | 0.797 |
| 0.7972 | 0.797 |
| 0.7973 | 0.798 |
| 0.7974 | 0.798 |
| 0.7975 | 0.798 |
| 0.7976 | 0.798 |
| 0.7977 | 0.798 |
| 0.7978 | 0.798 |
| 0.7979 | 0.798 |
| 0.798 | 0.798 |
| 0.7981 | 0.798 |
| 0.7982 | 0.798 |
| 0.7983 | 0.799 |
| 0.7984 | 0.799 |
| 0.7985 | 0.799 |
| 0.7986 | 0.799 |
| 0.7987 | 0.799 |
| 0.7988 | 0.799 |
| 0.7989 | 0.799 |
| 0.799 | 0.799 |
| 0.7991 | 0.799 |
| 0.7992 | 0.799 |
| 0.7993 | 0.8 |
| 0.7994 | 0.8 |
| 0.7995 | 0.8 |
| 0.7996 | 0.8 |
| 0.7997 | 0.8 |
| 0.7998 | 0.8 |
| 0.7999 | 0.8 |
| 0.8 | 0.8 |
| 0.8001 | 0.8 |
| 0.8002 | 0.8 |
| 0.8003 | 0.801 |
| 0.8004 | 0.801 |
| 0.8005 | 0.801 |
| 0.8006 | 0.801 |
| 0.8007 | 0.801 |
| 0.8008 | 0.801 |
| 0.8009 | 0.801 |
| 0.801 | 0.801 |
| 0.8011 | 0.801 |
| 0.8012 | 0.801 |
| 0.8013 | 0.802 |
| 0.8014 | 0.802 |
| 0.8015 | 0.802 |
| 0.8016 | 0.802 |
| 0.8017 | 0.802 |
| 0.8018 | 0.802 |
| 0.8019 | 0.802 |
| 0.802 | 0.802 |
| 0.8021 | 0.802 |
| 0.8022 | 0.802 |
| 0.8023 | 0.803 |
| 0.8024 | 0.803 |
| 0.8025 | 0.803 |
| 0.8026 | 0.803 |
| 0.8027 | 0.803 |
| 0.8028 | 0.803 |
| 0.8029 | 0.803 |
| 0.803 | 0.803 |
| 0.8031 | 0.803 |
| 0.8032 | 0.803 |
| 0.8033 | 0.804 |
| 0.8034 | 0.804 |
| 0.8035 | 0.804 |
| 0.8036 | 0.804 |
| 0.8037 | 0.804 |
| 0.8038 | 0.804 |
| 0.8039 | 0.804 |
| 0.804 | 0.804 |
| 0.8041 | 0.804 |
| 0.8042 | 0.804 |
| 0.8043 | 0.805 |
| 0.8044 | 0.805 |
| 0.8045 | 0.805 |
| 0.8046 | 0.805 |
| 0.8047 | 0.805 |
| 0.8048 | 0.805 |
| 0.8049 | 0.805 |
| 0.805 | 0.805 |
| 0.8051 | 0.805 |
| 0.8052 | 0.805 |
| 0.8053 | 0.806 |
| 0.8054 | 0.806 |
| 0.8055 | 0.806 |
| 0.8056 | 0.806 |
| 0.8057 | 0.806 |
| 0.8058 | 0.806 |
| 0.8059 | 0.806 |
| 0.806 | 0.806 |
| 0.8061 | 0.806 |
| 0.8062 | 0.806 |
| 0.8063 | 0.806 |
| 0.8064 | 0.807 |
| 0.8065 | 0.807 |
| 0.8066 | 0.807 |
| 0.8067 | 0.807 |
| 0.8068 | 0.807 |
| 0.8069 | 0.807 |
| 0.807 | 0.807 |
| 0.8071 | 0.807 |
| 0.8072 | 0.807 |
| 0.8073 | 0.807 |
| 0.8074 | 0.808 |
| 0.8075 | 0.808 |
| 0.8076 | 0.808 |
| 0.8077 | 0.808 |
| 0.8078 | 0.808 |
| 0.8079 | 0.808 |
| 0.808 | 0.808 |
| 0.8081 | 0.808 |
| 0.8082 | 0.808 |
| 0.8083 | 0.808 |
| 0.8084 | 0.809 |
| 0.8085 | 0.809 |
| 0.8086 | 0.809 |
| 0.8087 | 0.809 |
| 0.8088 | 0.809 |
| 0.8089 | 0.809 |
| 0.809 | 0.809 |
| 0.8091 | 0.809 |
| 0.8092 | 0.809 |
| 0.8093 | 0.81 |
| 0.8094 | 0.81 |
| 0.8095 | 0.81 |
| 0.8096 | 0.81 |
| 0.8097 | 0.81 |
| 0.8098 | 0.81 |
| 0.8099 | 0.81 |
| 0.81 | 0.81 |
| 0.8101 | 0.81 |
| 0.8102 | 0.81 |
| 0.8103 | 0.81 |
| 0.8104 | 0.811 |
| 0.8105 | 0.811 |
| 0.8106 | 0.811 |
| 0.8107 | 0.811 |
| 0.8108 | 0.811 |
| 0.8109 | 0.811 |
| 0.811 | 0.811 |
| 0.8111 | 0.811 |
| 0.8112 | 0.811 |
| 0.8113 | 0.812 |
| 0.8114 | 0.812 |
| 0.8115 | 0.812 |
| 0.8116 | 0.812 |
| 0.8117 | 0.812 |
| 0.8118 | 0.812 |
| 0.8119 | 0.812 |
| 0.812 | 0.812 |
| 0.8121 | 0.812 |
| 0.8122 | 0.812 |
| 0.8123 | 0.812 |
| 0.8124 | 0.813 |
| 0.8125 | 0.813 |
| 0.8126 | 0.813 |
| 0.8127 | 0.813 |
| 0.8128 | 0.813 |
| 0.8129 | 0.813 |
| 0.813 | 0.813 |
| 0.8131 | 0.813 |
| 0.8132 | 0.813 |
| 0.8133 | 0.813 |
| 0.8134 | 0.814 |
| 0.8135 | 0.814 |
| 0.8136 | 0.814 |
| 0.8137 | 0.814 |
| 0.8138 | 0.814 |
| 0.8139 | 0.814 |
| 0.814 | 0.814 |
| 0.8141 | 0.814 |
| 0.8142 | 0.814 |
| 0.8143 | 0.815 |
| 0.8144 | 0.815 |
| 0.8145 | 0.815 |
| 0.8146 | 0.815 |
| 0.8147 | 0.815 |
| 0.8148 | 0.815 |
| 0.8149 | 0.815 |
| 0.815 | 0.815 |
| 0.8151 | 0.815 |
| 0.8152 | 0.815 |
| 0.8153 | 0.815 |
| 0.8154 | 0.816 |
| 0.8155 | 0.816 |
| 0.8156 | 0.816 |
| 0.8157 | 0.816 |
| 0.8158 | 0.816 |
| 0.8159 | 0.816 |
| 0.816 | 0.816 |
| 0.8161 | 0.816 |
| 0.8162 | 0.816 |
| 0.8163 | 0.816 |
| 0.8164 | 0.817 |
| 0.8165 | 0.817 |
| 0.8166 | 0.817 |
| 0.8167 | 0.817 |
| 0.8168 | 0.817 |
| 0.8169 | 0.817 |
| 0.817 | 0.817 |
| 0.8171 | 0.817 |
| 0.8172 | 0.817 |
| 0.8173 | 0.817 |
| 0.8174 | 0.818 |
| 0.8175 | 0.818 |
| 0.8176 | 0.818 |
| 0.8177 | 0.818 |
| 0.8178 | 0.818 |
| 0.8179 | 0.818 |
| 0.818 | 0.818 |
| 0.8181 | 0.818 |
| 0.8182 | 0.818 |
| 0.8183 | 0.819 |
| 0.8184 | 0.819 |
| 0.8185 | 0.819 |
| 0.8186 | 0.819 |
| 0.8187 | 0.819 |
| 0.8188 | 0.819 |
| 0.8189 | 0.819 |
| 0.819 | 0.819 |
| 0.8191 | 0.819 |
| 0.8192 | 0.819 |
| 0.8193 | 0.819 |
| 0.8194 | 0.82 |
| 0.8195 | 0.82 |
| 0.8196 | 0.82 |
| 0.8197 | 0.82 |
| 0.8198 | 0.82 |
| 0.8199 | 0.82 |
| 0.82 | 0.82 |
| 0.8201 | 0.82 |
| 0.8202 | 0.82 |
| 0.8203 | 0.82 |
| 0.8204 | 0.821 |
| 0.8205 | 0.821 |
| 0.8206 | 0.821 |
| 0.8207 | 0.821 |
| 0.8208 | 0.821 |
| 0.8209 | 0.821 |
| 0.821 | 0.821 |
| 0.8211 | 0.821 |
| 0.8212 | 0.821 |
| 0.8213 | 0.821 |
| 0.8214 | 0.822 |
| 0.8215 | 0.822 |
| 0.8216 | 0.822 |
| 0.8217 | 0.822 |
| 0.8218 | 0.822 |
| 0.8219 | 0.822 |
| 0.822 | 0.822 |
| 0.8221 | 0.822 |
| 0.8222 | 0.822 |
| 0.8223 | 0.822 |
| 0.8224 | 0.823 |
| 0.8225 | 0.823 |
| 0.8226 | 0.823 |
| 0.8227 | 0.823 |
| 0.8228 | 0.823 |
| 0.8229 | 0.823 |
| 0.823 | 0.823 |
| 0.8231 | 0.823 |
| 0.8232 | 0.823 |
| 0.8233 | 0.824 |
| 0.8234 | 0.824 |
| 0.8235 | 0.824 |
| 0.8236 | 0.824 |
| 0.8237 | 0.824 |
| 0.8238 | 0.824 |
| 0.8239 | 0.824 |
| 0.824 | 0.824 |
| 0.8241 | 0.824 |
| 0.8242 | 0.824 |
| 0.8243 | 0.824 |
| 0.8244 | 0.825 |
| 0.8245 | 0.825 |
| 0.8246 | 0.825 |
| 0.8247 | 0.825 |
| 0.8248 | 0.825 |
| 0.8249 | 0.825 |
| 0.825 | 0.825 |
| 0.8251 | 0.825 |
| 0.8252 | 0.825 |
| 0.8253 | 0.825 |
| 0.8254 | 0.826 |
| 0.8255 | 0.826 |
| 0.8256 | 0.826 |
| 0.8257 | 0.826 |
| 0.8258 | 0.826 |
| 0.8259 | 0.826 |
| 0.826 | 0.826 |
| 0.8261 | 0.826 |
| 0.8262 | 0.826 |
| 0.8263 | 0.826 |
| 0.8264 | 0.827 |
| 0.8265 | 0.827 |
| 0.8266 | 0.827 |
| 0.8267 | 0.827 |
| 0.8268 | 0.827 |
| 0.8269 | 0.827 |
| 0.827 | 0.827 |
| 0.8271 | 0.827 |
| 0.8272 | 0.827 |
| 0.8273 | 0.827 |
| 0.8274 | 0.828 |
| 0.8275 | 0.828 |
| 0.8276 | 0.828 |
| 0.8277 | 0.828 |
| 0.8278 | 0.828 |
| 0.8279 | 0.828 |
| 0.828 | 0.828 |
| 0.8281 | 0.828 |
| 0.8282 | 0.828 |
| 0.8283 | 0.828 |
| 0.8284 | 0.829 |
| 0.8285 | 0.829 |
| 0.8286 | 0.829 |
| 0.8287 | 0.829 |
| 0.8288 | 0.829 |
| 0.8289 | 0.829 |
| 0.829 | 0.829 |
| 0.8291 | 0.829 |
| 0.8292 | 0.829 |
| 0.8293 | 0.829 |
| 0.8294 | 0.83 |
| 0.8295 | 0.83 |
| 0.8296 | 0.83 |
| 0.8297 | 0.83 |
| 0.8298 | 0.83 |
| 0.8299 | 0.83 |
| 0.83 | 0.83 |
| 0.8301 | 0.83 |
| 0.8302 | 0.83 |
| 0.8303 | 0.83 |
| 0.8304 | 0.831 |
| 0.8305 | 0.831 |
| 0.8306 | 0.831 |
| 0.8307 | 0.831 |
| 0.8308 | 0.831 |
| 0.8309 | 0.831 |
| 0.831 | 0.831 |
| 0.8311 | 0.831 |
| 0.8312 | 0.831 |
| 0.8313 | 0.831 |
| 0.8314 | 0.832 |
| 0.8315 | 0.832 |
| 0.8316 | 0.832 |
| 0.8317 | 0.832 |
| 0.8318 | 0.832 |
| 0.8319 | 0.832 |
| 0.832 | 0.832 |
| 0.8321 | 0.832 |
| 0.8322 | 0.832 |
| 0.8323 | 0.832 |
| 0.8324 | 0.833 |
| 0.8325 | 0.833 |
| 0.8326 | 0.833 |
| 0.8327 | 0.833 |
| 0.8328 | 0.833 |
| 0.8329 | 0.833 |
| 0.833 | 0.833 |
| 0.8331 | 0.833 |
| 0.8332 | 0.833 |
| 0.8333 | 0.833 |
| 0.8334 | 0.834 |
| 0.8335 | 0.834 |
| 0.8336 | 0.834 |
| 0.8337 | 0.834 |
| 0.8338 | 0.834 |
| 0.8339 | 0.834 |
| 0.834 | 0.834 |
| 0.8341 | 0.834 |
| 0.8342 | 0.834 |
| 0.8343 | 0.834 |
| 0.8344 | 0.834 |
| 0.8345 | 0.835 |
| 0.8346 | 0.835 |
| 0.8347 | 0.835 |
| 0.8348 | 0.835 |
| 0.8349 | 0.835 |
| 0.835 | 0.835 |
| 0.8351 | 0.835 |
| 0.8352 | 0.835 |
| 0.8353 | 0.835 |
| 0.8354 | 0.836 |
| 0.8355 | 0.836 |
| 0.8356 | 0.836 |
| 0.8357 | 0.836 |
| 0.8358 | 0.836 |
| 0.8359 | 0.836 |
| 0.836 | 0.836 |
| 0.8361 | 0.836 |
| 0.8362 | 0.836 |
| 0.8363 | 0.836 |
| 0.8364 | 0.837 |
| 0.8365 | 0.837 |
| 0.8366 | 0.837 |
| 0.8367 | 0.837 |
| 0.8368 | 0.837 |
| 0.8369 | 0.837 |
| 0.837 | 0.837 |
| 0.8371 | 0.837 |
| 0.8372 | 0.837 |
| 0.8373 | 0.837 |
| 0.8374 | 0.838 |
| 0.8375 | 0.838 |
| 0.8376 | 0.838 |
| 0.8377 | 0.838 |
| 0.8378 | 0.838 |
| 0.8379 | 0.838 |
| 0.838 | 0.838 |
| 0.8381 | 0.838 |
| 0.8382 | 0.838 |
| 0.8383 | 0.838 |
| 0.8384 | 0.839 |
| 0.8385 | 0.839 |
| 0.8386 | 0.839 |
| 0.8387 | 0.839 |
| 0.8388 | 0.839 |
| 0.8389 | 0.839 |
| 0.839 | 0.839 |
| 0.8391 | 0.839 |
| 0.8392 | 0.839 |
| 0.8393 | 0.839 |
| 0.8394 | 0.84 |
| 0.8395 | 0.84 |
| 0.8396 | 0.84 |
| 0.8397 | 0.84 |
| 0.8398 | 0.84 |
| 0.8399 | 0.84 |
| 0.84 | 0.84 |
| 0.8401 | 0.84 |
| 0.8402 | 0.84 |
| 0.8403 | 0.84 |
| 0.8404 | 0.841 |
| 0.8405 | 0.841 |
| 0.8406 | 0.841 |
| 0.8407 | 0.841 |
| 0.8408 | 0.841 |
| 0.8409 | 0.841 |
| 0.841 | 0.841 |
| 0.8411 | 0.841 |
| 0.8412 | 0.841 |
| 0.8413 | 0.841 |
| 0.8414 | 0.842 |
| 0.8415 | 0.842 |
| 0.8416 | 0.842 |
| 0.8417 | 0.842 |
| 0.8418 | 0.842 |
| 0.8419 | 0.842 |
| 0.842 | 0.842 |
| 0.8421 | 0.842 |
| 0.8422 | 0.842 |
| 0.8423 | 0.842 |
| 0.8424 | 0.843 |
| 0.8425 | 0.843 |
| 0.8426 | 0.843 |
| 0.8427 | 0.843 |
| 0.8428 | 0.843 |
| 0.8429 | 0.843 |
| 0.843 | 0.843 |
| 0.8431 | 0.843 |
| 0.8432 | 0.843 |
| 0.8433 | 0.843 |
| 0.8434 | 0.844 |
| 0.8435 | 0.844 |
| 0.8436 | 0.844 |
| 0.8437 | 0.844 |
| 0.8438 | 0.844 |
| 0.8439 | 0.844 |
| 0.844 | 0.844 |
| 0.8441 | 0.844 |
| 0.8442 | 0.844 |
| 0.8443 | 0.844 |
| 0.8444 | 0.845 |
| 0.8445 | 0.845 |
| 0.8446 | 0.845 |
| 0.8447 | 0.845 |
| 0.8448 | 0.845 |
| 0.8449 | 0.845 |
| 0.845 | 0.845 |
| 0.8451 | 0.845 |
| 0.8452 | 0.845 |
| 0.8453 | 0.845 |
| 0.8454 | 0.846 |
| 0.8455 | 0.846 |
| 0.8456 | 0.846 |
| 0.8457 | 0.846 |
| 0.8458 | 0.846 |
| 0.8459 | 0.846 |
| 0.846 | 0.846 |
| 0.8461 | 0.846 |
| 0.8462 | 0.846 |
| 0.8463 | 0.846 |
| 0.8464 | 0.846 |
| 0.8465 | 0.847 |
| 0.8466 | 0.847 |
| 0.8467 | 0.847 |
| 0.8468 | 0.847 |
| 0.8469 | 0.847 |
| 0.847 | 0.847 |
| 0.8471 | 0.847 |
| 0.8472 | 0.847 |
| 0.8473 | 0.847 |
| 0.8474 | 0.848 |
| 0.8475 | 0.848 |
| 0.8476 | 0.848 |
| 0.8477 | 0.848 |
| 0.8478 | 0.848 |
| 0.8479 | 0.848 |
| 0.848 | 0.848 |
| 0.8481 | 0.848 |
| 0.8482 | 0.848 |
| 0.8483 | 0.848 |
| 0.8484 | 0.848 |
| 0.8485 | 0.849 |
| 0.8486 | 0.849 |
| 0.8487 | 0.849 |
| 0.8488 | 0.849 |
| 0.8489 | 0.849 |
| 0.849 | 0.849 |
| 0.8491 | 0.849 |
| 0.8492 | 0.849 |
| 0.8493 | 0.849 |
| 0.8494 | 0.85 |
| 0.8495 | 0.85 |
| 0.8496 | 0.85 |
| 0.8497 | 0.85 |
| 0.8498 | 0.85 |
| 0.8499 | 0.85 |
| 0.85 | 0.85 |
| 0.8501 | 0.85 |
| 0.8502 | 0.85 |
| 0.8503 | 0.85 |
| 0.8504 | 0.85 |
| 0.8505 | 0.851 |
| 0.8506 | 0.851 |
| 0.8507 | 0.851 |
| 0.8508 | 0.851 |
| 0.8509 | 0.851 |
| 0.851 | 0.851 |
| 0.8511 | 0.851 |
| 0.8512 | 0.851 |
| 0.8513 | 0.851 |
| 0.8514 | 0.851 |
| 0.8515 | 0.852 |
| 0.8516 | 0.852 |
| 0.8517 | 0.852 |
| 0.8518 | 0.852 |
| 0.8519 | 0.852 |
| 0.852 | 0.852 |
| 0.8521 | 0.852 |
| 0.8522 | 0.852 |
| 0.8523 | 0.852 |
| 0.8524 | 0.852 |
| 0.8525 | 0.853 |
| 0.8526 | 0.853 |
| 0.8527 | 0.853 |
| 0.8528 | 0.853 |
| 0.8529 | 0.853 |
| 0.853 | 0.853 |
| 0.8531 | 0.853 |
| 0.8532 | 0.853 |
| 0.8533 | 0.853 |
| 0.8534 | 0.853 |
| 0.8535 | 0.854 |
| 0.8536 | 0.854 |
| 0.8537 | 0.854 |
| 0.8538 | 0.854 |
| 0.8539 | 0.854 |
| 0.854 | 0.854 |
| 0.8541 | 0.854 |
| 0.8542 | 0.854 |
| 0.8543 | 0.854 |
| 0.8544 | 0.854 |
| 0.8545 | 0.855 |
| 0.8546 | 0.855 |
| 0.8547 | 0.855 |
| 0.8548 | 0.855 |
| 0.8549 | 0.855 |
| 0.855 | 0.855 |
| 0.8551 | 0.855 |
| 0.8552 | 0.855 |
| 0.8553 | 0.855 |
| 0.8554 | 0.855 |
| 0.8555 | 0.856 |
| 0.8556 | 0.856 |
| 0.8557 | 0.856 |
| 0.8558 | 0.856 |
| 0.8559 | 0.856 |
| 0.856 | 0.856 |
| 0.8561 | 0.856 |
| 0.8562 | 0.856 |
| 0.8563 | 0.856 |
| 0.8564 | 0.856 |
| 0.8565 | 0.857 |
| 0.8566 | 0.857 |
| 0.8567 | 0.857 |
| 0.8568 | 0.857 |
| 0.8569 | 0.857 |
| 0.857 | 0.857 |
| 0.8571 | 0.857 |
| 0.8572 | 0.857 |
| 0.8573 | 0.857 |
| 0.8574 | 0.857 |
| 0.8575 | 0.858 |
| 0.8576 | 0.858 |
| 0.8577 | 0.858 |
| 0.8578 | 0.858 |
| 0.8579 | 0.858 |
| 0.858 | 0.858 |
| 0.8581 | 0.858 |
| 0.8582 | 0.858 |
| 0.8583 | 0.858 |
| 0.8584 | 0.858 |
| 0.8585 | 0.859 |
| 0.8586 | 0.859 |
| 0.8587 | 0.859 |
| 0.8588 | 0.859 |
| 0.8589 | 0.859 |
| 0.859 | 0.859 |
| 0.8591 | 0.859 |
| 0.8592 | 0.859 |
| 0.8593 | 0.859 |
| 0.8594 | 0.859 |
| 0.8595 | 0.86 |
| 0.8596 | 0.86 |
| 0.8597 | 0.86 |
| 0.8598 | 0.86 |
| 0.8599 | 0.86 |
| 0.86 | 0.86 |
| 0.8601 | 0.86 |
| 0.8602 | 0.86 |
| 0.8603 | 0.86 |
| 0.8604 | 0.86 |
| 0.8605 | 0.861 |
| 0.8606 | 0.861 |
| 0.8607 | 0.861 |
| 0.8608 | 0.861 |
| 0.8609 | 0.861 |
| 0.861 | 0.861 |
| 0.8611 | 0.861 |
| 0.8612 | 0.861 |
| 0.8613 | 0.861 |
| 0.8614 | 0.861 |
| 0.8615 | 0.862 |
| 0.8616 | 0.862 |
| 0.8617 | 0.862 |
| 0.8618 | 0.862 |
| 0.8619 | 0.862 |
| 0.862 | 0.862 |
| 0.8621 | 0.862 |
| 0.8622 | 0.862 |
| 0.8623 | 0.862 |
| 0.8624 | 0.862 |
| 0.8625 | 0.863 |
| 0.8626 | 0.863 |
| 0.8627 | 0.863 |
| 0.8628 | 0.863 |
| 0.8629 | 0.863 |
| 0.863 | 0.863 |
| 0.8631 | 0.863 |
| 0.8632 | 0.863 |
| 0.8633 | 0.863 |
| 0.8634 | 0.863 |
| 0.8635 | 0.864 |
| 0.8636 | 0.864 |
| 0.8637 | 0.864 |
| 0.8638 | 0.864 |
| 0.8639 | 0.864 |
| 0.864 | 0.864 |
| 0.8641 | 0.864 |
| 0.8642 | 0.864 |
| 0.8643 | 0.864 |
| 0.8644 | 0.864 |
| 0.8645 | 0.865 |
| 0.8646 | 0.865 |
| 0.8647 | 0.865 |
| 0.8648 | 0.865 |
| 0.8649 | 0.865 |
| 0.865 | 0.865 |
| 0.8651 | 0.865 |
| 0.8652 | 0.865 |
| 0.8653 | 0.865 |
| 0.8654 | 0.865 |
| 0.8655 | 0.866 |
| 0.8656 | 0.866 |
| 0.8657 | 0.866 |
| 0.8658 | 0.866 |
| 0.8659 | 0.866 |
| 0.866 | 0.866 |
| 0.8661 | 0.866 |
| 0.8662 | 0.866 |
| 0.8663 | 0.866 |
| 0.8664 | 0.866 |
| 0.8665 | 0.867 |
| 0.8666 | 0.867 |
| 0.8667 | 0.867 |
| 0.8668 | 0.867 |
| 0.8669 | 0.867 |
| 0.867 | 0.867 |
| 0.8671 | 0.867 |
| 0.8672 | 0.867 |
| 0.8673 | 0.867 |
| 0.8674 | 0.867 |
| 0.8675 | 0.868 |
| 0.8676 | 0.868 |
| 0.8677 | 0.868 |
| 0.8678 | 0.868 |
| 0.8679 | 0.868 |
| 0.868 | 0.868 |
| 0.8681 | 0.868 |
| 0.8682 | 0.868 |
| 0.8683 | 0.868 |
| 0.8684 | 0.868 |
| 0.8685 | 0.869 |
| 0.8686 | 0.869 |
| 0.8687 | 0.869 |
| 0.8688 | 0.869 |
| 0.8689 | 0.869 |
| 0.869 | 0.869 |
| 0.8691 | 0.869 |
| 0.8692 | 0.869 |
| 0.8693 | 0.869 |
| 0.8694 | 0.869 |
| 0.8695 | 0.87 |
| 0.8696 | 0.87 |
| 0.8697 | 0.87 |
| 0.8698 | 0.87 |
| 0.8699 | 0.87 |
| 0.87 | 0.87 |
| 0.8701 | 0.87 |
| 0.8702 | 0.87 |
| 0.8703 | 0.87 |
| 0.8704 | 0.87 |
| 0.8705 | 0.871 |
| 0.8706 | 0.871 |
| 0.8707 | 0.871 |
| 0.8708 | 0.871 |
| 0.8709 | 0.871 |
| 0.871 | 0.871 |
| 0.8711 | 0.871 |
| 0.8712 | 0.871 |
| 0.8713 | 0.871 |
| 0.8714 | 0.871 |
| 0.8715 | 0.872 |
| 0.8716 | 0.872 |
| 0.8717 | 0.872 |
| 0.8718 | 0.872 |
| 0.8719 | 0.872 |
| 0.872 | 0.872 |
| 0.8721 | 0.872 |
| 0.8722 | 0.872 |
| 0.8723 | 0.872 |
| 0.8724 | 0.872 |
| 0.8725 | 0.873 |
| 0.8726 | 0.873 |
| 0.8727 | 0.873 |
| 0.8728 | 0.873 |
| 0.8729 | 0.873 |
| 0.873 | 0.873 |
| 0.8731 | 0.873 |
| 0.8732 | 0.873 |
| 0.8733 | 0.873 |
| 0.8734 | 0.873 |
| 0.8735 | 0.874 |
| 0.8736 | 0.874 |
| 0.8737 | 0.874 |
| 0.8738 | 0.874 |
| 0.8739 | 0.874 |
| 0.874 | 0.874 |
| 0.8741 | 0.874 |
| 0.8742 | 0.874 |
| 0.8743 | 0.874 |
| 0.8744 | 0.874 |
| 0.8745 | 0.875 |
| 0.8746 | 0.875 |
| 0.8747 | 0.875 |
| 0.8748 | 0.875 |
| 0.8749 | 0.875 |
| 0.875 | 0.875 |
| 0.8751 | 0.875 |
| 0.8752 | 0.875 |
| 0.8753 | 0.875 |
| 0.8754 | 0.875 |
| 0.8755 | 0.876 |
| 0.8756 | 0.876 |
| 0.8757 | 0.876 |
| 0.8758 | 0.876 |
| 0.8759 | 0.876 |
| 0.876 | 0.876 |
| 0.8761 | 0.876 |
| 0.8762 | 0.876 |
| 0.8763 | 0.876 |
| 0.8764 | 0.876 |
| 0.8765 | 0.877 |
| 0.8766 | 0.877 |
| 0.8767 | 0.877 |
| 0.8768 | 0.877 |
| 0.8769 | 0.877 |
| 0.877 | 0.877 |
| 0.8771 | 0.877 |
| 0.8772 | 0.877 |
| 0.8773 | 0.877 |
| 0.8774 | 0.877 |
| 0.8775 | 0.878 |
| 0.8776 | 0.878 |
| 0.8777 | 0.878 |
| 0.8778 | 0.878 |
| 0.8779 | 0.878 |
| 0.878 | 0.878 |
| 0.8781 | 0.878 |
| 0.8782 | 0.878 |
| 0.8783 | 0.878 |
| 0.8784 | 0.878 |
| 0.8785 | 0.879 |
| 0.8786 | 0.879 |
| 0.8787 | 0.879 |
| 0.8788 | 0.879 |
| 0.8789 | 0.879 |
| 0.879 | 0.879 |
| 0.8791 | 0.879 |
| 0.8792 | 0.879 |
| 0.8793 | 0.879 |
| 0.8794 | 0.879 |
| 0.8795 | 0.88 |
| 0.8796 | 0.88 |
| 0.8797 | 0.88 |
| 0.8798 | 0.88 |
| 0.8799 | 0.88 |
| 0.88 | 0.88 |
| 0.8801 | 0.88 |
| 0.8802 | 0.88 |
| 0.8803 | 0.88 |
| 0.8804 | 0.88 |
| 0.8805 | 0.881 |
| 0.8806 | 0.881 |
| 0.8807 | 0.881 |
| 0.8808 | 0.881 |
| 0.8809 | 0.881 |
| 0.881 | 0.881 |
| 0.8811 | 0.881 |
| 0.8812 | 0.881 |
| 0.8813 | 0.881 |
| 0.8814 | 0.881 |
| 0.8815 | 0.882 |
| 0.8816 | 0.882 |
| 0.8817 | 0.882 |
| 0.8818 | 0.882 |
| 0.8819 | 0.882 |
| 0.882 | 0.882 |
| 0.8821 | 0.882 |
| 0.8822 | 0.882 |
| 0.8823 | 0.882 |
| 0.8824 | 0.882 |
| 0.8825 | 0.883 |
| 0.8826 | 0.883 |
| 0.8827 | 0.883 |
| 0.8828 | 0.883 |
| 0.8829 | 0.883 |
| 0.883 | 0.883 |
| 0.8831 | 0.883 |
| 0.8832 | 0.883 |
| 0.8833 | 0.883 |
| 0.8834 | 0.883 |
| 0.8835 | 0.884 |
| 0.8836 | 0.884 |
| 0.8837 | 0.884 |
| 0.8838 | 0.884 |
| 0.8839 | 0.884 |
| 0.884 | 0.884 |
| 0.8841 | 0.884 |
| 0.8842 | 0.884 |
| 0.8843 | 0.884 |
| 0.8844 | 0.884 |
| 0.8845 | 0.885 |
| 0.8846 | 0.885 |
| 0.8847 | 0.885 |
| 0.8848 | 0.885 |
| 0.8849 | 0.885 |
| 0.885 | 0.885 |
| 0.8851 | 0.885 |
| 0.8852 | 0.885 |
| 0.8853 | 0.885 |
| 0.8854 | 0.885 |
| 0.8855 | 0.886 |
| 0.8856 | 0.886 |
| 0.8857 | 0.886 |
| 0.8858 | 0.886 |
| 0.8859 | 0.886 |
| 0.886 | 0.886 |
| 0.8861 | 0.886 |
| 0.8862 | 0.886 |
| 0.8863 | 0.886 |
| 0.8864 | 0.886 |
| 0.8865 | 0.887 |
| 0.8866 | 0.887 |
| 0.8867 | 0.887 |
| 0.8868 | 0.887 |
| 0.8869 | 0.887 |
| 0.887 | 0.887 |
| 0.8871 | 0.887 |
| 0.8872 | 0.887 |
| 0.8873 | 0.887 |
| 0.8874 | 0.887 |
| 0.8875 | 0.888 |
| 0.8876 | 0.888 |
| 0.8877 | 0.888 |
| 0.8878 | 0.888 |
| 0.8879 | 0.888 |
| 0.888 | 0.888 |
| 0.8881 | 0.888 |
| 0.8882 | 0.888 |
| 0.8883 | 0.888 |
| 0.8884 | 0.888 |
| 0.8885 | 0.888 |
| 0.8886 | 0.889 |
| 0.8887 | 0.889 |
| 0.8888 | 0.889 |
| 0.8889 | 0.889 |
| 0.889 | 0.889 |
| 0.8891 | 0.889 |
| 0.8892 | 0.889 |
| 0.8893 | 0.889 |
| 0.8894 | 0.889 |
| 0.8895 | 0.89 |
| 0.8896 | 0.89 |
| 0.8897 | 0.89 |
| 0.8898 | 0.89 |
| 0.8899 | 0.89 |
| 0.89 | 0.89 |
| 0.8901 | 0.89 |
| 0.8902 | 0.89 |
| 0.8903 | 0.89 |
| 0.8904 | 0.89 |
| 0.8905 | 0.89 |
| 0.8906 | 0.891 |
| 0.8907 | 0.891 |
| 0.8908 | 0.891 |
| 0.8909 | 0.891 |
| 0.891 | 0.891 |
| 0.8911 | 0.891 |
| 0.8912 | 0.891 |
| 0.8913 | 0.891 |
| 0.8914 | 0.891 |
| 0.8915 | 0.892 |
| 0.8916 | 0.892 |
| 0.8917 | 0.892 |
| 0.8918 | 0.892 |
| 0.8919 | 0.892 |
| 0.892 | 0.892 |
| 0.8921 | 0.892 |
| 0.8922 | 0.892 |
| 0.8923 | 0.892 |
| 0.8924 | 0.892 |
| 0.8925 | 0.893 |
| 0.8926 | 0.893 |
| 0.8927 | 0.893 |
| 0.8928 | 0.893 |
| 0.8929 | 0.893 |
| 0.893 | 0.893 |
| 0.8931 | 0.893 |
| 0.8932 | 0.893 |
| 0.8933 | 0.893 |
| 0.8934 | 0.893 |
| 0.8935 | 0.894 |
| 0.8936 | 0.894 |
| 0.8937 | 0.894 |
| 0.8938 | 0.894 |
| 0.8939 | 0.894 |
| 0.894 | 0.894 |
| 0.8941 | 0.894 |
| 0.8942 | 0.894 |
| 0.8943 | 0.894 |
| 0.8944 | 0.894 |
| 0.8945 | 0.894 |
| 0.8946 | 0.895 |
| 0.8947 | 0.895 |
| 0.8948 | 0.895 |
| 0.8949 | 0.895 |
| 0.895 | 0.895 |
| 0.8951 | 0.895 |
| 0.8952 | 0.895 |
| 0.8953 | 0.895 |
| 0.8954 | 0.895 |
| 0.8955 | 0.896 |
| 0.8956 | 0.896 |
| 0.8957 | 0.896 |
| 0.8958 | 0.896 |
| 0.8959 | 0.896 |
| 0.896 | 0.896 |
| 0.8961 | 0.896 |
| 0.8962 | 0.896 |
| 0.8963 | 0.896 |
| 0.8964 | 0.896 |
| 0.8965 | 0.897 |
| 0.8966 | 0.897 |
| 0.8967 | 0.897 |
| 0.8968 | 0.897 |
| 0.8969 | 0.897 |
| 0.897 | 0.897 |
| 0.8971 | 0.897 |
| 0.8972 | 0.897 |
| 0.8973 | 0.897 |
| 0.8974 | 0.897 |
| 0.8975 | 0.898 |
| 0.8976 | 0.898 |
| 0.8977 | 0.898 |
| 0.8978 | 0.898 |
| 0.8979 | 0.898 |
| 0.898 | 0.898 |
| 0.8981 | 0.898 |
| 0.8982 | 0.898 |
| 0.8983 | 0.898 |
| 0.8984 | 0.898 |
| 0.8985 | 0.898 |
| 0.8986 | 0.899 |
| 0.8987 | 0.899 |
| 0.8988 | 0.899 |
| 0.8989 | 0.899 |
| 0.899 | 0.899 |
| 0.8991 | 0.899 |
| 0.8992 | 0.899 |
| 0.8993 | 0.899 |
| 0.8994 | 0.899 |
| 0.8995 | 0.9 |
| 0.8996 | 0.9 |
| 0.8997 | 0.9 |
| 0.8998 | 0.9 |
| 0.8999 | 0.9 |
| 0.9 | 0.9 |
| 0.9001 | 0.9 |
| 0.9002 | 0.9 |
| 0.9003 | 0.9 |
| 0.9004 | 0.9 |
| 0.9005 | 0.901 |
| 0.9006 | 0.901 |
| 0.9007 | 0.901 |
| 0.9008 | 0.901 |
| 0.9009 | 0.901 |
| 0.901 | 0.901 |
| 0.9011 | 0.901 |
| 0.9012 | 0.901 |
| 0.9013 | 0.901 |
| 0.9014 | 0.901 |
| 0.9015 | 0.902 |
| 0.9016 | 0.902 |
| 0.9017 | 0.902 |
| 0.9018 | 0.902 |
| 0.9019 | 0.902 |
| 0.902 | 0.902 |
| 0.9021 | 0.902 |
| 0.9022 | 0.902 |
| 0.9023 | 0.902 |
| 0.9024 | 0.902 |
| 0.9025 | 0.902 |
| 0.9026 | 0.903 |
| 0.9027 | 0.903 |
| 0.9028 | 0.903 |
| 0.9029 | 0.903 |
| 0.903 | 0.903 |
| 0.9031 | 0.903 |
| 0.9032 | 0.903 |
| 0.9033 | 0.903 |
| 0.9034 | 0.903 |
| 0.9035 | 0.904 |
| 0.9036 | 0.904 |
| 0.9037 | 0.904 |
| 0.9038 | 0.904 |
| 0.9039 | 0.904 |
| 0.904 | 0.904 |
| 0.9041 | 0.904 |
| 0.9042 | 0.904 |
| 0.9043 | 0.904 |
| 0.9044 | 0.904 |
| 0.9045 | 0.904 |
| 0.9046 | 0.905 |
| 0.9047 | 0.905 |
| 0.9048 | 0.905 |
| 0.9049 | 0.905 |
| 0.905 | 0.905 |
| 0.9051 | 0.905 |
| 0.9052 | 0.905 |
| 0.9053 | 0.905 |
| 0.9054 | 0.905 |
| 0.9055 | 0.906 |
| 0.9056 | 0.906 |
| 0.9057 | 0.906 |
| 0.9058 | 0.906 |
| 0.9059 | 0.906 |
| 0.906 | 0.906 |
| 0.9061 | 0.906 |
| 0.9062 | 0.906 |
| 0.9063 | 0.906 |
| 0.9064 | 0.906 |
| 0.9065 | 0.906 |
| 0.9066 | 0.907 |
| 0.9067 | 0.907 |
| 0.9068 | 0.907 |
| 0.9069 | 0.907 |
| 0.907 | 0.907 |
| 0.9071 | 0.907 |
| 0.9072 | 0.907 |
| 0.9073 | 0.907 |
| 0.9074 | 0.907 |
| 0.9075 | 0.908 |
| 0.9076 | 0.908 |
| 0.9077 | 0.908 |
| 0.9078 | 0.908 |
| 0.9079 | 0.908 |
| 0.908 | 0.908 |
| 0.9081 | 0.908 |
| 0.9082 | 0.908 |
| 0.9083 | 0.908 |
| 0.9084 | 0.908 |
| 0.9085 | 0.908 |
| 0.9086 | 0.909 |
| 0.9087 | 0.909 |
| 0.9088 | 0.909 |
| 0.9089 | 0.909 |
| 0.909 | 0.909 |
| 0.9091 | 0.909 |
| 0.9092 | 0.909 |
| 0.9093 | 0.909 |
| 0.9094 | 0.909 |
| 0.9095 | 0.909 |
| 0.9096 | 0.91 |
| 0.9097 | 0.91 |
| 0.9098 | 0.91 |
| 0.9099 | 0.91 |
| 0.91 | 0.91 |
| 0.9101 | 0.91 |
| 0.9102 | 0.91 |
| 0.9103 | 0.91 |
| 0.9104 | 0.91 |
| 0.9105 | 0.91 |
| 0.9106 | 0.911 |
| 0.9107 | 0.911 |
| 0.9108 | 0.911 |
| 0.9109 | 0.911 |
| 0.911 | 0.911 |
| 0.9111 | 0.911 |
| 0.9112 | 0.911 |
| 0.9113 | 0.911 |
| 0.9114 | 0.911 |
| 0.9115 | 0.912 |
| 0.9116 | 0.912 |
| 0.9117 | 0.912 |
| 0.9118 | 0.912 |
| 0.9119 | 0.912 |
| 0.912 | 0.912 |
| 0.9121 | 0.912 |
| 0.9122 | 0.912 |
| 0.9123 | 0.912 |
| 0.9124 | 0.912 |
| 0.9125 | 0.912 |
| 0.9126 | 0.913 |
| 0.9127 | 0.913 |
| 0.9128 | 0.913 |
| 0.9129 | 0.913 |
| 0.913 | 0.913 |
| 0.9131 | 0.913 |
| 0.9132 | 0.913 |
| 0.9133 | 0.913 |
| 0.9134 | 0.913 |
| 0.9135 | 0.914 |
| 0.9136 | 0.914 |
| 0.9137 | 0.914 |
| 0.9138 | 0.914 |
| 0.9139 | 0.914 |
| 0.914 | 0.914 |
| 0.9141 | 0.914 |
| 0.9142 | 0.914 |
| 0.9143 | 0.914 |
| 0.9144 | 0.914 |
| 0.9145 | 0.914 |
| 0.9146 | 0.915 |
| 0.9147 | 0.915 |
| 0.9148 | 0.915 |
| 0.9149 | 0.915 |
| 0.915 | 0.915 |
| 0.9151 | 0.915 |
| 0.9152 | 0.915 |
| 0.9153 | 0.915 |
| 0.9154 | 0.915 |
| 0.9155 | 0.915 |
| 0.9156 | 0.916 |
| 0.9157 | 0.916 |
| 0.9158 | 0.916 |
| 0.9159 | 0.916 |
| 0.916 | 0.916 |
| 0.9161 | 0.916 |
| 0.9162 | 0.916 |
| 0.9163 | 0.916 |
| 0.9164 | 0.916 |
| 0.9165 | 0.916 |
| 0.9166 | 0.917 |
| 0.9167 | 0.917 |
| 0.9168 | 0.917 |
| 0.9169 | 0.917 |
| 0.917 | 0.917 |
| 0.9171 | 0.917 |
| 0.9172 | 0.917 |
| 0.9173 | 0.917 |
| 0.9174 | 0.917 |
| 0.9175 | 0.917 |
| 0.9176 | 0.918 |
| 0.9177 | 0.918 |
| 0.9178 | 0.918 |
| 0.9179 | 0.918 |
| 0.918 | 0.918 |
| 0.9181 | 0.918 |
| 0.9182 | 0.918 |
| 0.9183 | 0.918 |
| 0.9184 | 0.918 |
| 0.9185 | 0.918 |
| 0.9186 | 0.919 |
| 0.9187 | 0.919 |
| 0.9188 | 0.919 |
| 0.9189 | 0.919 |
| 0.919 | 0.919 |
| 0.9191 | 0.919 |
| 0.9192 | 0.919 |
| 0.9193 | 0.919 |
| 0.9194 | 0.919 |
| 0.9195 | 0.919 |
| 0.9196 | 0.92 |
| 0.9197 | 0.92 |
| 0.9198 | 0.92 |
| 0.9199 | 0.92 |
| 0.92 | 0.92 |
| 0.9201 | 0.92 |
| 0.9202 | 0.92 |
| 0.9203 | 0.92 |
| 0.9204 | 0.92 |
| 0.9205 | 0.92 |
| 0.9206 | 0.921 |
| 0.9207 | 0.921 |
| 0.9208 | 0.921 |
| 0.9209 | 0.921 |
| 0.921 | 0.921 |
| 0.9211 | 0.921 |
| 0.9212 | 0.921 |
| 0.9213 | 0.921 |
| 0.9214 | 0.921 |
| 0.9215 | 0.921 |
| 0.9216 | 0.922 |
| 0.9217 | 0.922 |
| 0.9218 | 0.922 |
| 0.9219 | 0.922 |
| 0.922 | 0.922 |
| 0.9221 | 0.922 |
| 0.9222 | 0.922 |
| 0.9223 | 0.922 |
| 0.9224 | 0.922 |
| 0.9225 | 0.922 |
| 0.9226 | 0.923 |
| 0.9227 | 0.923 |
| 0.9228 | 0.923 |
| 0.9229 | 0.923 |
| 0.923 | 0.923 |
| 0.9231 | 0.923 |
| 0.9232 | 0.923 |
| 0.9233 | 0.923 |
| 0.9234 | 0.923 |
| 0.9235 | 0.923 |
| 0.9236 | 0.924 |
| 0.9237 | 0.924 |
| 0.9238 | 0.924 |
| 0.9239 | 0.924 |
| 0.924 | 0.924 |
| 0.9241 | 0.924 |
| 0.9242 | 0.924 |
| 0.9243 | 0.924 |
| 0.9244 | 0.924 |
| 0.9245 | 0.924 |
| 0.9246 | 0.925 |
| 0.9247 | 0.925 |
| 0.9248 | 0.925 |
| 0.9249 | 0.925 |
| 0.925 | 0.925 |
| 0.9251 | 0.925 |
| 0.9252 | 0.925 |
| 0.9253 | 0.925 |
| 0.9254 | 0.925 |
| 0.9255 | 0.925 |
| 0.9256 | 0.926 |
| 0.9257 | 0.926 |
| 0.9258 | 0.926 |
| 0.9259 | 0.926 |
| 0.926 | 0.926 |
| 0.9261 | 0.926 |
| 0.9262 | 0.926 |
| 0.9263 | 0.926 |
| 0.9264 | 0.926 |
| 0.9265 | 0.926 |
| 0.9266 | 0.927 |
| 0.9267 | 0.927 |
| 0.9268 | 0.927 |
| 0.9269 | 0.927 |
| 0.927 | 0.927 |
| 0.9271 | 0.927 |
| 0.9272 | 0.927 |
| 0.9273 | 0.927 |
| 0.9274 | 0.927 |
| 0.9275 | 0.927 |
| 0.9276 | 0.928 |
| 0.9277 | 0.928 |
| 0.9278 | 0.928 |
| 0.9279 | 0.928 |
| 0.928 | 0.928 |
| 0.9281 | 0.928 |
| 0.9282 | 0.928 |
| 0.9283 | 0.928 |
| 0.9284 | 0.928 |
| 0.9285 | 0.928 |
| 0.9286 | 0.929 |
| 0.9287 | 0.929 |
| 0.9288 | 0.929 |
| 0.9289 | 0.929 |
| 0.929 | 0.929 |
| 0.9291 | 0.929 |
| 0.9292 | 0.929 |
| 0.9293 | 0.929 |
| 0.9294 | 0.929 |
| 0.9295 | 0.929 |
| 0.9296 | 0.93 |
| 0.9297 | 0.93 |
| 0.9298 | 0.93 |
| 0.9299 | 0.93 |
| 0.93 | 0.93 |
| 0.9301 | 0.93 |
| 0.9302 | 0.93 |
| 0.9303 | 0.93 |
| 0.9304 | 0.93 |
| 0.9305 | 0.93 |
| 0.9306 | 0.931 |
| 0.9307 | 0.931 |
| 0.9308 | 0.931 |
| 0.9309 | 0.931 |
| 0.931 | 0.931 |
| 0.9311 | 0.931 |
| 0.9312 | 0.931 |
| 0.9313 | 0.931 |
| 0.9314 | 0.931 |
| 0.9315 | 0.931 |
| 0.9316 | 0.932 |
| 0.9317 | 0.932 |
| 0.9318 | 0.932 |
| 0.9319 | 0.932 |
| 0.932 | 0.932 |
| 0.9321 | 0.932 |
| 0.9322 | 0.932 |
| 0.9323 | 0.932 |
| 0.9324 | 0.932 |
| 0.9325 | 0.932 |
| 0.9326 | 0.933 |
| 0.9327 | 0.933 |
| 0.9328 | 0.933 |
| 0.9329 | 0.933 |
| 0.933 | 0.933 |
| 0.9331 | 0.933 |
| 0.9332 | 0.933 |
| 0.9333 | 0.933 |
| 0.9334 | 0.933 |
| 0.9335 | 0.933 |
| 0.9336 | 0.934 |
| 0.9337 | 0.934 |
| 0.9338 | 0.934 |
| 0.9339 | 0.934 |
| 0.934 | 0.934 |
| 0.9341 | 0.934 |
| 0.9342 | 0.934 |
| 0.9343 | 0.934 |
| 0.9344 | 0.934 |
| 0.9345 | 0.934 |
| 0.9346 | 0.935 |
| 0.9347 | 0.935 |
| 0.9348 | 0.935 |
| 0.9349 | 0.935 |
| 0.935 | 0.935 |
| 0.9351 | 0.935 |
| 0.9352 | 0.935 |
| 0.9353 | 0.935 |
| 0.9354 | 0.935 |
| 0.9355 | 0.935 |
| 0.9356 | 0.936 |
| 0.9357 | 0.936 |
| 0.9358 | 0.936 |
| 0.9359 | 0.936 |
| 0.936 | 0.936 |
| 0.9361 | 0.936 |
| 0.9362 | 0.936 |
| 0.9363 | 0.936 |
| 0.9364 | 0.936 |
| 0.9365 | 0.936 |
| 0.9366 | 0.937 |
| 0.9367 | 0.937 |
| 0.9368 | 0.937 |
| 0.9369 | 0.937 |
| 0.937 | 0.937 |
| 0.9371 | 0.937 |
| 0.9372 | 0.937 |
| 0.9373 | 0.937 |
| 0.9374 | 0.937 |
| 0.9375 | 0.937 |
| 0.9376 | 0.938 |
| 0.9377 | 0.938 |
| 0.9378 | 0.938 |
| 0.9379 | 0.938 |
| 0.938 | 0.938 |
| 0.9381 | 0.938 |
| 0.9382 | 0.938 |
| 0.9383 | 0.938 |
| 0.9384 | 0.938 |
| 0.9385 | 0.938 |
| 0.9386 | 0.939 |
| 0.9387 | 0.939 |
| 0.9388 | 0.939 |
| 0.9389 | 0.939 |
| 0.939 | 0.939 |
| 0.9391 | 0.939 |
| 0.9392 | 0.939 |
| 0.9393 | 0.939 |
| 0.9394 | 0.939 |
| 0.9395 | 0.939 |
| 0.9396 | 0.94 |
| 0.9397 | 0.94 |
| 0.9398 | 0.94 |
| 0.9399 | 0.94 |
| 0.94 | 0.94 |
| 0.9401 | 0.94 |
| 0.9402 | 0.94 |
| 0.9403 | 0.94 |
| 0.9404 | 0.94 |
| 0.9405 | 0.94 |
| 0.9406 | 0.941 |
| 0.9407 | 0.941 |
| 0.9408 | 0.941 |
| 0.9409 | 0.941 |
| 0.941 | 0.941 |
| 0.9411 | 0.941 |
| 0.9412 | 0.941 |
| 0.9413 | 0.941 |
| 0.9414 | 0.941 |
| 0.9415 | 0.941 |
| 0.9416 | 0.942 |
| 0.9417 | 0.942 |
| 0.9418 | 0.942 |
| 0.9419 | 0.942 |
| 0.942 | 0.942 |
| 0.9421 | 0.942 |
| 0.9422 | 0.942 |
| 0.9423 | 0.942 |
| 0.9424 | 0.942 |
| 0.9425 | 0.942 |
| 0.9426 | 0.943 |
| 0.9427 | 0.943 |
| 0.9428 | 0.943 |
| 0.9429 | 0.943 |
| 0.943 | 0.943 |
| 0.9431 | 0.943 |
| 0.9432 | 0.943 |
| 0.9433 | 0.943 |
| 0.9434 | 0.943 |
| 0.9435 | 0.943 |
| 0.9436 | 0.944 |
| 0.9437 | 0.944 |
| 0.9438 | 0.944 |
| 0.9439 | 0.944 |
| 0.944 | 0.944 |
| 0.9441 | 0.944 |
| 0.9442 | 0.944 |
| 0.9443 | 0.944 |
| 0.9444 | 0.944 |
| 0.9445 | 0.944 |
| 0.9446 | 0.945 |
| 0.9447 | 0.945 |
| 0.9448 | 0.945 |
| 0.9449 | 0.945 |
| 0.945 | 0.945 |
| 0.9451 | 0.945 |
| 0.9452 | 0.945 |
| 0.9453 | 0.945 |
| 0.9454 | 0.945 |
| 0.9455 | 0.945 |
| 0.9456 | 0.946 |
| 0.9457 | 0.946 |
| 0.9458 | 0.946 |
| 0.9459 | 0.946 |
| 0.946 | 0.946 |
| 0.9461 | 0.946 |
| 0.9462 | 0.946 |
| 0.9463 | 0.946 |
| 0.9464 | 0.946 |
| 0.9465 | 0.946 |
| 0.9466 | 0.947 |
| 0.9467 | 0.947 |
| 0.9468 | 0.947 |
| 0.9469 | 0.947 |
| 0.947 | 0.947 |
| 0.9471 | 0.947 |
| 0.9472 | 0.947 |
| 0.9473 | 0.947 |
| 0.9474 | 0.947 |
| 0.9475 | 0.947 |
| 0.9476 | 0.948 |
| 0.9477 | 0.948 |
| 0.9478 | 0.948 |
| 0.9479 | 0.948 |
| 0.948 | 0.948 |
| 0.9481 | 0.948 |
| 0.9482 | 0.948 |
| 0.9483 | 0.948 |
| 0.9484 | 0.948 |
| 0.9485 | 0.948 |
| 0.9486 | 0.949 |
| 0.9487 | 0.949 |
| 0.9488 | 0.949 |
| 0.9489 | 0.949 |
| 0.949 | 0.949 |
| 0.9491 | 0.949 |
| 0.9492 | 0.949 |
| 0.9493 | 0.949 |
| 0.9494 | 0.949 |
| 0.9495 | 0.949 |
| 0.9496 | 0.95 |
| 0.9497 | 0.95 |
| 0.9498 | 0.95 |
| 0.9499 | 0.95 |
| 0.95 | 0.95 |
| 0.9501 | 0.95 |
| 0.9502 | 0.95 |
| 0.9503 | 0.95 |
| 0.9504 | 0.95 |
| 0.9505 | 0.95 |
| 0.9506 | 0.951 |
| 0.9507 | 0.951 |
| 0.9508 | 0.951 |
| 0.9509 | 0.951 |
| 0.951 | 0.951 |
| 0.9511 | 0.951 |
| 0.9512 | 0.951 |
| 0.9513 | 0.951 |
| 0.9514 | 0.951 |
| 0.9515 | 0.951 |
| 0.9516 | 0.952 |
| 0.9517 | 0.952 |
| 0.9518 | 0.952 |
| 0.9519 | 0.952 |
| 0.952 | 0.952 |
| 0.9521 | 0.952 |
| 0.9522 | 0.952 |
| 0.9523 | 0.952 |
| 0.9524 | 0.952 |
| 0.9525 | 0.952 |
| 0.9526 | 0.953 |
| 0.9527 | 0.953 |
| 0.9528 | 0.953 |
| 0.9529 | 0.953 |
| 0.953 | 0.953 |
| 0.9531 | 0.953 |
| 0.9532 | 0.953 |
| 0.9533 | 0.953 |
| 0.9534 | 0.953 |
| 0.9535 | 0.953 |
| 0.9536 | 0.954 |
| 0.9537 | 0.954 |
| 0.9538 | 0.954 |
| 0.9539 | 0.954 |
| 0.954 | 0.954 |
| 0.9541 | 0.954 |
| 0.9542 | 0.954 |
| 0.9543 | 0.954 |
| 0.9544 | 0.954 |
| 0.9545 | 0.954 |
| 0.9546 | 0.955 |
| 0.9547 | 0.955 |
| 0.9548 | 0.955 |
| 0.9549 | 0.955 |
| 0.955 | 0.955 |
| 0.9551 | 0.955 |
| 0.9552 | 0.955 |
| 0.9553 | 0.955 |
| 0.9554 | 0.955 |
| 0.9555 | 0.955 |
| 0.9556 | 0.956 |
| 0.9557 | 0.956 |
| 0.9558 | 0.956 |
| 0.9559 | 0.956 |
| 0.956 | 0.956 |
| 0.9561 | 0.956 |
| 0.9562 | 0.956 |
| 0.9563 | 0.956 |
| 0.9564 | 0.956 |
| 0.9565 | 0.956 |
| 0.9566 | 0.957 |
| 0.9567 | 0.957 |
| 0.9568 | 0.957 |
| 0.9569 | 0.957 |
| 0.957 | 0.957 |
| 0.9571 | 0.957 |
| 0.9572 | 0.957 |
| 0.9573 | 0.957 |
| 0.9574 | 0.957 |
| 0.9575 | 0.957 |
| 0.9576 | 0.958 |
| 0.9577 | 0.958 |
| 0.9578 | 0.958 |
| 0.9579 | 0.958 |
| 0.958 | 0.958 |
| 0.9581 | 0.958 |
| 0.9582 | 0.958 |
| 0.9583 | 0.958 |
| 0.9584 | 0.958 |
| 0.9585 | 0.958 |
| 0.9586 | 0.959 |
| 0.9587 | 0.959 |
| 0.9588 | 0.959 |
| 0.9589 | 0.959 |
| 0.959 | 0.959 |
| 0.9591 | 0.959 |
| 0.9592 | 0.959 |
| 0.9593 | 0.959 |
| 0.9594 | 0.959 |
| 0.9595 | 0.959 |
| 0.9596 | 0.96 |
| 0.9597 | 0.96 |
| 0.9598 | 0.96 |
| 0.9599 | 0.96 |
| 0.96 | 0.96 |
| 0.9601 | 0.96 |
| 0.9602 | 0.96 |
| 0.9603 | 0.96 |
| 0.9604 | 0.96 |
| 0.9605 | 0.96 |
| 0.9606 | 0.961 |
| 0.9607 | 0.961 |
| 0.9608 | 0.961 |
| 0.9609 | 0.961 |
| 0.961 | 0.961 |
| 0.9611 | 0.961 |
| 0.9612 | 0.961 |
| 0.9613 | 0.961 |
| 0.9614 | 0.961 |
| 0.9615 | 0.961 |
| 0.9616 | 0.962 |
| 0.9617 | 0.962 |
| 0.9618 | 0.962 |
| 0.9619 | 0.962 |
| 0.962 | 0.962 |
| 0.9621 | 0.962 |
| 0.9622 | 0.962 |
| 0.9623 | 0.962 |
| 0.9624 | 0.962 |
| 0.9625 | 0.962 |
| 0.9626 | 0.963 |
| 0.9627 | 0.963 |
| 0.9628 | 0.963 |
| 0.9629 | 0.963 |
| 0.963 | 0.963 |
| 0.9631 | 0.963 |
| 0.9632 | 0.963 |
| 0.9633 | 0.963 |
| 0.9634 | 0.963 |
| 0.9635 | 0.963 |
| 0.9636 | 0.964 |
| 0.9637 | 0.964 |
| 0.9638 | 0.964 |
| 0.9639 | 0.964 |
| 0.964 | 0.964 |
| 0.9641 | 0.964 |
| 0.9642 | 0.964 |
| 0.9643 | 0.964 |
| 0.9644 | 0.964 |
| 0.9645 | 0.964 |
| 0.9646 | 0.965 |
| 0.9647 | 0.965 |
| 0.9648 | 0.965 |
| 0.9649 | 0.965 |
| 0.965 | 0.965 |
| 0.9651 | 0.965 |
| 0.9652 | 0.965 |
| 0.9653 | 0.965 |
| 0.9654 | 0.965 |
| 0.9655 | 0.965 |
| 0.9656 | 0.966 |
| 0.9657 | 0.966 |
| 0.9658 | 0.966 |
| 0.9659 | 0.966 |
| 0.966 | 0.966 |
| 0.9661 | 0.966 |
| 0.9662 | 0.966 |
| 0.9663 | 0.966 |
| 0.9664 | 0.966 |
| 0.9665 | 0.966 |
| 0.9666 | 0.967 |
| 0.9667 | 0.967 |
| 0.9668 | 0.967 |
| 0.9669 | 0.967 |
| 0.967 | 0.967 |
| 0.9671 | 0.967 |
| 0.9672 | 0.967 |
| 0.9673 | 0.967 |
| 0.9674 | 0.967 |
| 0.9675 | 0.967 |
| 0.9676 | 0.968 |
| 0.9677 | 0.968 |
| 0.9678 | 0.968 |
| 0.9679 | 0.968 |
| 0.968 | 0.968 |
| 0.9681 | 0.968 |
| 0.9682 | 0.968 |
| 0.9683 | 0.968 |
| 0.9684 | 0.968 |
| 0.9685 | 0.968 |
| 0.9686 | 0.969 |
| 0.9687 | 0.969 |
| 0.9688 | 0.969 |
| 0.9689 | 0.969 |
| 0.969 | 0.969 |
| 0.9691 | 0.969 |
| 0.9692 | 0.969 |
| 0.9693 | 0.969 |
| 0.9694 | 0.969 |
| 0.9695 | 0.969 |
| 0.9696 | 0.97 |
| 0.9697 | 0.97 |
| 0.9698 | 0.97 |
| 0.9699 | 0.97 |
| 0.97 | 0.97 |
| 0.9701 | 0.97 |
| 0.9702 | 0.97 |
| 0.9703 | 0.97 |
| 0.9704 | 0.97 |
| 0.9705 | 0.97 |
| 0.9706 | 0.971 |
| 0.9707 | 0.971 |
| 0.9708 | 0.971 |
| 0.9709 | 0.971 |
| 0.971 | 0.971 |
| 0.9711 | 0.971 |
| 0.9712 | 0.971 |
| 0.9713 | 0.971 |
| 0.9714 | 0.971 |
| 0.9715 | 0.971 |
| 0.9716 | 0.972 |
| 0.9717 | 0.972 |
| 0.9718 | 0.972 |
| 0.9719 | 0.972 |
| 0.972 | 0.972 |
| 0.9721 | 0.972 |
| 0.9722 | 0.972 |
| 0.9723 | 0.972 |
| 0.9724 | 0.972 |
| 0.9725 | 0.972 |
| 0.9726 | 0.973 |
| 0.9727 | 0.973 |
| 0.9728 | 0.973 |
| 0.9729 | 0.973 |
| 0.973 | 0.973 |
| 0.9731 | 0.973 |
| 0.9732 | 0.973 |
| 0.9733 | 0.973 |
| 0.9734 | 0.973 |
| 0.9735 | 0.973 |
| 0.9736 | 0.974 |
| 0.9737 | 0.974 |
| 0.9738 | 0.974 |
| 0.9739 | 0.974 |
| 0.974 | 0.974 |
| 0.9741 | 0.974 |
| 0.9742 | 0.974 |
| 0.9743 | 0.974 |
| 0.9744 | 0.974 |
| 0.9745 | 0.974 |
| 0.9746 | 0.975 |
| 0.9747 | 0.975 |
| 0.9748 | 0.975 |
| 0.9749 | 0.975 |
| 0.975 | 0.975 |
| 0.9751 | 0.975 |
| 0.9752 | 0.975 |
| 0.9753 | 0.975 |
| 0.9754 | 0.975 |
| 0.9755 | 0.975 |
| 0.9756 | 0.976 |
| 0.9757 | 0.976 |
| 0.9758 | 0.976 |
| 0.9759 | 0.976 |
| 0.976 | 0.976 |
| 0.9761 | 0.976 |
| 0.9762 | 0.976 |
| 0.9763 | 0.976 |
| 0.9764 | 0.976 |
| 0.9765 | 0.976 |
| 0.9766 | 0.977 |
| 0.9767 | 0.977 |
| 0.9768 | 0.977 |
| 0.9769 | 0.977 |
| 0.977 | 0.977 |
| 0.9771 | 0.977 |
| 0.9772 | 0.977 |
| 0.9773 | 0.977 |
| 0.9774 | 0.977 |
| 0.9775 | 0.977 |
| 0.9776 | 0.978 |
| 0.9777 | 0.978 |
| 0.9778 | 0.978 |
| 0.9779 | 0.978 |
| 0.978 | 0.978 |
| 0.9781 | 0.978 |
| 0.9782 | 0.978 |
| 0.9783 | 0.978 |
| 0.9784 | 0.978 |
| 0.9785 | 0.978 |
| 0.9786 | 0.979 |
| 0.9787 | 0.979 |
| 0.9788 | 0.979 |
| 0.9789 | 0.979 |
| 0.979 | 0.979 |
| 0.9791 | 0.979 |
| 0.9792 | 0.979 |
| 0.9793 | 0.979 |
| 0.9794 | 0.979 |
| 0.9795 | 0.979 |
| 0.9796 | 0.98 |
| 0.9797 | 0.98 |
| 0.9798 | 0.98 |
| 0.9799 | 0.98 |
| 0.98 | 0.98 |
| 0.9801 | 0.98 |
| 0.9802 | 0.98 |
| 0.9803 | 0.98 |
| 0.9804 | 0.98 |
| 0.9805 | 0.98 |
| 0.9806 | 0.981 |
| 0.9807 | 0.981 |
| 0.9808 | 0.981 |
| 0.9809 | 0.981 |
| 0.981 | 0.981 |
| 0.9811 | 0.981 |
| 0.9812 | 0.981 |
| 0.9813 | 0.981 |
| 0.9814 | 0.981 |
| 0.9815 | 0.981 |
| 0.9816 | 0.982 |
| 0.9817 | 0.982 |
| 0.9818 | 0.982 |
| 0.9819 | 0.982 |
| 0.982 | 0.982 |
| 0.9821 | 0.982 |
| 0.9822 | 0.982 |
| 0.9823 | 0.982 |
| 0.9824 | 0.982 |
| 0.9825 | 0.982 |
| 0.9826 | 0.983 |
| 0.9827 | 0.983 |
| 0.9828 | 0.983 |
| 0.9829 | 0.983 |
| 0.983 | 0.983 |
| 0.9831 | 0.983 |
| 0.9832 | 0.983 |
| 0.9833 | 0.983 |
| 0.9834 | 0.983 |
| 0.9835 | 0.983 |
| 0.9836 | 0.984 |
| 0.9837 | 0.984 |
| 0.9838 | 0.984 |
| 0.9839 | 0.984 |
| 0.984 | 0.984 |
| 0.9841 | 0.984 |
| 0.9842 | 0.984 |
| 0.9843 | 0.984 |
| 0.9844 | 0.984 |
| 0.9845 | 0.984 |
| 0.9846 | 0.985 |
| 0.9847 | 0.985 |
| 0.9848 | 0.985 |
| 0.9849 | 0.985 |
| 0.985 | 0.985 |
| 0.9851 | 0.985 |
| 0.9852 | 0.985 |
| 0.9853 | 0.985 |
| 0.9854 | 0.985 |
| 0.9855 | 0.985 |
| 0.9856 | 0.986 |
| 0.9857 | 0.986 |
| 0.9858 | 0.986 |
| 0.9859 | 0.986 |
| 0.986 | 0.986 |
| 0.9861 | 0.986 |
| 0.9862 | 0.986 |
| 0.9863 | 0.986 |
| 0.9864 | 0.986 |
| 0.9865 | 0.986 |
| 0.9866 | 0.987 |
| 0.9867 | 0.987 |
| 0.9868 | 0.987 |
| 0.9869 | 0.987 |
| 0.987 | 0.987 |
| 0.9871 | 0.987 |
| 0.9872 | 0.987 |
| 0.9873 | 0.987 |
| 0.9874 | 0.987 |
| 0.9875 | 0.987 |
| 0.9876 | 0.988 |
| 0.9877 | 0.988 |
| 0.9878 | 0.988 |
| 0.9879 | 0.988 |
| 0.988 | 0.988 |
| 0.9881 | 0.988 |
| 0.9882 | 0.988 |
| 0.9883 | 0.988 |
| 0.9884 | 0.988 |
| 0.9885 | 0.988 |
| 0.9886 | 0.989 |
| 0.9887 | 0.989 |
| 0.9888 | 0.989 |
| 0.9889 | 0.989 |
| 0.989 | 0.989 |
| 0.9891 | 0.989 |
| 0.9892 | 0.989 |
| 0.9893 | 0.989 |
| 0.9894 | 0.989 |
| 0.9895 | 0.989 |
| 0.9896 | 0.99 |
| 0.9897 | 0.99 |
| 0.9898 | 0.99 |
| 0.9899 | 0.99 |
| 0.99 | 0.99 |
| 0.9901 | 0.99 |
| 0.9902 | 0.99 |
| 0.9903 | 0.99 |
| 0.9904 | 0.99 |
| 0.9905 | 0.99 |
| 0.9906 | 0.991 |
| 0.9907 | 0.991 |
| 0.9908 | 0.991 |
| 0.9909 | 0.991 |
| 0.991 | 0.991 |
| 0.9911 | 0.991 |
| 0.9912 | 0.991 |
| 0.9913 | 0.991 |
| 0.9914 | 0.991 |
| 0.9915 | 0.991 |
| 0.9916 | 0.992 |
| 0.9917 | 0.992 |
| 0.9918 | 0.992 |
| 0.9919 | 0.992 |
| 0.992 | 0.992 |
| 0.9921 | 0.992 |
| 0.9922 | 0.992 |
| 0.9923 | 0.992 |
| 0.9924 | 0.992 |
| 0.9925 | 0.992 |
| 0.9926 | 0.993 |
| 0.9927 | 0.993 |
| 0.9928 | 0.993 |
| 0.9929 | 0.993 |
| 0.993 | 0.993 |
| 0.9931 | 0.993 |
| 0.9932 | 0.993 |
| 0.9933 | 0.993 |
| 0.9934 | 0.993 |
| 0.9935 | 0.993 |
| 0.9936 | 0.994 |
| 0.9937 | 0.994 |
| 0.9938 | 0.994 |
| 0.9939 | 0.994 |
| 0.994 | 0.994 |
| 0.9941 | 0.994 |
| 0.9942 | 0.994 |
| 0.9943 | 0.994 |
| 0.9944 | 0.994 |
| 0.9945 | 0.994 |
| 0.9946 | 0.995 |
| 0.9947 | 0.995 |
| 0.9948 | 0.995 |
| 0.9949 | 0.995 |
| 0.995 | 0.995 |
| 0.9951 | 0.995 |
| 0.9952 | 0.995 |
| 0.9953 | 0.995 |
| 0.9954 | 0.995 |
| 0.9955 | 0.995 |
| 0.9956 | 0.996 |
| 0.9957 | 0.996 |
| 0.9958 | 0.996 |
| 0.9959 | 0.996 |
| 0.996 | 0.996 |
| 0.9961 | 0.996 |
| 0.9962 | 0.996 |
| 0.9963 | 0.996 |
| 0.9964 | 0.996 |
| 0.9965 | 0.996 |
| 0.9966 | 0.997 |
| 0.9967 | 0.997 |
| 0.9968 | 0.997 |
| 0.9969 | 0.997 |
| 0.997 | 0.997 |
| 0.9971 | 0.997 |
| 0.9972 | 0.997 |
| 0.9973 | 0.997 |
| 0.9974 | 0.997 |
| 0.9975 | 0.997 |
| 0.9976 | 0.998 |
| 0.9977 | 0.998 |
| 0.9978 | 0.998 |
| 0.9979 | 0.998 |
| 0.998 | 0.998 |
| 0.9981 | 0.998 |
| 0.9982 | 0.998 |
| 0.9983 | 0.998 |
| 0.9984 | 0.998 |
| 0.9985 | 0.998 |
| 0.9986 | 0.999 |
| 0.9987 | 0.999 |
| 0.9988 | 0.999 |
| 0.9989 | 0.999 |
| 0.999 | 0.999 |
| 0.9991 | 0.999 |
| 0.9992 | 0.999 |
| 0.9993 | 0.999 |
| 0.9994 | 0.999 |
| 0.9995 | 0.999 |
| 0.9996 | 1 |
| 0.9997 | 1 |
| 0.9998 | 1 |
| 0.9999 | 1 |